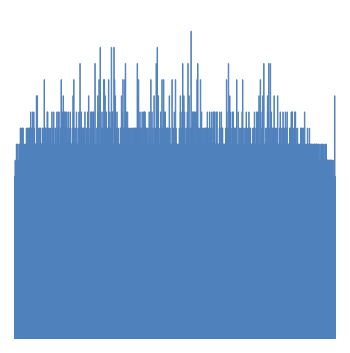
| Category | Series 1 |
|---|---|
| 0 | 0 |
| 1 | 0 |
| 2 | 0 |
| 3 | 0 |
| 4 | 0 |
| 5 | 0 |
| 6 | 0 |
| 7 | 0 |
| 8 | 0 |
| 9 | 0 |
| 10 | 0 |
| 11 | 0 |
| 12 | 0 |
| 13 | 0 |
| 14 | 0 |
| 15 | 0 |
| 16 | 0 |
| 17 | 0 |
| 18 | 0 |
| 19 | 0 |
| 20 | 0 |
| 21 | 0 |
| 22 | 0 |
| 23 | 0 |
| 24 | 0 |
| 25 | 0 |
| 26 | 0 |
| 27 | 0 |
| 28 | 0 |
| 29 | 0 |
| 30 | 0 |
| 31 | 0 |
| 32 | 0 |
| 33 | 0 |
| 34 | 0 |
| 35 | 0 |
| 36 | 0 |
| 37 | 0 |
| 38 | 0 |
| 39 | 0 |
| 40 | 0 |
| 41 | 0 |
| 42 | 0 |
| 43 | 0 |
| 44 | 0 |
| 45 | 0 |
| 46 | 0 |
| 47 | 0 |
| 48 | 0 |
| 49 | 0 |
| 50 | 0 |
| 51 | 0 |
| 52 | 0 |
| 53 | 0 |
| 54 | 0 |
| 55 | 0 |
| 56 | 0 |
| 57 | 0 |
| 58 | 0 |
| 59 | 0 |
| 60 | 0 |
| 61 | 0 |
| 62 | 0 |
| 63 | 0 |
| 64 | 0 |
| 65 | 0 |
| 66 | 0 |
| 67 | 0 |
| 68 | 0 |
| 69 | 0 |
| 70 | 0 |
| 71 | 0 |
| 72 | 0 |
| 73 | 0 |
| 74 | 0 |
| 75 | 0 |
| 76 | 0 |
| 77 | 0 |
| 78 | 0 |
| 79 | 0 |
| 80 | 0 |
| 81 | 0 |
| 82 | 0 |
| 83 | 0 |
| 84 | 0 |
| 85 | 0 |
| 86 | 0 |
| 87 | 0 |
| 88 | 0 |
| 89 | 0 |
| 90 | 0 |
| 91 | 0 |
| 92 | 0 |
| 93 | 0 |
| 94 | 0 |
| 95 | 0 |
| 96 | 0 |
| 97 | 0 |
| 98 | 0 |
| 99 | 0 |
| 100 | 0 |
| 101 | 0 |
| 102 | 0 |
| 103 | 0 |
| 104 | 0 |
| 105 | 0 |
| 106 | 0 |
| 107 | 0 |
| 108 | 0 |
| 109 | 0 |
| 110 | 0 |
| 111 | 0 |
| 112 | 0 |
| 113 | 0 |
| 114 | 0 |
| 115 | 0 |
| 116 | 0 |
| 117 | 0 |
| 118 | 0 |
| 119 | 0 |
| 120 | 0 |
| 121 | 0 |
| 122 | 0 |
| 123 | 0 |
| 124 | 0 |
| 125 | 0 |
| 126 | 0 |
| 127 | 0 |
| 128 | 0 |
| 129 | 0 |
| 130 | 0 |
| 131 | 0 |
| 132 | 0 |
| 133 | 0 |
| 134 | 0 |
| 135 | 0 |
| 136 | 0 |
| 137 | 0 |
| 138 | 0 |
| 139 | 0 |
| 140 | 0 |
| 141 | 0 |
| 142 | 0 |
| 143 | 0 |
| 144 | 0 |
| 145 | 0 |
| 146 | 0 |
| 147 | 0 |
| 148 | 0 |
| 149 | 0 |
| 150 | 0 |
| 151 | 0 |
| 152 | 0 |
| 153 | 0 |
| 154 | 0 |
| 155 | 0 |
| 156 | 0 |
| 157 | 0 |
| 158 | 0 |
| 159 | 0 |
| 160 | 0 |
| 161 | 0 |
| 162 | 0 |
| 163 | 0 |
| 164 | 0 |
| 165 | 0 |
| 166 | 0 |
| 167 | 0 |
| 168 | 0 |
| 169 | 0 |
| 170 | 0 |
| 171 | 0 |
| 172 | 0 |
| 173 | 0 |
| 174 | 0 |
| 175 | 0 |
| 176 | 0 |
| 177 | 0 |
| 178 | 0 |
| 179 | 0 |
| 180 | 0 |
| 181 | 0 |
| 182 | 0 |
| 183 | 0 |
| 184 | 0 |
| 185 | 0 |
| 186 | 0 |
| 187 | 0 |
| 188 | 0 |
| 189 | 0 |
| 190 | 0 |
| 191 | 0 |
| 192 | 0 |
| 193 | 0 |
| 194 | 0 |
| 195 | 0 |
| 196 | 0 |
| 197 | 0 |
| 198 | 0 |
| 199 | 0 |
| 200 | 0 |
| 201 | 0 |
| 202 | 0 |
| 203 | 0 |
| 204 | 0 |
| 205 | 0 |
| 206 | 0 |
| 207 | 0 |
| 208 | 0 |
| 209 | 0 |
| 210 | 0 |
| 211 | 0 |
| 212 | 0 |
| 213 | 0 |
| 214 | 0 |
| 215 | 0 |
| 216 | 0 |
| 217 | 0 |
| 218 | 0 |
| 219 | 0 |
| 220 | 0 |
| 221 | 0 |
| 222 | 0 |
| 223 | 0 |
| 224 | 0 |
| 225 | 0 |
| 226 | 0 |
| 227 | 0 |
| 228 | 0 |
| 229 | 0 |
| 230 | 0 |
| 231 | 0 |
| 232 | 0 |
| 233 | 0 |
| 234 | 0 |
| 235 | 0 |
| 236 | 0 |
| 237 | 0 |
| 238 | 0 |
| 239 | 0 |
| 240 | 0 |
| 241 | 0 |
| 242 | 0 |
| 243 | 0 |
| 244 | 0 |
| 245 | 0 |
| 246 | 0 |
| 247 | 0 |
| 248 | 0 |
| 249 | 0 |
| 250 | 0 |
| 251 | 0 |
| 252 | 0 |
| 253 | 0 |
| 254 | 0 |
| 255 | 0 |
| 256 | 0 |
| 257 | 0 |
| 258 | 0 |
| 259 | 0 |
| 260 | 0 |
| 261 | 0 |
| 262 | 0 |
| 263 | 0 |
| 264 | 0 |
| 265 | 0 |
| 266 | 0 |
| 267 | 0 |
| 268 | 0 |
| 269 | 0 |
| 270 | 0 |
| 271 | 0 |
| 272 | 0 |
| 273 | 0 |
| 274 | 0 |
| 275 | 0 |
| 276 | 0 |
| 277 | 0 |
| 278 | 0 |
| 279 | 0 |
| 280 | 0 |
| 281 | 0 |
| 282 | 0 |
| 283 | 0 |
| 284 | 0 |
| 285 | 0 |
| 286 | 0 |
| 287 | 0 |
| 288 | 0 |
| 289 | 0 |
| 290 | 0 |
| 291 | 0 |
| 292 | 0 |
| 293 | 0 |
| 294 | 0 |
| 295 | 0 |
| 296 | 0 |
| 297 | 0 |
| 298 | 0 |
| 299 | 0 |
| 300 | 0 |
| 301 | 0 |
| 302 | 0 |
| 303 | 0 |
| 304 | 0 |
| 305 | 0 |
| 306 | 0 |
| 307 | 0 |
| 308 | 0 |
| 309 | 0 |
| 310 | 0 |
| 311 | 0 |
| 312 | 0 |
| 313 | 0 |
| 314 | 0 |
| 315 | 0 |
| 316 | 0 |
| 317 | 0 |
| 318 | 0 |
| 319 | 0 |
| 320 | 0 |
| 321 | 0 |
| 322 | 0 |
| 323 | 0 |
| 324 | 0 |
| 325 | 0 |
| 326 | 0 |
| 327 | 0 |
| 328 | 0 |
| 329 | 0 |
| 330 | 0 |
| 331 | 0 |
| 332 | 0 |
| 333 | 0 |
| 334 | 0 |
| 335 | 0 |
| 336 | 0 |
| 337 | 0 |
| 338 | 0 |
| 339 | 0 |
| 340 | 0 |
| 341 | 0 |
| 342 | 0 |
| 343 | 0 |
| 344 | 0 |
| 345 | 0 |
| 346 | 0 |
| 347 | 0 |
| 348 | 0 |
| 349 | 0 |
| 350 | 0 |
| 351 | 0 |
| 352 | 0 |
| 353 | 0 |
| 354 | 0 |
| 355 | 0 |
| 356 | 0 |
| 357 | 0 |
| 358 | 0 |
| 359 | 0 |
| 360 | 0 |
| 361 | 0 |
| 362 | 0 |
| 363 | 0 |
| 364 | 0 |
| 365 | 0 |
| 366 | 0 |
| 367 | 0 |
| 368 | 0 |
| 369 | 0 |
| 370 | 0 |
| 371 | 0 |
| 372 | 0 |
| 373 | 0 |
| 374 | 0 |
| 375 | 0 |
| 376 | 0 |
| 377 | 0 |
| 378 | 0 |
| 379 | 0 |
| 380 | 0 |
| 381 | 0 |
| 382 | 0 |
| 383 | 0 |
| 384 | 0 |
| 385 | 0 |
| 386 | 0 |
| 387 | 0 |
| 388 | 0 |
| 389 | 0 |
| 390 | 0 |
| 391 | 0 |
| 392 | 0 |
| 393 | 0 |
| 394 | 0 |
| 395 | 0 |
| 396 | 0 |
| 397 | 0 |
| 398 | 0 |
| 399 | 0 |
| 400 | 0 |
| 401 | 0 |
| 402 | 0 |
| 403 | 0 |
| 404 | 0 |
| 405 | 0 |
| 406 | 0 |
| 407 | 0 |
| 408 | 0 |
| 409 | 0 |
| 410 | 0 |
| 411 | 0 |
| 412 | 0 |
| 413 | 0 |
| 414 | 0 |
| 415 | 0 |
| 416 | 0 |
| 417 | 0 |
| 418 | 0 |
| 419 | 0 |
| 420 | 0 |
| 421 | 0 |
| 422 | 0 |
| 423 | 0 |
| 424 | 0 |
| 425 | 0 |
| 426 | 0 |
| 427 | 0 |
| 428 | 0 |
| 429 | 0 |
| 430 | 0 |
| 431 | 0 |
| 432 | 0 |
| 433 | 0 |
| 434 | 0 |
| 435 | 0 |
| 436 | 0 |
| 437 | 0 |
| 438 | 0 |
| 439 | 0 |
| 440 | 0 |
| 441 | 0 |
| 442 | 0 |
| 443 | 0 |
| 444 | 0 |
| 445 | 0 |
| 446 | 0 |
| 447 | 0 |
| 448 | 0 |
| 449 | 0 |
| 450 | 0 |
| 451 | 0 |
| 452 | 0 |
| 453 | 0 |
| 454 | 0 |
| 455 | 0 |
| 456 | 0 |
| 457 | 0 |
| 458 | 0 |
| 459 | 0 |
| 460 | 0 |
| 461 | 0 |
| 462 | 0 |
| 463 | 0 |
| 464 | 0 |
| 465 | 0 |
| 466 | 0 |
| 467 | 0 |
| 468 | 0 |
| 469 | 0 |
| 470 | 0 |
| 471 | 0 |
| 472 | 0 |
| 473 | 0 |
| 474 | 0 |
| 475 | 0 |
| 476 | 0 |
| 477 | 0 |
| 478 | 0 |
| 479 | 0 |
| 480 | 0 |
| 481 | 0 |
| 482 | 0 |
| 483 | 0 |
| 484 | 0 |
| 485 | 0 |
| 486 | 0 |
| 487 | 0 |
| 488 | 0 |
| 489 | 0 |
| 490 | 0 |
| 491 | 0 |
| 492 | 0 |
| 493 | 0 |
| 494 | 0 |
| 495 | 0 |
| 496 | 0 |
| 497 | 0 |
| 498 | 0 |
| 499 | 0 |
| 500 | 0 |
| 501 | 0 |
| 502 | 0 |
| 503 | 0 |
| 504 | 0 |
| 505 | 0 |
| 506 | 0 |
| 507 | 0 |
| 508 | 0 |
| 509 | 0 |
| 510 | 0 |
| 511 | 0 |
| 512 | 0 |
| 513 | 0 |
| 514 | 0 |
| 515 | 0 |
| 516 | 0 |
| 517 | 0 |
| 518 | 0 |
| 519 | 0 |
| 520 | 0 |
| 521 | 0 |
| 522 | 0 |
| 523 | 0 |
| 524 | 0 |
| 525 | 0 |
| 526 | 0 |
| 527 | 0 |
| 528 | 0 |
| 529 | 0 |
| 530 | 0 |
| 531 | 0 |
| 532 | 0 |
| 533 | 0 |
| 534 | 0 |
| 535 | 0 |
| 536 | 0 |
| 537 | 0 |
| 538 | 0 |
| 539 | 0 |
| 540 | 0 |
| 541 | 0 |
| 542 | 0 |
| 543 | 0 |
| 544 | 0 |
| 545 | 0 |
| 546 | 0 |
| 547 | 0 |
| 548 | 0 |
| 549 | 0 |
| 550 | 0 |
| 551 | 0 |
| 552 | 0 |
| 553 | 0 |
| 554 | 0 |
| 555 | 0 |
| 556 | 0 |
| 557 | 0 |
| 558 | 0 |
| 559 | 0 |
| 560 | 0 |
| 561 | 0 |
| 562 | 0 |
| 563 | 0 |
| 564 | 0 |
| 565 | 0 |
| 566 | 0 |
| 567 | 0 |
| 568 | 0 |
| 569 | 0 |
| 570 | 0 |
| 571 | 0 |
| 572 | 0 |
| 573 | 0 |
| 574 | 0 |
| 575 | 0 |
| 576 | 0 |
| 577 | 0 |
| 578 | 0 |
| 579 | 0 |
| 580 | 0 |
| 581 | 0 |
| 582 | 0 |
| 583 | 0 |
| 584 | 0 |
| 585 | 0 |
| 586 | 0 |
| 587 | 0 |
| 588 | 0 |
| 589 | 0 |
| 590 | 0 |
| 591 | 0 |
| 592 | 0 |
| 593 | 0 |
| 594 | 0 |
| 595 | 0 |
| 596 | 0 |
| 597 | 0 |
| 598 | 0 |
| 599 | 0 |
| 600 | 0 |
| 601 | 0 |
| 602 | 0 |
| 603 | 0 |
| 604 | 0 |
| 605 | 0 |
| 606 | 0 |
| 607 | 0 |
| 608 | 0 |
| 609 | 0 |
| 610 | 0 |
| 611 | 0 |
| 612 | 0 |
| 613 | 0 |
| 614 | 0 |
| 615 | 0 |
| 616 | 0 |
| 617 | 0 |
| 618 | 0 |
| 619 | 0 |
| 620 | 0 |
| 621 | 0 |
| 622 | 0 |
| 623 | 0 |
| 624 | 0 |
| 625 | 0 |
| 626 | 0 |
| 627 | 0 |
| 628 | 0 |
| 629 | 0 |
| 630 | 0 |
| 631 | 0 |
| 632 | 0 |
| 633 | 0 |
| 634 | 0 |
| 635 | 0 |
| 636 | 0 |
| 637 | 0 |
| 638 | 0 |
| 639 | 0 |
| 640 | 0 |
| 641 | 0 |
| 642 | 0 |
| 643 | 0 |
| 644 | 0 |
| 645 | 0 |
| 646 | 0 |
| 647 | 0 |
| 648 | 0 |
| 649 | 0 |
| 650 | 0 |
| 651 | 0 |
| 652 | 0 |
| 653 | 0 |
| 654 | 0 |
| 655 | 0 |
| 656 | 0 |
| 657 | 0 |
| 658 | 0 |
| 659 | 0 |
| 660 | 0 |
| 661 | 0 |
| 662 | 0 |
| 663 | 0 |
| 664 | 0 |
| 665 | 0 |
| 666 | 0 |
| 667 | 0 |
| 668 | 0 |
| 669 | 0 |
| 670 | 0 |
| 671 | 0 |
| 672 | 0 |
| 673 | 0 |
| 674 | 0 |
| 675 | 0 |
| 676 | 0 |
| 677 | 0 |
| 678 | 0 |
| 679 | 0 |
| 680 | 0 |
| 681 | 0 |
| 682 | 0 |
| 683 | 0 |
| 684 | 0 |
| 685 | 0 |
| 686 | 0 |
| 687 | 0 |
| 688 | 0 |
| 689 | 0 |
| 690 | 0 |
| 691 | 0 |
| 692 | 0 |
| 693 | 0 |
| 694 | 0 |
| 695 | 0 |
| 696 | 0 |
| 697 | 0 |
| 698 | 0 |
| 699 | 0 |
| 700 | 0 |
| 701 | 0 |
| 702 | 0 |
| 703 | 0 |
| 704 | 0 |
| 705 | 0 |
| 706 | 0 |
| 707 | 0 |
| 708 | 0 |
| 709 | 0 |
| 710 | 0 |
| 711 | 0 |
| 712 | 0 |
| 713 | 0 |
| 714 | 0 |
| 715 | 0 |
| 716 | 0 |
| 717 | 0 |
| 718 | 0 |
| 719 | 0 |
| 720 | 0 |
| 721 | 0 |
| 722 | 0 |
| 723 | 0 |
| 724 | 0 |
| 725 | 0 |
| 726 | 0 |
| 727 | 0 |
| 728 | 0 |
| 729 | 0 |
| 730 | 0 |
| 731 | 0 |
| 732 | 0 |
| 733 | 0 |
| 734 | 0 |
| 735 | 0 |
| 736 | 0 |
| 737 | 0 |
| 738 | 0 |
| 739 | 0 |
| 740 | 0 |
| 741 | 0 |
| 742 | 0 |
| 743 | 0 |
| 744 | 0 |
| 745 | 0 |
| 746 | 0 |
| 747 | 0 |
| 748 | 0 |
| 749 | 0 |
| 750 | 0 |
| 751 | 0 |
| 752 | 0 |
| 753 | 0 |
| 754 | 0 |
| 755 | 0 |
| 756 | 0 |
| 757 | 0 |
| 758 | 0 |
| 759 | 0 |
| 760 | 0 |
| 761 | 0 |
| 762 | 0 |
| 763 | 0 |
| 764 | 0 |
| 765 | 0 |
| 766 | 0 |
| 767 | 0 |
| 768 | 0 |
| 769 | 0 |
| 770 | 0 |
| 771 | 0 |
| 772 | 0 |
| 773 | 0 |
| 774 | 0 |
| 775 | 0 |
| 776 | 0 |
| 777 | 0 |
| 778 | 0 |
| 779 | 0 |
| 780 | 0 |
| 781 | 0 |
| 782 | 0 |
| 783 | 0 |
| 784 | 0 |
| 785 | 0 |
| 786 | 0 |
| 787 | 0 |
| 788 | 0 |
| 789 | 0 |
| 790 | 0 |
| 791 | 0 |
| 792 | 0 |
| 793 | 0 |
| 794 | 0 |
| 795 | 0 |
| 796 | 0 |
| 797 | 0 |
| 798 | 0 |
| 799 | 0 |
| 800 | 0 |
| 801 | 0 |
| 802 | 0 |
| 803 | 0 |
| 804 | 0 |
| 805 | 0 |
| 806 | 0 |
| 807 | 0 |
| 808 | 0 |
| 809 | 0 |
| 810 | 0 |
| 811 | 0 |
| 812 | 0 |
| 813 | 0 |
| 814 | 0 |
| 815 | 0 |
| 816 | 0 |
| 817 | 0 |
| 818 | 0 |
| 819 | 0 |
| 820 | 0 |
| 821 | 0 |
| 822 | 0 |
| 823 | 0 |
| 824 | 0 |
| 825 | 0 |
| 826 | 0 |
| 827 | 0 |
| 828 | 0 |
| 829 | 0 |
| 830 | 0 |
| 831 | 0 |
| 832 | 0 |
| 833 | 0 |
| 834 | 0 |
| 835 | 0 |
| 836 | 0 |
| 837 | 0 |
| 838 | 0 |
| 839 | 0 |
| 840 | 0 |
| 841 | 0 |
| 842 | 0 |
| 843 | 0 |
| 844 | 0 |
| 845 | 0 |
| 846 | 0 |
| 847 | 0 |
| 848 | 0 |
| 849 | 0 |
| 850 | 0 |
| 851 | 0 |
| 852 | 0 |
| 853 | 0 |
| 854 | 0 |
| 855 | 0 |
| 856 | 0 |
| 857 | 0 |
| 858 | 0 |
| 859 | 0 |
| 860 | 0 |
| 861 | 0 |
| 862 | 0 |
| 863 | 0 |
| 864 | 0 |
| 865 | 0 |
| 866 | 0 |
| 867 | 0 |
| 868 | 0 |
| 869 | 0 |
| 870 | 0 |
| 871 | 0 |
| 872 | 0 |
| 873 | 0 |
| 874 | 0 |
| 875 | 0 |
| 876 | 0 |
| 877 | 0 |
| 878 | 0 |
| 879 | 0 |
| 880 | 0 |
| 881 | 0 |
| 882 | 0 |
| 883 | 0 |
| 884 | 0 |
| 885 | 0 |
| 886 | 0 |
| 887 | 0 |
| 888 | 0 |
| 889 | 0 |
| 890 | 0 |
| 891 | 0 |
| 892 | 0 |
| 893 | 0 |
| 894 | 0 |
| 895 | 0 |
| 896 | 0 |
| 897 | 0 |
| 898 | 0 |
| 899 | 0 |
| 900 | 0 |
| 901 | 0 |
| 902 | 0 |
| 903 | 0 |
| 904 | 0 |
| 905 | 0 |
| 906 | 0 |
| 907 | 0 |
| 908 | 0 |
| 909 | 0 |
| 910 | 0 |
| 911 | 0 |
| 912 | 0 |
| 913 | 0 |
| 914 | 0 |
| 915 | 0 |
| 916 | 0 |
| 917 | 0 |
| 918 | 0 |
| 919 | 0 |
| 920 | 0 |
| 921 | 0 |
| 922 | 0 |
| 923 | 0 |
| 924 | 0 |
| 925 | 0 |
| 926 | 0 |
| 927 | 0 |
| 928 | 0 |
| 929 | 0 |
| 930 | 0 |
| 931 | 0 |
| 932 | 0 |
| 933 | 0 |
| 934 | 0 |
| 935 | 0 |
| 936 | 0 |
| 937 | 0 |
| 938 | 0 |
| 939 | 0 |
| 940 | 0 |
| 941 | 0 |
| 942 | 0 |
| 943 | 0 |
| 944 | 0 |
| 945 | 0 |
| 946 | 0 |
| 947 | 0 |
| 948 | 0 |
| 949 | 0 |
| 950 | 0 |
| 951 | 0 |
| 952 | 0 |
| 953 | 0 |
| 954 | 0 |
| 955 | 0 |
| 956 | 0 |
| 957 | 0 |
| 958 | 0 |
| 959 | 0 |
| 960 | 0 |
| 961 | 0 |
| 962 | 0 |
| 963 | 0 |
| 964 | 0 |
| 965 | 0 |
| 966 | 0 |
| 967 | 0 |
| 968 | 0 |
| 969 | 0 |
| 970 | 0 |
| 971 | 0 |
| 972 | 0 |
| 973 | 0 |
| 974 | 0 |
| 975 | 0 |
| 976 | 0 |
| 977 | 0 |
| 978 | 0 |
| 979 | 0 |
| 980 | 0 |
| 981 | 0 |
| 982 | 0 |
| 983 | 0 |
| 984 | 0 |
| 985 | 0 |
| 986 | 0 |
| 987 | 0 |
| 988 | 0 |
| 989 | 0 |
| 990 | 0 |
| 991 | 0 |
| 992 | 0 |
| 993 | 0 |
| 994 | 0 |
| 995 | 0 |
| 996 | 0 |
| 997 | 0 |
| 998 | 0 |
| 999 | 0 |
| 1000 | 0 |
| 1001 | 0 |
| 1002 | 0 |
| 1003 | 0 |
| 1004 | 0 |
| 1005 | 0 |
| 1006 | 0 |
| 1007 | 0 |
| 1008 | 0 |
| 1009 | 0 |
| 1010 | 0 |
| 1011 | 0 |
| 1012 | 0 |
| 1013 | 0 |
| 1014 | 0 |
| 1015 | 0 |
| 1016 | 0 |
| 1017 | 0 |
| 1018 | 0 |
| 1019 | 0 |
| 1020 | 0 |
| 1021 | 0 |
| 1022 | 0 |
| 1023 | 0 |
| 1024 | 0 |
| 1025 | 0 |
| 1026 | 0 |
| 1027 | 0 |
| 1028 | 0 |
| 1029 | 0 |
| 1030 | 0 |
| 1031 | 0 |
| 1032 | 0 |
| 1033 | 0 |
| 1034 | 0 |
| 1035 | 0 |
| 1036 | 0 |
| 1037 | 0 |
| 1038 | 0 |
| 1039 | 0 |
| 1040 | 0 |
| 1041 | 0 |
| 1042 | 0 |
| 1043 | 0 |
| 1044 | 0 |
| 1045 | 0 |
| 1046 | 0 |
| 1047 | 0 |
| 1048 | 0 |
| 1049 | 0 |
| 1050 | 0 |
| 1051 | 0 |
| 1052 | 0 |
| 1053 | 0 |
| 1054 | 0 |
| 1055 | 0 |
| 1056 | 0 |
| 1057 | 0 |
| 1058 | 0 |
| 1059 | 0 |
| 1060 | 0 |
| 1061 | 0 |
| 1062 | 0 |
| 1063 | 0 |
| 1064 | 0 |
| 1065 | 0 |
| 1066 | 0 |
| 1067 | 0 |
| 1068 | 0 |
| 1069 | 0 |
| 1070 | 0 |
| 1071 | 0 |
| 1072 | 0 |
| 1073 | 0 |
| 1074 | 0 |
| 1075 | 0 |
| 1076 | 0 |
| 1077 | 0 |
| 1078 | 0 |
| 1079 | 0 |
| 1080 | 0 |
| 1081 | 0 |
| 1082 | 0 |
| 1083 | 0 |
| 1084 | 0 |
| 1085 | 0 |
| 1086 | 0 |
| 1087 | 0 |
| 1088 | 0 |
| 1089 | 0 |
| 1090 | 0 |
| 1091 | 0 |
| 1092 | 0 |
| 1093 | 0 |
| 1094 | 0 |
| 1095 | 0 |
| 1096 | 0 |
| 1097 | 0 |
| 1098 | 0 |
| 1099 | 0 |
| 1100 | 0 |
| 1101 | 0 |
| 1102 | 0 |
| 1103 | 0 |
| 1104 | 0 |
| 1105 | 0 |
| 1106 | 0 |
| 1107 | 0 |
| 1108 | 0 |
| 1109 | 0 |
| 1110 | 0 |
| 1111 | 0 |
| 1112 | 0 |
| 1113 | 0 |
| 1114 | 0 |
| 1115 | 0 |
| 1116 | 0 |
| 1117 | 0 |
| 1118 | 0 |
| 1119 | 0 |
| 1120 | 0 |
| 1121 | 0 |
| 1122 | 0 |
| 1123 | 0 |
| 1124 | 0 |
| 1125 | 0 |
| 1126 | 0 |
| 1127 | 0 |
| 1128 | 0 |
| 1129 | 0 |
| 1130 | 0 |
| 1131 | 0 |
| 1132 | 0 |
| 1133 | 0 |
| 1134 | 0 |
| 1135 | 0 |
| 1136 | 0 |
| 1137 | 0 |
| 1138 | 0 |
| 1139 | 0 |
| 1140 | 0 |
| 1141 | 0 |
| 1142 | 0 |
| 1143 | 0 |
| 1144 | 0 |
| 1145 | 0 |
| 1146 | 0 |
| 1147 | 0 |
| 1148 | 0 |
| 1149 | 0 |
| 1150 | 0 |
| 1151 | 0 |
| 1152 | 0 |
| 1153 | 0 |
| 1154 | 0 |
| 1155 | 0 |
| 1156 | 0 |
| 1157 | 0 |
| 1158 | 0 |
| 1159 | 0 |
| 1160 | 0 |
| 1161 | 0 |
| 1162 | 0 |
| 1163 | 0 |
| 1164 | 0 |
| 1165 | 0 |
| 1166 | 0 |
| 1167 | 0 |
| 1168 | 0 |
| 1169 | 0 |
| 1170 | 0 |
| 1171 | 0 |
| 1172 | 0 |
| 1173 | 0 |
| 1174 | 0 |
| 1175 | 0 |
| 1176 | 0 |
| 1177 | 0 |
| 1178 | 0 |
| 1179 | 0 |
| 1180 | 0 |
| 1181 | 0 |
| 1182 | 0 |
| 1183 | 0 |
| 1184 | 0 |
| 1185 | 0 |
| 1186 | 0 |
| 1187 | 0 |
| 1188 | 0 |
| 1189 | 0 |
| 1190 | 0 |
| 1191 | 0 |
| 1192 | 0 |
| 1193 | 0 |
| 1194 | 0 |
| 1195 | 0 |
| 1196 | 0 |
| 1197 | 0 |
| 1198 | 0 |
| 1199 | 0 |
| 1200 | 0 |
| 1201 | 0 |
| 1202 | 0 |
| 1203 | 0 |
| 1204 | 0 |
| 1205 | 0 |
| 1206 | 0 |
| 1207 | 0 |
| 1208 | 0 |
| 1209 | 0 |
| 1210 | 0 |
| 1211 | 0 |
| 1212 | 0 |
| 1213 | 0 |
| 1214 | 0 |
| 1215 | 0 |
| 1216 | 0 |
| 1217 | 0 |
| 1218 | 0 |
| 1219 | 0 |
| 1220 | 0 |
| 1221 | 0 |
| 1222 | 0 |
| 1223 | 0 |
| 1224 | 0 |
| 1225 | 0 |
| 1226 | 0 |
| 1227 | 0 |
| 1228 | 0 |
| 1229 | 0 |
| 1230 | 0 |
| 1231 | 0 |
| 1232 | 0 |
| 1233 | 0 |
| 1234 | 0 |
| 1235 | 0 |
| 1236 | 0 |
| 1237 | 0 |
| 1238 | 0 |
| 1239 | 0 |
| 1240 | 0 |
| 1241 | 0 |
| 1242 | 0 |
| 1243 | 0 |
| 1244 | 0 |
| 1245 | 0 |
| 1246 | 0 |
| 1247 | 0 |
| 1248 | 0 |
| 1249 | 0 |
| 1250 | 0 |
| 1251 | 0 |
| 1252 | 0 |
| 1253 | 0 |
| 1254 | 0 |
| 1255 | 0 |
| 1256 | 0 |
| 1257 | 0 |
| 1258 | 0 |
| 1259 | 0 |
| 1260 | 0 |
| 1261 | 0 |
| 1262 | 0 |
| 1263 | 0 |
| 1264 | 0 |
| 1265 | 0 |
| 1266 | 0 |
| 1267 | 0 |
| 1268 | 0 |
| 1269 | 0 |
| 1270 | 0 |
| 1271 | 0 |
| 1272 | 0 |
| 1273 | 0 |
| 1274 | 0 |
| 1275 | 0 |
| 1276 | 0 |
| 1277 | 0 |
| 1278 | 0 |
| 1279 | 0 |
| 1280 | 0 |
| 1281 | 0 |
| 1282 | 0 |
| 1283 | 0 |
| 1284 | 0 |
| 1285 | 0 |
| 1286 | 0 |
| 1287 | 0 |
| 1288 | 0 |
| 1289 | 0 |
| 1290 | 0 |
| 1291 | 0 |
| 1292 | 0 |
| 1293 | 0 |
| 1294 | 0 |
| 1295 | 0 |
| 1296 | 0 |
| 1297 | 0 |
| 1298 | 0 |
| 1299 | 0 |
| 1300 | 0 |
| 1301 | 0 |
| 1302 | 0 |
| 1303 | 0 |
| 1304 | 0 |
| 1305 | 0 |
| 1306 | 0 |
| 1307 | 0 |
| 1308 | 0 |
| 1309 | 0 |
| 1310 | 0 |
| 1311 | 0 |
| 1312 | 0 |
| 1313 | 0 |
| 1314 | 0 |
| 1315 | 0 |
| 1316 | 0 |
| 1317 | 0 |
| 1318 | 0 |
| 1319 | 0 |
| 1320 | 0 |
| 1321 | 0 |
| 1322 | 0 |
| 1323 | 0 |
| 1324 | 0 |
| 1325 | 0 |
| 1326 | 0 |
| 1327 | 0 |
| 1328 | 0 |
| 1329 | 0 |
| 1330 | 0 |
| 1331 | 0 |
| 1332 | 0 |
| 1333 | 0 |
| 1334 | 0 |
| 1335 | 0 |
| 1336 | 0 |
| 1337 | 0 |
| 1338 | 0 |
| 1339 | 0 |
| 1340 | 0 |
| 1341 | 0 |
| 1342 | 0 |
| 1343 | 0 |
| 1344 | 0 |
| 1345 | 0 |
| 1346 | 0 |
| 1347 | 0 |
| 1348 | 0 |
| 1349 | 0 |
| 1350 | 0 |
| 1351 | 0 |
| 1352 | 0 |
| 1353 | 0 |
| 1354 | 0 |
| 1355 | 0 |
| 1356 | 0 |
| 1357 | 0 |
| 1358 | 0 |
| 1359 | 0 |
| 1360 | 0 |
| 1361 | 0 |
| 1362 | 0 |
| 1363 | 0 |
| 1364 | 0 |
| 1365 | 0 |
| 1366 | 0 |
| 1367 | 0 |
| 1368 | 0 |
| 1369 | 0 |
| 1370 | 0 |
| 1371 | 0 |
| 1372 | 0 |
| 1373 | 0 |
| 1374 | 0 |
| 1375 | 0 |
| 1376 | 0 |
| 1377 | 0 |
| 1378 | 0 |
| 1379 | 0 |
| 1380 | 0 |
| 1381 | 0 |
| 1382 | 0 |
| 1383 | 0 |
| 1384 | 0 |
| 1385 | 0 |
| 1386 | 0 |
| 1387 | 0 |
| 1388 | 0 |
| 1389 | 0 |
| 1390 | 0 |
| 1391 | 0 |
| 1392 | 0 |
| 1393 | 0 |
| 1394 | 0 |
| 1395 | 0 |
| 1396 | 0 |
| 1397 | 0 |
| 1398 | 0 |
| 1399 | 0 |
| 1400 | 0 |
| 1401 | 0 |
| 1402 | 0 |
| 1403 | 0 |
| 1404 | 0 |
| 1405 | 0 |
| 1406 | 0 |
| 1407 | 0 |
| 1408 | 0 |
| 1409 | 0 |
| 1410 | 0 |
| 1411 | 0 |
| 1412 | 0 |
| 1413 | 0 |
| 1414 | 0 |
| 1415 | 0 |
| 1416 | 0 |
| 1417 | 0 |
| 1418 | 0 |
| 1419 | 0 |
| 1420 | 0 |
| 1421 | 0 |
| 1422 | 0 |
| 1423 | 0 |
| 1424 | 0 |
| 1425 | 0 |
| 1426 | 0 |
| 1427 | 0 |
| 1428 | 0 |
| 1429 | 0 |
| 1430 | 0 |
| 1431 | 0 |
| 1432 | 0 |
| 1433 | 0 |
| 1434 | 0 |
| 1435 | 0 |
| 1436 | 0 |
| 1437 | 0 |
| 1438 | 0 |
| 1439 | 0 |
| 1440 | 0 |
| 1441 | 0 |
| 1442 | 0 |
| 1443 | 0 |
| 1444 | 0 |
| 1445 | 0 |
| 1446 | 0 |
| 1447 | 0 |
| 1448 | 0 |
| 1449 | 0 |
| 1450 | 0 |
| 1451 | 0 |
| 1452 | 0 |
| 1453 | 0 |
| 1454 | 0 |
| 1455 | 0 |
| 1456 | 0 |
| 1457 | 0 |
| 1458 | 0 |
| 1459 | 0 |
| 1460 | 0 |
| 1461 | 0 |
| 1462 | 0 |
| 1463 | 0 |
| 1464 | 0 |
| 1465 | 0 |
| 1466 | 0 |
| 1467 | 0 |
| 1468 | 0 |
| 1469 | 0 |
| 1470 | 0 |
| 1471 | 0 |
| 1472 | 0 |
| 1473 | 0 |
| 1474 | 0 |
| 1475 | 0 |
| 1476 | 0 |
| 1477 | 0 |
| 1478 | 0 |
| 1479 | 0 |
| 1480 | 0 |
| 1481 | 0 |
| 1482 | 0 |
| 1483 | 0 |
| 1484 | 0 |
| 1485 | 0 |
| 1486 | 0 |
| 1487 | 0 |
| 1488 | 0 |
| 1489 | 0 |
| 1490 | 0 |
| 1491 | 0 |
| 1492 | 0 |
| 1493 | 0 |
| 1494 | 0 |
| 1495 | 0 |
| 1496 | 0 |
| 1497 | 0 |
| 1498 | 0 |
| 1499 | 0 |
| 1500 | 0 |
| 1501 | 0 |
| 1502 | 0 |
| 1503 | 0 |
| 1504 | 0 |
| 1505 | 0 |
| 1506 | 0 |
| 1507 | 0 |
| 1508 | 0 |
| 1509 | 0 |
| 1510 | 0 |
| 1511 | 0 |
| 1512 | 0 |
| 1513 | 0 |
| 1514 | 0 |
| 1515 | 0 |
| 1516 | 0 |
| 1517 | 0 |
| 1518 | 0 |
| 1519 | 0 |
| 1520 | 0 |
| 1521 | 0 |
| 1522 | 0 |
| 1523 | 0 |
| 1524 | 0 |
| 1525 | 0 |
| 1526 | 0 |
| 1527 | 0 |
| 1528 | 0 |
| 1529 | 0 |
| 1530 | 0 |
| 1531 | 0 |
| 1532 | 0 |
| 1533 | 0 |
| 1534 | 0 |
| 1535 | 0 |
| 1536 | 0 |
| 1537 | 0 |
| 1538 | 0 |
| 1539 | 0 |
| 1540 | 0 |
| 1541 | 0 |
| 1542 | 0 |
| 1543 | 0 |
| 1544 | 0 |
| 1545 | 0 |
| 1546 | 0 |
| 1547 | 0 |
| 1548 | 0 |
| 1549 | 0 |
| 1550 | 0 |
| 1551 | 0 |
| 1552 | 0 |
| 1553 | 0 |
| 1554 | 0 |
| 1555 | 0 |
| 1556 | 0 |
| 1557 | 0 |
| 1558 | 0 |
| 1559 | 0 |
| 1560 | 0 |
| 1561 | 0 |
| 1562 | 0 |
| 1563 | 0 |
| 1564 | 0 |
| 1565 | 0 |
| 1566 | 0 |
| 1567 | 0 |
| 1568 | 0 |
| 1569 | 0 |
| 1570 | 0 |
| 1571 | 0 |
| 1572 | 0 |
| 1573 | 0 |
| 1574 | 0 |
| 1575 | 0 |
| 1576 | 0 |
| 1577 | 0 |
| 1578 | 0 |
| 1579 | 0 |
| 1580 | 0 |
| 1581 | 0 |
| 1582 | 0 |
| 1583 | 0 |
| 1584 | 0 |
| 1585 | 0 |
| 1586 | 0 |
| 1587 | 0 |
| 1588 | 0 |
| 1589 | 0 |
| 1590 | 0 |
| 1591 | 0 |
| 1592 | 0 |
| 1593 | 0 |
| 1594 | 0 |
| 1595 | 0 |
| 1596 | 0 |
| 1597 | 0 |
| 1598 | 0 |
| 1599 | 0 |
| 1600 | 0 |
| 1601 | 0 |
| 1602 | 0 |
| 1603 | 0 |
| 1604 | 0 |
| 1605 | 0 |
| 1606 | 0 |
| 1607 | 0 |
| 1608 | 0 |
| 1609 | 0 |
| 1610 | 0 |
| 1611 | 0 |
| 1612 | 0 |
| 1613 | 0 |
| 1614 | 0 |
| 1615 | 0 |
| 1616 | 0 |
| 1617 | 0 |
| 1618 | 0 |
| 1619 | 0 |
| 1620 | 0 |
| 1621 | 0 |
| 1622 | 0 |
| 1623 | 0 |
| 1624 | 0 |
| 1625 | 0 |
| 1626 | 0 |
| 1627 | 0 |
| 1628 | 0 |
| 1629 | 0 |
| 1630 | 0 |
| 1631 | 0 |
| 1632 | 0 |
| 1633 | 0 |
| 1634 | 0 |
| 1635 | 0 |
| 1636 | 0 |
| 1637 | 0 |
| 1638 | 0 |
| 1639 | 0 |
| 1640 | 0 |
| 1641 | 0 |
| 1642 | 0 |
| 1643 | 0 |
| 1644 | 0 |
| 1645 | 0 |
| 1646 | 0 |
| 1647 | 0 |
| 1648 | 0 |
| 1649 | 0 |
| 1650 | 0 |
| 1651 | 0 |
| 1652 | 0 |
| 1653 | 0 |
| 1654 | 0 |
| 1655 | 0 |
| 1656 | 0 |
| 1657 | 0 |
| 1658 | 0 |
| 1659 | 0 |
| 1660 | 0 |
| 1661 | 0 |
| 1662 | 0 |
| 1663 | 0 |
| 1664 | 0 |
| 1665 | 0 |
| 1666 | 0 |
| 1667 | 0 |
| 1668 | 0 |
| 1669 | 0 |
| 1670 | 0 |
| 1671 | 0 |
| 1672 | 0 |
| 1673 | 0 |
| 1674 | 0 |
| 1675 | 0 |
| 1676 | 0 |
| 1677 | 0 |
| 1678 | 0 |
| 1679 | 0 |
| 1680 | 0 |
| 1681 | 0 |
| 1682 | 0 |
| 1683 | 0 |
| 1684 | 0 |
| 1685 | 0 |
| 1686 | 0 |
| 1687 | 0 |
| 1688 | 0 |
| 1689 | 0 |
| 1690 | 0 |
| 1691 | 0 |
| 1692 | 0 |
| 1693 | 0 |
| 1694 | 0 |
| 1695 | 0 |
| 1696 | 0 |
| 1697 | 0 |
| 1698 | 0 |
| 1699 | 0 |
| 1700 | 0 |
| 1701 | 0 |
| 1702 | 0 |
| 1703 | 0 |
| 1704 | 0 |
| 1705 | 0 |
| 1706 | 0 |
| 1707 | 0 |
| 1708 | 0 |
| 1709 | 0 |
| 1710 | 0 |
| 1711 | 0 |
| 1712 | 0 |
| 1713 | 0 |
| 1714 | 0 |
| 1715 | 0 |
| 1716 | 0 |
| 1717 | 0 |
| 1718 | 0 |
| 1719 | 0 |
| 1720 | 0 |
| 1721 | 0 |
| 1722 | 0 |
| 1723 | 0 |
| 1724 | 0 |
| 1725 | 0 |
| 1726 | 0 |
| 1727 | 0 |
| 1728 | 0 |
| 1729 | 0 |
| 1730 | 0 |
| 1731 | 0 |
| 1732 | 0 |
| 1733 | 0 |
| 1734 | 0 |
| 1735 | 0 |
| 1736 | 0 |
| 1737 | 0 |
| 1738 | 0 |
| 1739 | 0 |
| 1740 | 0 |
| 1741 | 0 |
| 1742 | 0 |
| 1743 | 0 |
| 1744 | 0 |
| 1745 | 0 |
| 1746 | 0 |
| 1747 | 0 |
| 1748 | 0 |
| 1749 | 0 |
| 1750 | 0 |
| 1751 | 0 |
| 1752 | 0 |
| 1753 | 0 |
| 1754 | 0 |
| 1755 | 0 |
| 1756 | 0 |
| 1757 | 0 |
| 1758 | 0 |
| 1759 | 0 |
| 1760 | 0 |
| 1761 | 0 |
| 1762 | 0 |
| 1763 | 0 |
| 1764 | 0 |
| 1765 | 0 |
| 1766 | 0 |
| 1767 | 0 |
| 1768 | 0 |
| 1769 | 0 |
| 1770 | 0 |
| 1771 | 0 |
| 1772 | 0 |
| 1773 | 0 |
| 1774 | 0 |
| 1775 | 0 |
| 1776 | 0 |
| 1777 | 0 |
| 1778 | 0 |
| 1779 | 0 |
| 1780 | 0 |
| 1781 | 0 |
| 1782 | 0 |
| 1783 | 0 |
| 1784 | 0 |
| 1785 | 0 |
| 1786 | 0 |
| 1787 | 0 |
| 1788 | 0 |
| 1789 | 0 |
| 1790 | 0 |
| 1791 | 0 |
| 1792 | 0 |
| 1793 | 0 |
| 1794 | 0 |
| 1795 | 0 |
| 1796 | 0 |
| 1797 | 0 |
| 1798 | 0 |
| 1799 | 0 |
| 1800 | 0 |
| 1801 | 0 |
| 1802 | 0 |
| 1803 | 0 |
| 1804 | 0 |
| 1805 | 0 |
| 1806 | 0 |
| 1807 | 0 |
| 1808 | 0 |
| 1809 | 0 |
| 1810 | 0 |
| 1811 | 0 |
| 1812 | 0 |
| 1813 | 0 |
| 1814 | 0 |
| 1815 | 0 |
| 1816 | 0 |
| 1817 | 0 |
| 1818 | 0 |
| 1819 | 0 |
| 1820 | 0 |
| 1821 | 0 |
| 1822 | 0 |
| 1823 | 0 |
| 1824 | 0 |
| 1825 | 0 |
| 1826 | 0 |
| 1827 | 0 |
| 1828 | 0 |
| 1829 | 0 |
| 1830 | 0 |
| 1831 | 0 |
| 1832 | 0 |
| 1833 | 0 |
| 1834 | 0 |
| 1835 | 0 |
| 1836 | 0 |
| 1837 | 0 |
| 1838 | 0 |
| 1839 | 0 |
| 1840 | 0 |
| 1841 | 0 |
| 1842 | 0 |
| 1843 | 0 |
| 1844 | 0 |
| 1845 | 0 |
| 1846 | 0 |
| 1847 | 0 |
| 1848 | 0 |
| 1849 | 0 |
| 1850 | 0 |
| 1851 | 0 |
| 1852 | 0 |
| 1853 | 0 |
| 1854 | 0 |
| 1855 | 0 |
| 1856 | 0 |
| 1857 | 0 |
| 1858 | 0 |
| 1859 | 0 |
| 1860 | 0 |
| 1861 | 0 |
| 1862 | 0 |
| 1863 | 0 |
| 1864 | 0 |
| 1865 | 0 |
| 1866 | 0 |
| 1867 | 0 |
| 1868 | 0 |
| 1869 | 0 |
| 1870 | 0 |
| 1871 | 0 |
| 1872 | 0 |
| 1873 | 0 |
| 1874 | 0 |
| 1875 | 0 |
| 1876 | 0 |
| 1877 | 0 |
| 1878 | 0 |
| 1879 | 0 |
| 1880 | 0 |
| 1881 | 0 |
| 1882 | 0 |
| 1883 | 0 |
| 1884 | 0 |
| 1885 | 0 |
| 1886 | 0 |
| 1887 | 0 |
| 1888 | 0 |
| 1889 | 0 |
| 1890 | 0 |
| 1891 | 0 |
| 1892 | 0 |
| 1893 | 0 |
| 1894 | 0 |
| 1895 | 0 |
| 1896 | 0 |
| 1897 | 0 |
| 1898 | 0 |
| 1899 | 0 |
| 1900 | 0 |
| 1901 | 0 |
| 1902 | 0 |
| 1903 | 0 |
| 1904 | 0 |
| 1905 | 0 |
| 1906 | 0 |
| 1907 | 0 |
| 1908 | 0 |
| 1909 | 0 |
| 1910 | 0 |
| 1911 | 0 |
| 1912 | 0 |
| 1913 | 0 |
| 1914 | 0 |
| 1915 | 0 |
| 1916 | 0 |
| 1917 | 0 |
| 1918 | 0 |
| 1919 | 0 |
| 1920 | 0 |
| 1921 | 0 |
| 1922 | 0 |
| 1923 | 0 |
| 1924 | 0 |
| 1925 | 0 |
| 1926 | 0 |
| 1927 | 0 |
| 1928 | 0 |
| 1929 | 0 |
| 1930 | 0 |
| 1931 | 0 |
| 1932 | 0 |
| 1933 | 0 |
| 1934 | 0 |
| 1935 | 0 |
| 1936 | 0 |
| 1937 | 0 |
| 1938 | 0 |
| 1939 | 0 |
| 1940 | 0 |
| 1941 | 0 |
| 1942 | 0 |
| 1943 | 0 |
| 1944 | 0 |
| 1945 | 0 |
| 1946 | 0 |
| 1947 | 0 |
| 1948 | 0 |
| 1949 | 0 |
| 1950 | 0 |
| 1951 | 0 |
| 1952 | 0 |
| 1953 | 0 |
| 1954 | 0 |
| 1955 | 0 |
| 1956 | 0 |
| 1957 | 0 |
| 1958 | 0 |
| 1959 | 0 |
| 1960 | 0 |
| 1961 | 0 |
| 1962 | 0 |
| 1963 | 0 |
| 1964 | 0 |
| 1965 | 0 |
| 1966 | 0 |
| 1967 | 0 |
| 1968 | 0 |
| 1969 | 0 |
| 1970 | 0 |
| 1971 | 0 |
| 1972 | 0 |
| 1973 | 0 |
| 1974 | 0 |
| 1975 | 0 |
| 1976 | 0 |
| 1977 | 0 |
| 1978 | 0 |
| 1979 | 0 |
| 1980 | 0 |
| 1981 | 0 |
| 1982 | 0 |
| 1983 | 0 |
| 1984 | 0 |
| 1985 | 0 |
| 1986 | 0 |
| 1987 | 0 |
| 1988 | 0 |
| 1989 | 0 |
| 1990 | 0 |
| 1991 | 0 |
| 1992 | 0 |
| 1993 | 0 |
| 1994 | 0 |
| 1995 | 0 |
| 1996 | 0 |
| 1997 | 0 |
| 1998 | 0 |
| 1999 | 0 |
| 2000 | 0 |
| 2001 | 0 |
| 2002 | 0 |
| 2003 | 0 |
| 2004 | 0 |
| 2005 | 0 |
| 2006 | 0 |
| 2007 | 0 |
| 2008 | 0 |
| 2009 | 0 |
| 2010 | 0 |
| 2011 | 0 |
| 2012 | 0 |
| 2013 | 0 |
| 2014 | 0 |
| 2015 | 0 |
| 2016 | 0 |
| 2017 | 0 |
| 2018 | 0 |
| 2019 | 0 |
| 2020 | 0 |
| 2021 | 0 |
| 2022 | 0 |
| 2023 | 0 |
| 2024 | 0 |
| 2025 | 0 |
| 2026 | 0 |
| 2027 | 0 |
| 2028 | 0 |
| 2029 | 0 |
| 2030 | 0 |
| 2031 | 0 |
| 2032 | 0 |
| 2033 | 0 |
| 2034 | 0 |
| 2035 | 0 |
| 2036 | 0 |
| 2037 | 0 |
| 2038 | 0 |
| 2039 | 0 |
| 2040 | 0 |
| 2041 | 0 |
| 2042 | 0 |
| 2043 | 0 |
| 2044 | 0 |
| 2045 | 0 |
| 2046 | 0 |
| 2047 | 0 |
| 2048 | 0 |
| 2049 | 0 |
| 2050 | 0 |
| 2051 | 0 |
| 2052 | 0 |
| 2053 | 0 |
| 2054 | 0 |
| 2055 | 0 |
| 2056 | 0 |
| 2057 | 0 |
| 2058 | 0 |
| 2059 | 0 |
| 2060 | 0 |
| 2061 | 0 |
| 2062 | 0 |
| 2063 | 0 |
| 2064 | 0 |
| 2065 | 0 |
| 2066 | 0 |
| 2067 | 0 |
| 2068 | 0 |
| 2069 | 0 |
| 2070 | 0 |
| 2071 | 0 |
| 2072 | 0 |
| 2073 | 0 |
| 2074 | 0 |
| 2075 | 0 |
| 2076 | 0 |
| 2077 | 0 |
| 2078 | 0 |
| 2079 | 0 |
| 2080 | 0 |
| 2081 | 0 |
| 2082 | 0 |
| 2083 | 0 |
| 2084 | 0 |
| 2085 | 0 |
| 2086 | 0 |
| 2087 | 0 |
| 2088 | 0 |
| 2089 | 0 |
| 2090 | 0 |
| 2091 | 0 |
| 2092 | 0 |
| 2093 | 0 |
| 2094 | 0 |
| 2095 | 0 |
| 2096 | 0 |
| 2097 | 0 |
| 2098 | 0 |
| 2099 | 0 |
| 2100 | 0 |
| 2101 | 0 |
| 2102 | 0 |
| 2103 | 0 |
| 2104 | 0 |
| 2105 | 0 |
| 2106 | 0 |
| 2107 | 0 |
| 2108 | 0 |
| 2109 | 0 |
| 2110 | 0 |
| 2111 | 0 |
| 2112 | 0 |
| 2113 | 0 |
| 2114 | 0 |
| 2115 | 0 |
| 2116 | 0 |
| 2117 | 0 |
| 2118 | 0 |
| 2119 | 0 |
| 2120 | 0 |
| 2121 | 0 |
| 2122 | 0 |
| 2123 | 0 |
| 2124 | 0 |
| 2125 | 0 |
| 2126 | 0 |
| 2127 | 0 |
| 2128 | 0 |
| 2129 | 0 |
| 2130 | 0 |
| 2131 | 0 |
| 2132 | 0 |
| 2133 | 0 |
| 2134 | 0 |
| 2135 | 0 |
| 2136 | 0 |
| 2137 | 0 |
| 2138 | 0 |
| 2139 | 0 |
| 2140 | 0 |
| 2141 | 0 |
| 2142 | 0 |
| 2143 | 0 |
| 2144 | 0 |
| 2145 | 0 |
| 2146 | 0 |
| 2147 | 0 |
| 2148 | 0 |
| 2149 | 0 |
| 2150 | 0 |
| 2151 | 0 |
| 2152 | 0 |
| 2153 | 0 |
| 2154 | 0 |
| 2155 | 0 |
| 2156 | 0 |
| 2157 | 0 |
| 2158 | 0 |
| 2159 | 0 |
| 2160 | 0 |
| 2161 | 0 |
| 2162 | 0 |
| 2163 | 0 |
| 2164 | 0 |
| 2165 | 0 |
| 2166 | 0 |
| 2167 | 0 |
| 2168 | 0 |
| 2169 | 0 |
| 2170 | 0 |
| 2171 | 0 |
| 2172 | 0 |
| 2173 | 0 |
| 2174 | 0 |
| 2175 | 0 |
| 2176 | 0 |
| 2177 | 0 |
| 2178 | 0 |
| 2179 | 0 |
| 2180 | 0 |
| 2181 | 0 |
| 2182 | 0 |
| 2183 | 0 |
| 2184 | 0 |
| 2185 | 0 |
| 2186 | 0 |
| 2187 | 0 |
| 2188 | 0 |
| 2189 | 0 |
| 2190 | 0 |
| 2191 | 0 |
| 2192 | 0 |
| 2193 | 0 |
| 2194 | 0 |
| 2195 | 0 |
| 2196 | 0 |
| 2197 | 0 |
| 2198 | 0 |
| 2199 | 0 |
| 2200 | 0 |
| 2201 | 0 |
| 2202 | 0 |
| 2203 | 0 |
| 2204 | 0 |
| 2205 | 0 |
| 2206 | 0 |
| 2207 | 0 |
| 2208 | 0 |
| 2209 | 0 |
| 2210 | 0 |
| 2211 | 0 |
| 2212 | 0 |
| 2213 | 0 |
| 2214 | 0 |
| 2215 | 0 |
| 2216 | 0 |
| 2217 | 0 |
| 2218 | 0 |
| 2219 | 0 |
| 2220 | 0 |
| 2221 | 0 |
| 2222 | 0 |
| 2223 | 0 |
| 2224 | 0 |
| 2225 | 0 |
| 2226 | 0 |
| 2227 | 0 |
| 2228 | 0 |
| 2229 | 0 |
| 2230 | 0 |
| 2231 | 0 |
| 2232 | 0 |
| 2233 | 0 |
| 2234 | 0 |
| 2235 | 0 |
| 2236 | 0 |
| 2237 | 0 |
| 2238 | 0 |
| 2239 | 0 |
| 2240 | 0 |
| 2241 | 0 |
| 2242 | 0 |
| 2243 | 0 |
| 2244 | 0 |
| 2245 | 0 |
| 2246 | 0 |
| 2247 | 0 |
| 2248 | 0 |
| 2249 | 0 |
| 2250 | 0 |
| 2251 | 0 |
| 2252 | 0 |
| 2253 | 0 |
| 2254 | 0 |
| 2255 | 0 |
| 2256 | 0 |
| 2257 | 0 |
| 2258 | 0 |
| 2259 | 0 |
| 2260 | 0 |
| 2261 | 0 |
| 2262 | 0 |
| 2263 | 0 |
| 2264 | 0 |
| 2265 | 0 |
| 2266 | 0 |
| 2267 | 0 |
| 2268 | 0 |
| 2269 | 0 |
| 2270 | 0 |
| 2271 | 0 |
| 2272 | 0 |
| 2273 | 0 |
| 2274 | 0 |
| 2275 | 0 |
| 2276 | 0 |
| 2277 | 0 |
| 2278 | 0 |
| 2279 | 0 |
| 2280 | 0 |
| 2281 | 0 |
| 2282 | 0 |
| 2283 | 0 |
| 2284 | 0 |
| 2285 | 0 |
| 2286 | 0 |
| 2287 | 0 |
| 2288 | 0 |
| 2289 | 0 |
| 2290 | 0 |
| 2291 | 0 |
| 2292 | 0 |
| 2293 | 0 |
| 2294 | 0 |
| 2295 | 0 |
| 2296 | 0 |
| 2297 | 0 |
| 2298 | 0 |
| 2299 | 0 |
| 2300 | 0 |
| 2301 | 0 |
| 2302 | 0 |
| 2303 | 0 |
| 2304 | 0 |
| 2305 | 0 |
| 2306 | 0 |
| 2307 | 0 |
| 2308 | 0 |
| 2309 | 0 |
| 2310 | 0 |
| 2311 | 0 |
| 2312 | 0 |
| 2313 | 0 |
| 2314 | 0 |
| 2315 | 0 |
| 2316 | 0 |
| 2317 | 0 |
| 2318 | 0 |
| 2319 | 0 |
| 2320 | 0 |
| 2321 | 0 |
| 2322 | 0 |
| 2323 | 0 |
| 2324 | 0 |
| 2325 | 0 |
| 2326 | 0 |
| 2327 | 0 |
| 2328 | 0 |
| 2329 | 0 |
| 2330 | 0 |
| 2331 | 0 |
| 2332 | 0 |
| 2333 | 0 |
| 2334 | 0 |
| 2335 | 0 |
| 2336 | 0 |
| 2337 | 0 |
| 2338 | 0 |
| 2339 | 0 |
| 2340 | 0 |
| 2341 | 0 |
| 2342 | 0 |
| 2343 | 0 |
| 2344 | 0 |
| 2345 | 0 |
| 2346 | 0 |
| 2347 | 0 |
| 2348 | 0 |
| 2349 | 0 |
| 2350 | 0 |
| 2351 | 0 |
| 2352 | 0 |
| 2353 | 0 |
| 2354 | 0 |
| 2355 | 0 |
| 2356 | 0 |
| 2357 | 0 |
| 2358 | 0 |
| 2359 | 0 |
| 2360 | 0 |
| 2361 | 0 |
| 2362 | 0 |
| 2363 | 0 |
| 2364 | 0 |
| 2365 | 0 |
| 2366 | 0 |
| 2367 | 0 |
| 2368 | 0 |
| 2369 | 0 |
| 2370 | 0 |
| 2371 | 0 |
| 2372 | 0 |
| 2373 | 0 |
| 2374 | 0 |
| 2375 | 0 |
| 2376 | 0 |
| 2377 | 0 |
| 2378 | 0 |
| 2379 | 0 |
| 2380 | 0 |
| 2381 | 0 |
| 2382 | 0 |
| 2383 | 0 |
| 2384 | 0 |
| 2385 | 0 |
| 2386 | 0 |
| 2387 | 0 |
| 2388 | 0 |
| 2389 | 0 |
| 2390 | 0 |
| 2391 | 0 |
| 2392 | 0 |
| 2393 | 0 |
| 2394 | 0 |
| 2395 | 0 |
| 2396 | 0 |
| 2397 | 0 |
| 2398 | 0 |
| 2399 | 0 |
| 2400 | 0 |
| 2401 | 0 |
| 2402 | 0 |
| 2403 | 0 |
| 2404 | 0 |
| 2405 | 0 |
| 2406 | 0 |
| 2407 | 0 |
| 2408 | 0 |
| 2409 | 0 |
| 2410 | 0 |
| 2411 | 0 |
| 2412 | 0 |
| 2413 | 0 |
| 2414 | 0 |
| 2415 | 0 |
| 2416 | 0 |
| 2417 | 0 |
| 2418 | 0 |
| 2419 | 0 |
| 2420 | 0 |
| 2421 | 0 |
| 2422 | 0 |
| 2423 | 0 |
| 2424 | 0 |
| 2425 | 0 |
| 2426 | 0 |
| 2427 | 0 |
| 2428 | 0 |
| 2429 | 0 |
| 2430 | 0 |
| 2431 | 0 |
| 2432 | 0 |
| 2433 | 0 |
| 2434 | 0 |
| 2435 | 0 |
| 2436 | 0 |
| 2437 | 0 |
| 2438 | 0 |
| 2439 | 0 |
| 2440 | 0 |
| 2441 | 0 |
| 2442 | 0 |
| 2443 | 0 |
| 2444 | 0 |
| 2445 | 0 |
| 2446 | 0 |
| 2447 | 0 |
| 2448 | 0 |
| 2449 | 0 |
| 2450 | 0 |
| 2451 | 0 |
| 2452 | 0 |
| 2453 | 0 |
| 2454 | 0 |
| 2455 | 0 |
| 2456 | 0 |
| 2457 | 0 |
| 2458 | 0 |
| 2459 | 0 |
| 2460 | 0 |
| 2461 | 0 |
| 2462 | 0 |
| 2463 | 0 |
| 2464 | 0 |
| 2465 | 0 |
| 2466 | 0 |
| 2467 | 0 |
| 2468 | 0 |
| 2469 | 0 |
| 2470 | 0 |
| 2471 | 0 |
| 2472 | 0 |
| 2473 | 0 |
| 2474 | 0 |
| 2475 | 0 |
| 2476 | 0 |
| 2477 | 0 |
| 2478 | 0 |
| 2479 | 0 |
| 2480 | 0 |
| 2481 | 0 |
| 2482 | 0 |
| 2483 | 0 |
| 2484 | 0 |
| 2485 | 0 |
| 2486 | 0 |
| 2487 | 0 |
| 2488 | 0 |
| 2489 | 0 |
| 2490 | 0 |
| 2491 | 0 |
| 2492 | 0 |
| 2493 | 0 |
| 2494 | 0 |
| 2495 | 0 |
| 2496 | 0 |
| 2497 | 0 |
| 2498 | 0 |
| 2499 | 0 |
| 2500 | 0 |
| 2501 | 0 |
| 2502 | 0 |
| 2503 | 0 |
| 2504 | 0 |
| 2505 | 0 |
| 2506 | 0 |
| 2507 | 0 |
| 2508 | 0 |
| 2509 | 0 |
| 2510 | 0 |
| 2511 | 0 |
| 2512 | 0 |
| 2513 | 0 |
| 2514 | 0 |
| 2515 | 0 |
| 2516 | 0 |
| 2517 | 0 |
| 2518 | 0 |
| 2519 | 0 |
| 2520 | 0 |
| 2521 | 0 |
| 2522 | 0 |
| 2523 | 0 |
| 2524 | 0 |
| 2525 | 0 |
| 2526 | 0 |
| 2527 | 0 |
| 2528 | 0 |
| 2529 | 0 |
| 2530 | 0 |
| 2531 | 0 |
| 2532 | 0 |
| 2533 | 0 |
| 2534 | 0 |
| 2535 | 0 |
| 2536 | 0 |
| 2537 | 0 |
| 2538 | 0 |
| 2539 | 0 |
| 2540 | 0 |
| 2541 | 0 |
| 2542 | 0 |
| 2543 | 0 |
| 2544 | 0 |
| 2545 | 0 |
| 2546 | 0 |
| 2547 | 0 |
| 2548 | 0 |
| 2549 | 0 |
| 2550 | 0 |
| 2551 | 0 |
| 2552 | 0 |
| 2553 | 0 |
| 2554 | 0 |
| 2555 | 0 |
| 2556 | 0 |
| 2557 | 0 |
| 2558 | 0 |
| 2559 | 0 |
| 2560 | 0 |
| 2561 | 0 |
| 2562 | 0 |
| 2563 | 0 |
| 2564 | 0 |
| 2565 | 0 |
| 2566 | 0 |
| 2567 | 0 |
| 2568 | 0 |
| 2569 | 0 |
| 2570 | 0 |
| 2571 | 0 |
| 2572 | 0 |
| 2573 | 0 |
| 2574 | 0 |
| 2575 | 0 |
| 2576 | 0 |
| 2577 | 0 |
| 2578 | 0 |
| 2579 | 0 |
| 2580 | 0 |
| 2581 | 0 |
| 2582 | 0 |
| 2583 | 0 |
| 2584 | 0 |
| 2585 | 0 |
| 2586 | 0 |
| 2587 | 0 |
| 2588 | 0 |
| 2589 | 0 |
| 2590 | 0 |
| 2591 | 0 |
| 2592 | 0 |
| 2593 | 0 |
| 2594 | 0 |
| 2595 | 0 |
| 2596 | 0 |
| 2597 | 0 |
| 2598 | 0 |
| 2599 | 0 |
| 2600 | 0 |
| 2601 | 0 |
| 2602 | 0 |
| 2603 | 0 |
| 2604 | 0 |
| 2605 | 0 |
| 2606 | 0 |
| 2607 | 0 |
| 2608 | 0 |
| 2609 | 0 |
| 2610 | 0 |
| 2611 | 0 |
| 2612 | 0 |
| 2613 | 0 |
| 2614 | 0 |
| 2615 | 0 |
| 2616 | 0 |
| 2617 | 0 |
| 2618 | 0 |
| 2619 | 0 |
| 2620 | 0 |
| 2621 | 0 |
| 2622 | 0 |
| 2623 | 0 |
| 2624 | 0 |
| 2625 | 0 |
| 2626 | 0 |
| 2627 | 0 |
| 2628 | 0 |
| 2629 | 0 |
| 2630 | 0 |
| 2631 | 0 |
| 2632 | 0 |
| 2633 | 0 |
| 2634 | 0 |
| 2635 | 0 |
| 2636 | 0 |
| 2637 | 0 |
| 2638 | 0 |
| 2639 | 0 |
| 2640 | 0 |
| 2641 | 0 |
| 2642 | 0 |
| 2643 | 0 |
| 2644 | 0 |
| 2645 | 0 |
| 2646 | 0 |
| 2647 | 0 |
| 2648 | 0 |
| 2649 | 0 |
| 2650 | 0 |
| 2651 | 0 |
| 2652 | 0 |
| 2653 | 0 |
| 2654 | 0 |
| 2655 | 0 |
| 2656 | 0 |
| 2657 | 0 |
| 2658 | 0 |
| 2659 | 0 |
| 2660 | 0 |
| 2661 | 0 |
| 2662 | 0 |
| 2663 | 0 |
| 2664 | 0 |
| 2665 | 0 |
| 2666 | 0 |
| 2667 | 0 |
| 2668 | 0 |
| 2669 | 0 |
| 2670 | 0 |
| 2671 | 0 |
| 2672 | 0 |
| 2673 | 0 |
| 2674 | 0 |
| 2675 | 0 |
| 2676 | 0 |
| 2677 | 0 |
| 2678 | 0 |
| 2679 | 0 |
| 2680 | 0 |
| 2681 | 0 |
| 2682 | 0 |
| 2683 | 0 |
| 2684 | 0 |
| 2685 | 0 |
| 2686 | 0 |
| 2687 | 0 |
| 2688 | 0 |
| 2689 | 0 |
| 2690 | 0 |
| 2691 | 0 |
| 2692 | 0 |
| 2693 | 0 |
| 2694 | 0 |
| 2695 | 0 |
| 2696 | 0 |
| 2697 | 0 |
| 2698 | 0 |
| 2699 | 0 |
| 2700 | 0 |
| 2701 | 0 |
| 2702 | 0 |
| 2703 | 0 |
| 2704 | 0 |
| 2705 | 0 |
| 2706 | 0 |
| 2707 | 0 |
| 2708 | 0 |
| 2709 | 0 |
| 2710 | 0 |
| 2711 | 0 |
| 2712 | 0 |
| 2713 | 0 |
| 2714 | 0 |
| 2715 | 0 |
| 2716 | 0 |
| 2717 | 0 |
| 2718 | 0 |
| 2719 | 0 |
| 2720 | 0 |
| 2721 | 0 |
| 2722 | 0 |
| 2723 | 0 |
| 2724 | 0 |
| 2725 | 0 |
| 2726 | 0 |
| 2727 | 0 |
| 2728 | 0 |
| 2729 | 0 |
| 2730 | 0 |
| 2731 | 0 |
| 2732 | 0 |
| 2733 | 0 |
| 2734 | 0 |
| 2735 | 0 |
| 2736 | 0 |
| 2737 | 0 |
| 2738 | 0 |
| 2739 | 0 |
| 2740 | 0 |
| 2741 | 0 |
| 2742 | 0 |
| 2743 | 0 |
| 2744 | 0 |
| 2745 | 0 |
| 2746 | 0 |
| 2747 | 0 |
| 2748 | 0 |
| 2749 | 0 |
| 2750 | 0 |
| 2751 | 0 |
| 2752 | 0 |
| 2753 | 0 |
| 2754 | 0 |
| 2755 | 0 |
| 2756 | 0 |
| 2757 | 0 |
| 2758 | 0 |
| 2759 | 0 |
| 2760 | 0 |
| 2761 | 0 |
| 2762 | 0 |
| 2763 | 0 |
| 2764 | 0 |
| 2765 | 0 |
| 2766 | 0 |
| 2767 | 0 |
| 2768 | 0 |
| 2769 | 0 |
| 2770 | 0 |
| 2771 | 0 |
| 2772 | 0 |
| 2773 | 0 |
| 2774 | 0 |
| 2775 | 0 |
| 2776 | 0 |
| 2777 | 0 |
| 2778 | 0 |
| 2779 | 0 |
| 2780 | 0 |
| 2781 | 0 |
| 2782 | 0 |
| 2783 | 0 |
| 2784 | 0 |
| 2785 | 0 |
| 2786 | 0 |
| 2787 | 0 |
| 2788 | 0 |
| 2789 | 0 |
| 2790 | 0 |
| 2791 | 0 |
| 2792 | 0 |
| 2793 | 0 |
| 2794 | 0 |
| 2795 | 0 |
| 2796 | 0 |
| 2797 | 0 |
| 2798 | 0 |
| 2799 | 0 |
| 2800 | 0 |
| 2801 | 0 |
| 2802 | 0 |
| 2803 | 0 |
| 2804 | 0 |
| 2805 | 0 |
| 2806 | 0 |
| 2807 | 0 |
| 2808 | 0 |
| 2809 | 0 |
| 2810 | 0 |
| 2811 | 0 |
| 2812 | 0 |
| 2813 | 0 |
| 2814 | 0 |
| 2815 | 0 |
| 2816 | 0 |
| 2817 | 0 |
| 2818 | 0 |
| 2819 | 0 |
| 2820 | 0 |
| 2821 | 0 |
| 2822 | 0 |
| 2823 | 0 |
| 2824 | 0 |
| 2825 | 0 |
| 2826 | 0 |
| 2827 | 0 |
| 2828 | 0 |
| 2829 | 0 |
| 2830 | 0 |
| 2831 | 0 |
| 2832 | 0 |
| 2833 | 0 |
| 2834 | 0 |
| 2835 | 0 |
| 2836 | 0 |
| 2837 | 0 |
| 2838 | 0 |
| 2839 | 0 |
| 2840 | 0 |
| 2841 | 0 |
| 2842 | 0 |
| 2843 | 0 |
| 2844 | 0 |
| 2845 | 0 |
| 2846 | 0 |
| 2847 | 0 |
| 2848 | 0 |
| 2849 | 0 |
| 2850 | 0 |
| 2851 | 0 |
| 2852 | 0 |
| 2853 | 0 |
| 2854 | 0 |
| 2855 | 0 |
| 2856 | 0 |
| 2857 | 0 |
| 2858 | 0 |
| 2859 | 0 |
| 2860 | 0 |
| 2861 | 0 |
| 2862 | 0 |
| 2863 | 0 |
| 2864 | 0 |
| 2865 | 0 |
| 2866 | 0 |
| 2867 | 0 |
| 2868 | 0 |
| 2869 | 0 |
| 2870 | 0 |
| 2871 | 0 |
| 2872 | 0 |
| 2873 | 0 |
| 2874 | 0 |
| 2875 | 0 |
| 2876 | 0 |
| 2877 | 0 |
| 2878 | 0 |
| 2879 | 0 |
| 2880 | 0 |
| 2881 | 0 |
| 2882 | 0 |
| 2883 | 0 |
| 2884 | 0 |
| 2885 | 0 |
| 2886 | 0 |
| 2887 | 0 |
| 2888 | 0 |
| 2889 | 0 |
| 2890 | 0 |
| 2891 | 0 |
| 2892 | 0 |
| 2893 | 0 |
| 2894 | 0 |
| 2895 | 0 |
| 2896 | 0 |
| 2897 | 0 |
| 2898 | 0 |
| 2899 | 0 |
| 2900 | 0 |
| 2901 | 0 |
| 2902 | 0 |
| 2903 | 0 |
| 2904 | 0 |
| 2905 | 0 |
| 2906 | 0 |
| 2907 | 0 |
| 2908 | 0 |
| 2909 | 0 |
| 2910 | 0 |
| 2911 | 0 |
| 2912 | 0 |
| 2913 | 0 |
| 2914 | 0 |
| 2915 | 0 |
| 2916 | 0 |
| 2917 | 0 |
| 2918 | 0 |
| 2919 | 0 |
| 2920 | 0 |
| 2921 | 0 |
| 2922 | 0 |
| 2923 | 0 |
| 2924 | 0 |
| 2925 | 0 |
| 2926 | 0 |
| 2927 | 0 |
| 2928 | 0 |
| 2929 | 0 |
| 2930 | 0 |
| 2931 | 0 |
| 2932 | 0 |
| 2933 | 0 |
| 2934 | 0 |
| 2935 | 0 |
| 2936 | 0 |
| 2937 | 0 |
| 2938 | 0 |
| 2939 | 0 |
| 2940 | 0 |
| 2941 | 0 |
| 2942 | 0 |
| 2943 | 0 |
| 2944 | 0 |
| 2945 | 0 |
| 2946 | 0 |
| 2947 | 0 |
| 2948 | 0 |
| 2949 | 0 |
| 2950 | 0 |
| 2951 | 0 |
| 2952 | 0 |
| 2953 | 0 |
| 2954 | 0 |
| 2955 | 0 |
| 2956 | 0 |
| 2957 | 0 |
| 2958 | 0 |
| 2959 | 0 |
| 2960 | 0 |
| 2961 | 0 |
| 2962 | 0 |
| 2963 | 0 |
| 2964 | 0 |
| 2965 | 0 |
| 2966 | 0 |
| 2967 | 0 |
| 2968 | 0 |
| 2969 | 0 |
| 2970 | 0 |
| 2971 | 0 |
| 2972 | 0 |
| 2973 | 0 |
| 2974 | 0 |
| 2975 | 0 |
| 2976 | 0 |
| 2977 | 0 |
| 2978 | 0 |
| 2979 | 0 |
| 2980 | 0 |
| 2981 | 0 |
| 2982 | 0 |
| 2983 | 0 |
| 2984 | 0 |
| 2985 | 0 |
| 2986 | 0 |
| 2987 | 0 |
| 2988 | 0 |
| 2989 | 0 |
| 2990 | 0 |
| 2991 | 0 |
| 2992 | 0 |
| 2993 | 0 |
| 2994 | 0 |
| 2995 | 0 |
| 2996 | 0 |
| 2997 | 0 |
| 2998 | 0 |
| 2999 | 0 |
| 3000 | 0 |
| 3001 | 0 |
| 3002 | 0 |
| 3003 | 0 |
| 3004 | 0 |
| 3005 | 0 |
| 3006 | 0 |
| 3007 | 0 |
| 3008 | 0 |
| 3009 | 0 |
| 3010 | 0 |
| 3011 | 0 |
| 3012 | 0 |
| 3013 | 0 |
| 3014 | 0 |
| 3015 | 0 |
| 3016 | 0 |
| 3017 | 0 |
| 3018 | 0 |
| 3019 | 0 |
| 3020 | 0 |
| 3021 | 0 |
| 3022 | 0 |
| 3023 | 0 |
| 3024 | 0 |
| 3025 | 0 |
| 3026 | 0 |
| 3027 | 0 |
| 3028 | 0 |
| 3029 | 0 |
| 3030 | 0 |
| 3031 | 0 |
| 3032 | 0 |
| 3033 | 0 |
| 3034 | 0 |
| 3035 | 0 |
| 3036 | 0 |
| 3037 | 0 |
| 3038 | 0 |
| 3039 | 0 |
| 3040 | 0 |
| 3041 | 0 |
| 3042 | 0 |
| 3043 | 0 |
| 3044 | 0 |
| 3045 | 0 |
| 3046 | 0 |
| 3047 | 0 |
| 3048 | 0 |
| 3049 | 0 |
| 3050 | 0 |
| 3051 | 0 |
| 3052 | 0 |
| 3053 | 0 |
| 3054 | 0 |
| 3055 | 0 |
| 3056 | 0 |
| 3057 | 0 |
| 3058 | 0 |
| 3059 | 0 |
| 3060 | 0 |
| 3061 | 0 |
| 3062 | 0 |
| 3063 | 0 |
| 3064 | 0 |
| 3065 | 0 |
| 3066 | 0 |
| 3067 | 0 |
| 3068 | 0 |
| 3069 | 0 |
| 3070 | 0 |
| 3071 | 0 |
| 3072 | 0 |
| 3073 | 0 |
| 3074 | 0 |
| 3075 | 0 |
| 3076 | 0 |
| 3077 | 0 |
| 3078 | 0 |
| 3079 | 0 |
| 3080 | 0 |
| 3081 | 0 |
| 3082 | 0 |
| 3083 | 0 |
| 3084 | 0 |
| 3085 | 0 |
| 3086 | 0 |
| 3087 | 0 |
| 3088 | 0 |
| 3089 | 0 |
| 3090 | 0 |
| 3091 | 0 |
| 3092 | 0 |
| 3093 | 0 |
| 3094 | 0 |
| 3095 | 0 |
| 3096 | 0 |
| 3097 | 0 |
| 3098 | 0 |
| 3099 | 0 |
| 3100 | 0 |
| 3101 | 0 |
| 3102 | 0 |
| 3103 | 0 |
| 3104 | 0 |
| 3105 | 0 |
| 3106 | 0 |
| 3107 | 0 |
| 3108 | 0 |
| 3109 | 0 |
| 3110 | 0 |
| 3111 | 0 |
| 3112 | 0 |
| 3113 | 0 |
| 3114 | 0 |
| 3115 | 0 |
| 3116 | 0 |
| 3117 | 0 |
| 3118 | 0 |
| 3119 | 0 |
| 3120 | 0 |
| 3121 | 0 |
| 3122 | 0 |
| 3123 | 0 |
| 3124 | 0 |
| 3125 | 0 |
| 3126 | 0 |
| 3127 | 0 |
| 3128 | 0 |
| 3129 | 0 |
| 3130 | 0 |
| 3131 | 0 |
| 3132 | 0 |
| 3133 | 0 |
| 3134 | 0 |
| 3135 | 0 |
| 3136 | 0 |
| 3137 | 0 |
| 3138 | 0 |
| 3139 | 0 |
| 3140 | 0 |
| 3141 | 0 |
| 3142 | 0 |
| 3143 | 0 |
| 3144 | 0 |
| 3145 | 0 |
| 3146 | 0 |
| 3147 | 0 |
| 3148 | 0 |
| 3149 | 0 |
| 3150 | 0 |
| 3151 | 0 |
| 3152 | 0 |
| 3153 | 0 |
| 3154 | 0 |
| 3155 | 0 |
| 3156 | 0 |
| 3157 | 0 |
| 3158 | 0 |
| 3159 | 0 |
| 3160 | 0 |
| 3161 | 0 |
| 3162 | 0 |
| 3163 | 0 |
| 3164 | 0 |
| 3165 | 0 |
| 3166 | 0 |
| 3167 | 0 |
| 3168 | 0 |
| 3169 | 0 |
| 3170 | 0 |
| 3171 | 0 |
| 3172 | 0 |
| 3173 | 0 |
| 3174 | 0 |
| 3175 | 0 |
| 3176 | 0 |
| 3177 | 0 |
| 3178 | 0 |
| 3179 | 0 |
| 3180 | 0 |
| 3181 | 0 |
| 3182 | 0 |
| 3183 | 0 |
| 3184 | 0 |
| 3185 | 0 |
| 3186 | 0 |
| 3187 | 0 |
| 3188 | 0 |
| 3189 | 0 |
| 3190 | 0 |
| 3191 | 0 |
| 3192 | 0 |
| 3193 | 0 |
| 3194 | 0 |
| 3195 | 0 |
| 3196 | 0 |
| 3197 | 0 |
| 3198 | 0 |
| 3199 | 0 |
| 3200 | 0 |
| 3201 | 0 |
| 3202 | 0 |
| 3203 | 0 |
| 3204 | 0 |
| 3205 | 0 |
| 3206 | 0 |
| 3207 | 0 |
| 3208 | 0 |
| 3209 | 0 |
| 3210 | 0 |
| 3211 | 0 |
| 3212 | 0 |
| 3213 | 0 |
| 3214 | 0 |
| 3215 | 0 |
| 3216 | 0 |
| 3217 | 0 |
| 3218 | 0 |
| 3219 | 0 |
| 3220 | 0 |
| 3221 | 0 |
| 3222 | 0 |
| 3223 | 0 |
| 3224 | 0 |
| 3225 | 0 |
| 3226 | 0 |
| 3227 | 0 |
| 3228 | 0 |
| 3229 | 0 |
| 3230 | 0 |
| 3231 | 0 |
| 3232 | 0 |
| 3233 | 0 |
| 3234 | 0 |
| 3235 | 0 |
| 3236 | 0 |
| 3237 | 0 |
| 3238 | 0 |
| 3239 | 0 |
| 3240 | 0 |
| 3241 | 0 |
| 3242 | 0 |
| 3243 | 0 |
| 3244 | 0 |
| 3245 | 0 |
| 3246 | 0 |
| 3247 | 0 |
| 3248 | 0 |
| 3249 | 0 |
| 3250 | 0 |
| 3251 | 0 |
| 3252 | 0 |
| 3253 | 0 |
| 3254 | 0 |
| 3255 | 0 |
| 3256 | 0 |
| 3257 | 0 |
| 3258 | 0 |
| 3259 | 0 |
| 3260 | 0 |
| 3261 | 0 |
| 3262 | 0 |
| 3263 | 0 |
| 3264 | 0 |
| 3265 | 0 |
| 3266 | 0 |
| 3267 | 0 |
| 3268 | 0 |
| 3269 | 0 |
| 3270 | 0 |
| 3271 | 0 |
| 3272 | 0 |
| 3273 | 0 |
| 3274 | 0 |
| 3275 | 0 |
| 3276 | 0 |
| 3277 | 0 |
| 3278 | 0 |
| 3279 | 0 |
| 3280 | 0 |
| 3281 | 0 |
| 3282 | 0 |
| 3283 | 0 |
| 3284 | 0 |
| 3285 | 0 |
| 3286 | 0 |
| 3287 | 0 |
| 3288 | 0 |
| 3289 | 0 |
| 3290 | 0 |
| 3291 | 0 |
| 3292 | 0 |
| 3293 | 0 |
| 3294 | 0 |
| 3295 | 0 |
| 3296 | 0 |
| 3297 | 0 |
| 3298 | 0 |
| 3299 | 0 |
| 3300 | 0 |
| 3301 | 0 |
| 3302 | 0 |
| 3303 | 0 |
| 3304 | 0 |
| 3305 | 0 |
| 3306 | 0 |
| 3307 | 0 |
| 3308 | 0 |
| 3309 | 0 |
| 3310 | 0 |
| 3311 | 0 |
| 3312 | 0 |
| 3313 | 0 |
| 3314 | 0 |
| 3315 | 0 |
| 3316 | 0 |
| 3317 | 0 |
| 3318 | 0 |
| 3319 | 0 |
| 3320 | 0 |
| 3321 | 0 |
| 3322 | 0 |
| 3323 | 0 |
| 3324 | 0 |
| 3325 | 0 |
| 3326 | 0 |
| 3327 | 0 |
| 3328 | 0 |
| 3329 | 0 |
| 3330 | 0 |
| 3331 | 0 |
| 3332 | 0 |
| 3333 | 0 |
| 3334 | 0 |
| 3335 | 0 |
| 3336 | 0 |
| 3337 | 0 |
| 3338 | 0 |
| 3339 | 0 |
| 3340 | 0 |
| 3341 | 0 |
| 3342 | 0 |
| 3343 | 0 |
| 3344 | 0 |
| 3345 | 0 |
| 3346 | 0 |
| 3347 | 0 |
| 3348 | 0 |
| 3349 | 0 |
| 3350 | 0 |
| 3351 | 0 |
| 3352 | 0 |
| 3353 | 0 |
| 3354 | 0 |
| 3355 | 0 |
| 3356 | 0 |
| 3357 | 0 |
| 3358 | 0 |
| 3359 | 0 |
| 3360 | 0 |
| 3361 | 0 |
| 3362 | 0 |
| 3363 | 0 |
| 3364 | 0 |
| 3365 | 0 |
| 3366 | 0 |
| 3367 | 0 |
| 3368 | 0 |
| 3369 | 0 |
| 3370 | 0 |
| 3371 | 0 |
| 3372 | 0 |
| 3373 | 0 |
| 3374 | 0 |
| 3375 | 0 |
| 3376 | 0 |
| 3377 | 0 |
| 3378 | 0 |
| 3379 | 0 |
| 3380 | 0 |
| 3381 | 0 |
| 3382 | 0 |
| 3383 | 0 |
| 3384 | 0 |
| 3385 | 0 |
| 3386 | 0 |
| 3387 | 0 |
| 3388 | 0 |
| 3389 | 0 |
| 3390 | 0 |
| 3391 | 0 |
| 3392 | 0 |
| 3393 | 0 |
| 3394 | 0 |
| 3395 | 0 |
| 3396 | 0 |
| 3397 | 0 |
| 3398 | 0 |
| 3399 | 0 |
| 3400 | 0 |
| 3401 | 0 |
| 3402 | 0 |
| 3403 | 0 |
| 3404 | 0 |
| 3405 | 0 |
| 3406 | 0 |
| 3407 | 0 |
| 3408 | 0 |
| 3409 | 0 |
| 3410 | 0 |
| 3411 | 0 |
| 3412 | 0 |
| 3413 | 0 |
| 3414 | 0 |
| 3415 | 0 |
| 3416 | 0 |
| 3417 | 0 |
| 3418 | 0 |
| 3419 | 0 |
| 3420 | 0 |
| 3421 | 0 |
| 3422 | 0 |
| 3423 | 0 |
| 3424 | 0 |
| 3425 | 0 |
| 3426 | 0 |
| 3427 | 0 |
| 3428 | 0 |
| 3429 | 0 |
| 3430 | 0 |
| 3431 | 0 |
| 3432 | 0 |
| 3433 | 0 |
| 3434 | 0 |
| 3435 | 0 |
| 3436 | 0 |
| 3437 | 0 |
| 3438 | 0 |
| 3439 | 0 |
| 3440 | 0 |
| 3441 | 0 |
| 3442 | 0 |
| 3443 | 0 |
| 3444 | 0 |
| 3445 | 0 |
| 3446 | 0 |
| 3447 | 0 |
| 3448 | 0 |
| 3449 | 0 |
| 3450 | 0 |
| 3451 | 0 |
| 3452 | 0 |
| 3453 | 0 |
| 3454 | 0 |
| 3455 | 0 |
| 3456 | 0 |
| 3457 | 0 |
| 3458 | 0 |
| 3459 | 0 |
| 3460 | 0 |
| 3461 | 0 |
| 3462 | 0 |
| 3463 | 0 |
| 3464 | 0 |
| 3465 | 0 |
| 3466 | 0 |
| 3467 | 0 |
| 3468 | 0 |
| 3469 | 0 |
| 3470 | 0 |
| 3471 | 0 |
| 3472 | 0 |
| 3473 | 0 |
| 3474 | 0 |
| 3475 | 0 |
| 3476 | 0 |
| 3477 | 0 |
| 3478 | 0 |
| 3479 | 0 |
| 3480 | 0 |
| 3481 | 0 |
| 3482 | 0 |
| 3483 | 0 |
| 3484 | 0 |
| 3485 | 0 |
| 3486 | 0 |
| 3487 | 0 |
| 3488 | 0 |
| 3489 | 0 |
| 3490 | 0 |
| 3491 | 0 |
| 3492 | 0 |
| 3493 | 0 |
| 3494 | 0 |
| 3495 | 0 |
| 3496 | 0 |
| 3497 | 0 |
| 3498 | 0 |
| 3499 | 0 |
| 3500 | 0 |
| 3501 | 0 |
| 3502 | 0 |
| 3503 | 0 |
| 3504 | 0 |
| 3505 | 0 |
| 3506 | 0 |
| 3507 | 0 |
| 3508 | 0 |
| 3509 | 0 |
| 3510 | 0 |
| 3511 | 0 |
| 3512 | 0 |
| 3513 | 0 |
| 3514 | 0 |
| 3515 | 0 |
| 3516 | 0 |
| 3517 | 0 |
| 3518 | 0 |
| 3519 | 0 |
| 3520 | 0 |
| 3521 | 0 |
| 3522 | 0 |
| 3523 | 0 |
| 3524 | 0 |
| 3525 | 0 |
| 3526 | 0 |
| 3527 | 0 |
| 3528 | 0 |
| 3529 | 0 |
| 3530 | 0 |
| 3531 | 0 |
| 3532 | 0 |
| 3533 | 0 |
| 3534 | 0 |
| 3535 | 0 |
| 3536 | 0 |
| 3537 | 0 |
| 3538 | 0 |
| 3539 | 0 |
| 3540 | 0 |
| 3541 | 0 |
| 3542 | 0 |
| 3543 | 0 |
| 3544 | 0 |
| 3545 | 0 |
| 3546 | 0 |
| 3547 | 0 |
| 3548 | 0 |
| 3549 | 0 |
| 3550 | 0 |
| 3551 | 0 |
| 3552 | 0 |
| 3553 | 0 |
| 3554 | 0 |
| 3555 | 0 |
| 3556 | 0 |
| 3557 | 0 |
| 3558 | 0 |
| 3559 | 0 |
| 3560 | 0 |
| 3561 | 0 |
| 3562 | 0 |
| 3563 | 0 |
| 3564 | 0 |
| 3565 | 0 |
| 3566 | 0 |
| 3567 | 0 |
| 3568 | 0 |
| 3569 | 0 |
| 3570 | 0 |
| 3571 | 0 |
| 3572 | 0 |
| 3573 | 0 |
| 3574 | 0 |
| 3575 | 0 |
| 3576 | 0 |
| 3577 | 0 |
| 3578 | 0 |
| 3579 | 0 |
| 3580 | 0 |
| 3581 | 0 |
| 3582 | 0 |
| 3583 | 0 |
| 3584 | 0 |
| 3585 | 0 |
| 3586 | 0 |
| 3587 | 0 |
| 3588 | 0 |
| 3589 | 0 |
| 3590 | 0 |
| 3591 | 0 |
| 3592 | 0 |
| 3593 | 0 |
| 3594 | 0 |
| 3595 | 0 |
| 3596 | 0 |
| 3597 | 0 |
| 3598 | 0 |
| 3599 | 0 |
| 3600 | 0 |
| 3601 | 0 |
| 3602 | 0 |
| 3603 | 0 |
| 3604 | 0 |
| 3605 | 0 |
| 3606 | 0 |
| 3607 | 0 |
| 3608 | 0 |
| 3609 | 0 |
| 3610 | 0 |
| 3611 | 0 |
| 3612 | 0 |
| 3613 | 0 |
| 3614 | 0 |
| 3615 | 0 |
| 3616 | 0 |
| 3617 | 0 |
| 3618 | 0 |
| 3619 | 0 |
| 3620 | 0 |
| 3621 | 0 |
| 3622 | 0 |
| 3623 | 0 |
| 3624 | 0 |
| 3625 | 0 |
| 3626 | 0 |
| 3627 | 0 |
| 3628 | 0 |
| 3629 | 0 |
| 3630 | 0 |
| 3631 | 0 |
| 3632 | 0 |
| 3633 | 0 |
| 3634 | 0 |
| 3635 | 0 |
| 3636 | 0 |
| 3637 | 0 |
| 3638 | 0 |
| 3639 | 0 |
| 3640 | 0 |
| 3641 | 0 |
| 3642 | 0 |
| 3643 | 0 |
| 3644 | 0 |
| 3645 | 0 |
| 3646 | 0 |
| 3647 | 0 |
| 3648 | 0 |
| 3649 | 0 |
| 3650 | 0 |
| 3651 | 0 |
| 3652 | 0 |
| 3653 | 0 |
| 3654 | 0 |
| 3655 | 0 |
| 3656 | 0 |
| 3657 | 0 |
| 3658 | 0 |
| 3659 | 0 |
| 3660 | 0 |
| 3661 | 0 |
| 3662 | 0 |
| 3663 | 0 |
| 3664 | 0 |
| 3665 | 0 |
| 3666 | 0 |
| 3667 | 0 |
| 3668 | 0 |
| 3669 | 0 |
| 3670 | 0 |
| 3671 | 0 |
| 3672 | 0 |
| 3673 | 0 |
| 3674 | 0 |
| 3675 | 0 |
| 3676 | 0 |
| 3677 | 0 |
| 3678 | 0 |
| 3679 | 0 |
| 3680 | 0 |
| 3681 | 0 |
| 3682 | 0 |
| 3683 | 0 |
| 3684 | 0 |
| 3685 | 0 |
| 3686 | 0 |
| 3687 | 0 |
| 3688 | 0 |
| 3689 | 0 |
| 3690 | 0 |
| 3691 | 0 |
| 3692 | 0 |
| 3693 | 0 |
| 3694 | 0 |
| 3695 | 0 |
| 3696 | 0 |
| 3697 | 0 |
| 3698 | 0 |
| 3699 | 0 |
| 3700 | 0 |
| 3701 | 0 |
| 3702 | 0 |
| 3703 | 0 |
| 3704 | 0 |
| 3705 | 0 |
| 3706 | 0 |
| 3707 | 0 |
| 3708 | 0 |
| 3709 | 0 |
| 3710 | 0 |
| 3711 | 0 |
| 3712 | 0 |
| 3713 | 0 |
| 3714 | 0 |
| 3715 | 0 |
| 3716 | 0 |
| 3717 | 0 |
| 3718 | 0 |
| 3719 | 0 |
| 3720 | 0 |
| 3721 | 0 |
| 3722 | 0 |
| 3723 | 0 |
| 3724 | 0 |
| 3725 | 0 |
| 3726 | 0 |
| 3727 | 0 |
| 3728 | 0 |
| 3729 | 0 |
| 3730 | 0 |
| 3731 | 0 |
| 3732 | 0 |
| 3733 | 0 |
| 3734 | 0 |
| 3735 | 0 |
| 3736 | 0 |
| 3737 | 0 |
| 3738 | 0 |
| 3739 | 0 |
| 3740 | 0 |
| 3741 | 0 |
| 3742 | 0 |
| 3743 | 0 |
| 3744 | 0 |
| 3745 | 0 |
| 3746 | 0 |
| 3747 | 0 |
| 3748 | 0 |
| 3749 | 0 |
| 3750 | 0 |
| 3751 | 0 |
| 3752 | 0 |
| 3753 | 0 |
| 3754 | 0 |
| 3755 | 0 |
| 3756 | 0 |
| 3757 | 0 |
| 3758 | 0 |
| 3759 | 0 |
| 3760 | 0 |
| 3761 | 0 |
| 3762 | 0 |
| 3763 | 0 |
| 3764 | 0 |
| 3765 | 0 |
| 3766 | 0 |
| 3767 | 0 |
| 3768 | 0 |
| 3769 | 0 |
| 3770 | 0 |
| 3771 | 0 |
| 3772 | 0 |
| 3773 | 0 |
| 3774 | 0 |
| 3775 | 0 |
| 3776 | 0 |
| 3777 | 0 |
| 3778 | 0 |
| 3779 | 0 |
| 3780 | 0 |
| 3781 | 0 |
| 3782 | 0 |
| 3783 | 0 |
| 3784 | 0 |
| 3785 | 0 |
| 3786 | 0 |
| 3787 | 0 |
| 3788 | 0 |
| 3789 | 0 |
| 3790 | 0 |
| 3791 | 0 |
| 3792 | 0 |
| 3793 | 0 |
| 3794 | 0 |
| 3795 | 0 |
| 3796 | 0 |
| 3797 | 0 |
| 3798 | 0 |
| 3799 | 0 |
| 3800 | 0 |
| 3801 | 0 |
| 3802 | 0 |
| 3803 | 0 |
| 3804 | 0 |
| 3805 | 0 |
| 3806 | 0 |
| 3807 | 0 |
| 3808 | 0 |
| 3809 | 0 |
| 3810 | 0 |
| 3811 | 0 |
| 3812 | 0 |
| 3813 | 0 |
| 3814 | 0 |
| 3815 | 0 |
| 3816 | 0 |
| 3817 | 0 |
| 3818 | 0 |
| 3819 | 0 |
| 3820 | 0 |
| 3821 | 0 |
| 3822 | 0 |
| 3823 | 0 |
| 3824 | 0 |
| 3825 | 0 |
| 3826 | 0 |
| 3827 | 0 |
| 3828 | 0 |
| 3829 | 0 |
| 3830 | 0 |
| 3831 | 0 |
| 3832 | 0 |
| 3833 | 0 |
| 3834 | 0 |
| 3835 | 0 |
| 3836 | 0 |
| 3837 | 0 |
| 3838 | 0 |
| 3839 | 0 |
| 3840 | 0 |
| 3841 | 0 |
| 3842 | 0 |
| 3843 | 0 |
| 3844 | 0 |
| 3845 | 0 |
| 3846 | 0 |
| 3847 | 0 |
| 3848 | 0 |
| 3849 | 0 |
| 3850 | 0 |
| 3851 | 0 |
| 3852 | 0 |
| 3853 | 0 |
| 3854 | 0 |
| 3855 | 0 |
| 3856 | 0 |
| 3857 | 0 |
| 3858 | 0 |
| 3859 | 0 |
| 3860 | 0 |
| 3861 | 0 |
| 3862 | 0 |
| 3863 | 0 |
| 3864 | 0 |
| 3865 | 0 |
| 3866 | 0 |
| 3867 | 0 |
| 3868 | 0 |
| 3869 | 0 |
| 3870 | 0 |
| 3871 | 0 |
| 3872 | 0 |
| 3873 | 0 |
| 3874 | 0 |
| 3875 | 0 |
| 3876 | 0 |
| 3877 | 0 |
| 3878 | 0 |
| 3879 | 0 |
| 3880 | 0 |
| 3881 | 0 |
| 3882 | 0 |
| 3883 | 0 |
| 3884 | 0 |
| 3885 | 0 |
| 3886 | 0 |
| 3887 | 0 |
| 3888 | 0 |
| 3889 | 0 |
| 3890 | 0 |
| 3891 | 0 |
| 3892 | 0 |
| 3893 | 0 |
| 3894 | 0 |
| 3895 | 0 |
| 3896 | 0 |
| 3897 | 0 |
| 3898 | 0 |
| 3899 | 0 |
| 3900 | 0 |
| 3901 | 0 |
| 3902 | 0 |
| 3903 | 0 |
| 3904 | 0 |
| 3905 | 0 |
| 3906 | 0 |
| 3907 | 0 |
| 3908 | 0 |
| 3909 | 0 |
| 3910 | 0 |
| 3911 | 0 |
| 3912 | 0 |
| 3913 | 0 |
| 3914 | 0 |
| 3915 | 0 |
| 3916 | 0 |
| 3917 | 0 |
| 3918 | 0 |
| 3919 | 0 |
| 3920 | 0 |
| 3921 | 0 |
| 3922 | 0 |
| 3923 | 0 |
| 3924 | 0 |
| 3925 | 0 |
| 3926 | 0 |
| 3927 | 0 |
| 3928 | 0 |
| 3929 | 0 |
| 3930 | 0 |
| 3931 | 0 |
| 3932 | 0 |
| 3933 | 0 |
| 3934 | 0 |
| 3935 | 0 |
| 3936 | 0 |
| 3937 | 0 |
| 3938 | 0 |
| 3939 | 0 |
| 3940 | 0 |
| 3941 | 0 |
| 3942 | 0 |
| 3943 | 0 |
| 3944 | 0 |
| 3945 | 0 |
| 3946 | 0 |
| 3947 | 0 |
| 3948 | 0 |
| 3949 | 0 |
| 3950 | 0 |
| 3951 | 0 |
| 3952 | 0 |
| 3953 | 0 |
| 3954 | 0 |
| 3955 | 0 |
| 3956 | 0 |
| 3957 | 0 |
| 3958 | 0 |
| 3959 | 0 |
| 3960 | 0 |
| 3961 | 0 |
| 3962 | 0 |
| 3963 | 0 |
| 3964 | 0 |
| 3965 | 0 |
| 3966 | 0 |
| 3967 | 0 |
| 3968 | 0 |
| 3969 | 0 |
| 3970 | 0 |
| 3971 | 0 |
| 3972 | 0 |
| 3973 | 0 |
| 3974 | 0 |
| 3975 | 0 |
| 3976 | 0 |
| 3977 | 0 |
| 3978 | 0 |
| 3979 | 0 |
| 3980 | 0 |
| 3981 | 0 |
| 3982 | 0 |
| 3983 | 0 |
| 3984 | 0 |
| 3985 | 0 |
| 3986 | 0 |
| 3987 | 0 |
| 3988 | 0 |
| 3989 | 0 |
| 3990 | 0 |
| 3991 | 0 |
| 3992 | 0 |
| 3993 | 0 |
| 3994 | 0 |
| 3995 | 0 |
| 3996 | 0 |
| 3997 | 0 |
| 3998 | 0 |
| 3999 | 0 |
| 4000 | 0 |
| 4001 | 0 |
| 4002 | 0 |
| 4003 | 0 |
| 4004 | 0 |
| 4005 | 0 |
| 4006 | 0 |
| 4007 | 0 |
| 4008 | 0 |
| 4009 | 0 |
| 4010 | 0 |
| 4011 | 0 |
| 4012 | 0 |
| 4013 | 0 |
| 4014 | 0 |
| 4015 | 0 |
| 4016 | 0 |
| 4017 | 0 |
| 4018 | 0 |
| 4019 | 0 |
| 4020 | 0 |
| 4021 | 0 |
| 4022 | 0 |
| 4023 | 0 |
| 4024 | 0 |
| 4025 | 0 |
| 4026 | 0 |
| 4027 | 0 |
| 4028 | 0 |
| 4029 | 0 |
| 4030 | 0 |
| 4031 | 0 |
| 4032 | 0 |
| 4033 | 0 |
| 4034 | 0 |
| 4035 | 0 |
| 4036 | 0 |
| 4037 | 0 |
| 4038 | 0 |
| 4039 | 0 |
| 4040 | 0 |
| 4041 | 0 |
| 4042 | 0 |
| 4043 | 0 |
| 4044 | 0 |
| 4045 | 0 |
| 4046 | 0 |
| 4047 | 0 |
| 4048 | 0 |
| 4049 | 0 |
| 4050 | 0 |
| 4051 | 0 |
| 4052 | 0 |
| 4053 | 0 |
| 4054 | 0 |
| 4055 | 0 |
| 4056 | 0 |
| 4057 | 0 |
| 4058 | 0 |
| 4059 | 0 |
| 4060 | 0 |
| 4061 | 0 |
| 4062 | 0 |
| 4063 | 0 |
| 4064 | 0 |
| 4065 | 0 |
| 4066 | 0 |
| 4067 | 0 |
| 4068 | 0 |
| 4069 | 0 |
| 4070 | 0 |
| 4071 | 0 |
| 4072 | 0 |
| 4073 | 0 |
| 4074 | 0 |
| 4075 | 0 |
| 4076 | 0 |
| 4077 | 0 |
| 4078 | 0 |
| 4079 | 0 |
| 4080 | 0 |
| 4081 | 0 |
| 4082 | 0 |
| 4083 | 0 |
| 4084 | 0 |
| 4085 | 0 |
| 4086 | 0 |
| 4087 | 0 |
| 4088 | 0 |
| 4089 | 0 |
| 4090 | 0 |
| 4091 | 0 |
| 4092 | 0 |
| 4093 | 0 |
| 4094 | 0 |
| 4095 | 0 |
| 4096 | 0 |
| 4097 | 0 |
| 4098 | 0 |
| 4099 | 0 |
| 4100 | 0 |
| 4101 | 0 |
| 4102 | 0 |
| 4103 | 0 |
| 4104 | 0 |
| 4105 | 0 |
| 4106 | 0 |
| 4107 | 0 |
| 4108 | 0 |
| 4109 | 0 |
| 4110 | 0 |
| 4111 | 0 |
| 4112 | 0 |
| 4113 | 0 |
| 4114 | 0 |
| 4115 | 0 |
| 4116 | 0 |
| 4117 | 0 |
| 4118 | 0 |
| 4119 | 0 |
| 4120 | 0 |
| 4121 | 0 |
| 4122 | 0 |
| 4123 | 0 |
| 4124 | 0 |
| 4125 | 0 |
| 4126 | 0 |
| 4127 | 0 |
| 4128 | 0 |
| 4129 | 0 |
| 4130 | 0 |
| 4131 | 0 |
| 4132 | 0 |
| 4133 | 0 |
| 4134 | 0 |
| 4135 | 0 |
| 4136 | 0 |
| 4137 | 0 |
| 4138 | 0 |
| 4139 | 0 |
| 4140 | 0 |
| 4141 | 0 |
| 4142 | 0 |
| 4143 | 0 |
| 4144 | 0 |
| 4145 | 0 |
| 4146 | 0 |
| 4147 | 0 |
| 4148 | 0 |
| 4149 | 0 |
| 4150 | 0 |
| 4151 | 0 |
| 4152 | 0 |
| 4153 | 0 |
| 4154 | 0 |
| 4155 | 0 |
| 4156 | 0 |
| 4157 | 0 |
| 4158 | 0 |
| 4159 | 0 |
| 4160 | 0 |
| 4161 | 0 |
| 4162 | 0 |
| 4163 | 0 |
| 4164 | 0 |
| 4165 | 0 |
| 4166 | 0 |
| 4167 | 0 |
| 4168 | 0 |
| 4169 | 0 |
| 4170 | 0 |
| 4171 | 0 |
| 4172 | 0 |
| 4173 | 0 |
| 4174 | 0 |
| 4175 | 0 |
| 4176 | 0 |
| 4177 | 0 |
| 4178 | 0 |
| 4179 | 0 |
| 4180 | 0 |
| 4181 | 0 |
| 4182 | 0 |
| 4183 | 0 |
| 4184 | 0 |
| 4185 | 0 |
| 4186 | 0 |
| 4187 | 0 |
| 4188 | 0 |
| 4189 | 0 |
| 4190 | 0 |
| 4191 | 0 |
| 4192 | 0 |
| 4193 | 0 |
| 4194 | 0 |
| 4195 | 0 |
| 4196 | 0 |
| 4197 | 0 |
| 4198 | 0 |
| 4199 | 0 |
| 4200 | 0 |
| 4201 | 0 |
| 4202 | 0 |
| 4203 | 0 |
| 4204 | 0 |
| 4205 | 0 |
| 4206 | 0 |
| 4207 | 0 |
| 4208 | 0 |
| 4209 | 0 |
| 4210 | 0 |
| 4211 | 0 |
| 4212 | 0 |
| 4213 | 0 |
| 4214 | 0 |
| 4215 | 0 |
| 4216 | 0 |
| 4217 | 0 |
| 4218 | 0 |
| 4219 | 0 |
| 4220 | 0 |
| 4221 | 0 |
| 4222 | 0 |
| 4223 | 0 |
| 4224 | 0 |
| 4225 | 0 |
| 4226 | 0 |
| 4227 | 0 |
| 4228 | 0 |
| 4229 | 0 |
| 4230 | 0 |
| 4231 | 0 |
| 4232 | 0 |
| 4233 | 0 |
| 4234 | 0 |
| 4235 | 0 |
| 4236 | 0 |
| 4237 | 0 |
| 4238 | 0 |
| 4239 | 0 |
| 4240 | 0 |
| 4241 | 0 |
| 4242 | 0 |
| 4243 | 0 |
| 4244 | 0 |
| 4245 | 0 |
| 4246 | 0 |
| 4247 | 0 |
| 4248 | 0 |
| 4249 | 0 |
| 4250 | 0 |
| 4251 | 0 |
| 4252 | 0 |
| 4253 | 0 |
| 4254 | 0 |
| 4255 | 0 |
| 4256 | 0 |
| 4257 | 0 |
| 4258 | 0 |
| 4259 | 0 |
| 4260 | 0 |
| 4261 | 0 |
| 4262 | 0 |
| 4263 | 0 |
| 4264 | 0 |
| 4265 | 0 |
| 4266 | 0 |
| 4267 | 0 |
| 4268 | 0 |
| 4269 | 0 |
| 4270 | 0 |
| 4271 | 0 |
| 4272 | 0 |
| 4273 | 0 |
| 4274 | 0 |
| 4275 | 0 |
| 4276 | 0 |
| 4277 | 0 |
| 4278 | 0 |
| 4279 | 0 |
| 4280 | 0 |
| 4281 | 0 |
| 4282 | 0 |
| 4283 | 0 |
| 4284 | 0 |
| 4285 | 0 |
| 4286 | 0 |
| 4287 | 0 |
| 4288 | 0 |
| 4289 | 0 |
| 4290 | 0 |
| 4291 | 0 |
| 4292 | 0 |
| 4293 | 0 |
| 4294 | 0 |
| 4295 | 0 |
| 4296 | 0 |
| 4297 | 0 |
| 4298 | 0 |
| 4299 | 0 |
| 4300 | 0 |
| 4301 | 0 |
| 4302 | 0 |
| 4303 | 0 |
| 4304 | 0 |
| 4305 | 0 |
| 4306 | 0 |
| 4307 | 0 |
| 4308 | 0 |
| 4309 | 0 |
| 4310 | 0 |
| 4311 | 0 |
| 4312 | 0 |
| 4313 | 0 |
| 4314 | 0 |
| 4315 | 0 |
| 4316 | 0 |
| 4317 | 0 |
| 4318 | 0 |
| 4319 | 0 |
| 4320 | 0 |
| 4321 | 0 |
| 4322 | 0 |
| 4323 | 0 |
| 4324 | 0 |
| 4325 | 0 |
| 4326 | 0 |
| 4327 | 0 |
| 4328 | 0 |
| 4329 | 0 |
| 4330 | 0 |
| 4331 | 0 |
| 4332 | 0 |
| 4333 | 0 |
| 4334 | 0 |
| 4335 | 0 |
| 4336 | 0 |
| 4337 | 0 |
| 4338 | 0 |
| 4339 | 0 |
| 4340 | 0 |
| 4341 | 0 |
| 4342 | 0 |
| 4343 | 0 |
| 4344 | 0 |
| 4345 | 0 |
| 4346 | 0 |
| 4347 | 0 |
| 4348 | 0 |
| 4349 | 0 |
| 4350 | 0 |
| 4351 | 0 |
| 4352 | 0 |
| 4353 | 0 |
| 4354 | 0 |
| 4355 | 0 |
| 4356 | 0 |
| 4357 | 0 |
| 4358 | 0 |
| 4359 | 0 |
| 4360 | 0 |
| 4361 | 0 |
| 4362 | 0 |
| 4363 | 0 |
| 4364 | 0 |
| 4365 | 0 |
| 4366 | 0 |
| 4367 | 0 |
| 4368 | 0 |
| 4369 | 0 |
| 4370 | 0 |
| 4371 | 0 |
| 4372 | 0 |
| 4373 | 0 |
| 4374 | 0 |
| 4375 | 0 |
| 4376 | 0 |
| 4377 | 0 |
| 4378 | 0 |
| 4379 | 0 |
| 4380 | 0 |
| 4381 | 0 |
| 4382 | 0 |
| 4383 | 0 |
| 4384 | 0 |
| 4385 | 0 |
| 4386 | 0 |
| 4387 | 0 |
| 4388 | 0 |
| 4389 | 0 |
| 4390 | 0 |
| 4391 | 0 |
| 4392 | 0 |
| 4393 | 0 |
| 4394 | 0 |
| 4395 | 0 |
| 4396 | 0 |
| 4397 | 0 |
| 4398 | 0 |
| 4399 | 0 |
| 4400 | 0 |
| 4401 | 0 |
| 4402 | 0 |
| 4403 | 0 |
| 4404 | 0 |
| 4405 | 0 |
| 4406 | 0 |
| 4407 | 0 |
| 4408 | 0 |
| 4409 | 0 |
| 4410 | 0 |
| 4411 | 0 |
| 4412 | 0 |
| 4413 | 0 |
| 4414 | 0 |
| 4415 | 0 |
| 4416 | 0 |
| 4417 | 0 |
| 4418 | 0 |
| 4419 | 0 |
| 4420 | 0 |
| 4421 | 0 |
| 4422 | 0 |
| 4423 | 0 |
| 4424 | 0 |
| 4425 | 0 |
| 4426 | 0 |
| 4427 | 0 |
| 4428 | 0 |
| 4429 | 0 |
| 4430 | 0 |
| 4431 | 0 |
| 4432 | 0 |
| 4433 | 0 |
| 4434 | 0 |
| 4435 | 0 |
| 4436 | 0 |
| 4437 | 0 |
| 4438 | 0 |
| 4439 | 0 |
| 4440 | 0 |
| 4441 | 0 |
| 4442 | 0 |
| 4443 | 0 |
| 4444 | 0 |
| 4445 | 0 |
| 4446 | 0 |
| 4447 | 0 |
| 4448 | 0 |
| 4449 | 0 |
| 4450 | 0 |
| 4451 | 0 |
| 4452 | 0 |
| 4453 | 0 |
| 4454 | 0 |
| 4455 | 0 |
| 4456 | 0 |
| 4457 | 0 |
| 4458 | 0 |
| 4459 | 0 |
| 4460 | 0 |
| 4461 | 0 |
| 4462 | 0 |
| 4463 | 0 |
| 4464 | 0 |
| 4465 | 0 |
| 4466 | 0 |
| 4467 | 0 |
| 4468 | 0 |
| 4469 | 0 |
| 4470 | 0 |
| 4471 | 0 |
| 4472 | 0 |
| 4473 | 0 |
| 4474 | 0 |
| 4475 | 0 |
| 4476 | 0 |
| 4477 | 0 |
| 4478 | 0 |
| 4479 | 0 |
| 4480 | 0 |
| 4481 | 0 |
| 4482 | 0 |
| 4483 | 0 |
| 4484 | 0 |
| 4485 | 0 |
| 4486 | 0 |
| 4487 | 0 |
| 4488 | 0 |
| 4489 | 0 |
| 4490 | 0 |
| 4491 | 0 |
| 4492 | 0 |
| 4493 | 0 |
| 4494 | 0 |
| 4495 | 0 |
| 4496 | 0 |
| 4497 | 0 |
| 4498 | 0 |
| 4499 | 0 |
| 4500 | 0 |
| 4501 | 0 |
| 4502 | 0 |
| 4503 | 0 |
| 4504 | 0 |
| 4505 | 0 |
| 4506 | 0 |
| 4507 | 0 |
| 4508 | 0 |
| 4509 | 0 |
| 4510 | 0 |
| 4511 | 0 |
| 4512 | 0 |
| 4513 | 0 |
| 4514 | 0 |
| 4515 | 0 |
| 4516 | 0 |
| 4517 | 0 |
| 4518 | 0 |
| 4519 | 0 |
| 4520 | 0 |
| 4521 | 0 |
| 4522 | 0 |
| 4523 | 0 |
| 4524 | 0 |
| 4525 | 0 |
| 4526 | 0 |
| 4527 | 0 |
| 4528 | 0 |
| 4529 | 0 |
| 4530 | 0 |
| 4531 | 0 |
| 4532 | 0 |
| 4533 | 0 |
| 4534 | 0 |
| 4535 | 0 |
| 4536 | 0 |
| 4537 | 0 |
| 4538 | 0 |
| 4539 | 0 |
| 4540 | 0 |
| 4541 | 0 |
| 4542 | 0 |
| 4543 | 0 |
| 4544 | 0 |
| 4545 | 0 |
| 4546 | 0 |
| 4547 | 0 |
| 4548 | 0 |
| 4549 | 0 |
| 4550 | 0 |
| 4551 | 0 |
| 4552 | 0 |
| 4553 | 0 |
| 4554 | 0 |
| 4555 | 0 |
| 4556 | 0 |
| 4557 | 0 |
| 4558 | 0 |
| 4559 | 0 |
| 4560 | 0 |
| 4561 | 0 |
| 4562 | 0 |
| 4563 | 0 |
| 4564 | 0 |
| 4565 | 0 |
| 4566 | 0 |
| 4567 | 0 |
| 4568 | 0 |
| 4569 | 0 |
| 4570 | 0 |
| 4571 | 0 |
| 4572 | 0 |
| 4573 | 0 |
| 4574 | 0 |
| 4575 | 0 |
| 4576 | 0 |
| 4577 | 0 |
| 4578 | 0 |
| 4579 | 0 |
| 4580 | 0 |
| 4581 | 0 |
| 4582 | 0 |
| 4583 | 0 |
| 4584 | 0 |
| 4585 | 0 |
| 4586 | 0 |
| 4587 | 0 |
| 4588 | 0 |
| 4589 | 0 |
| 4590 | 0 |
| 4591 | 0 |
| 4592 | 0 |
| 4593 | 0 |
| 4594 | 0 |
| 4595 | 0 |
| 4596 | 0 |
| 4597 | 0 |
| 4598 | 0 |
| 4599 | 0 |
| 4600 | 0 |
| 4601 | 0 |
| 4602 | 0 |
| 4603 | 0 |
| 4604 | 0 |
| 4605 | 0 |
| 4606 | 0 |
| 4607 | 0 |
| 4608 | 0 |
| 4609 | 0 |
| 4610 | 0 |
| 4611 | 0 |
| 4612 | 0 |
| 4613 | 0 |
| 4614 | 0 |
| 4615 | 0 |
| 4616 | 0 |
| 4617 | 0 |
| 4618 | 0 |
| 4619 | 0 |
| 4620 | 0 |
| 4621 | 0 |
| 4622 | 0 |
| 4623 | 0 |
| 4624 | 0 |
| 4625 | 0 |
| 4626 | 0 |
| 4627 | 0 |
| 4628 | 0 |
| 4629 | 0 |
| 4630 | 0 |
| 4631 | 0 |
| 4632 | 0 |
| 4633 | 0 |
| 4634 | 0 |
| 4635 | 0 |
| 4636 | 0 |
| 4637 | 0 |
| 4638 | 0 |
| 4639 | 0 |
| 4640 | 0 |
| 4641 | 0 |
| 4642 | 0 |
| 4643 | 0 |
| 4644 | 0 |
| 4645 | 0 |
| 4646 | 0 |
| 4647 | 0 |
| 4648 | 0 |
| 4649 | 0 |
| 4650 | 0 |
| 4651 | 0 |
| 4652 | 0 |
| 4653 | 0 |
| 4654 | 0 |
| 4655 | 0 |
| 4656 | 0 |
| 4657 | 0 |
| 4658 | 0 |
| 4659 | 0 |
| 4660 | 0 |
| 4661 | 0 |
| 4662 | 0 |
| 4663 | 0 |
| 4664 | 0 |
| 4665 | 0 |
| 4666 | 0 |
| 4667 | 0 |
| 4668 | 0 |
| 4669 | 0 |
| 4670 | 0 |
| 4671 | 0 |
| 4672 | 0 |
| 4673 | 0 |
| 4674 | 0 |
| 4675 | 0 |
| 4676 | 0 |
| 4677 | 0 |
| 4678 | 0 |
| 4679 | 0 |
| 4680 | 0 |
| 4681 | 0 |
| 4682 | 0 |
| 4683 | 0 |
| 4684 | 0 |
| 4685 | 0 |
| 4686 | 0 |
| 4687 | 0 |
| 4688 | 0 |
| 4689 | 0 |
| 4690 | 0 |
| 4691 | 0 |
| 4692 | 0 |
| 4693 | 0 |
| 4694 | 0 |
| 4695 | 0 |
| 4696 | 0 |
| 4697 | 0 |
| 4698 | 0 |
| 4699 | 0 |
| 4700 | 0 |
| 4701 | 0 |
| 4702 | 0 |
| 4703 | 0 |
| 4704 | 0 |
| 4705 | 0 |
| 4706 | 0 |
| 4707 | 0 |
| 4708 | 0 |
| 4709 | 0 |
| 4710 | 0 |
| 4711 | 0 |
| 4712 | 0 |
| 4713 | 0 |
| 4714 | 0 |
| 4715 | 0 |
| 4716 | 0 |
| 4717 | 0 |
| 4718 | 0 |
| 4719 | 0 |
| 4720 | 0 |
| 4721 | 0 |
| 4722 | 0 |
| 4723 | 0 |
| 4724 | 0 |
| 4725 | 0 |
| 4726 | 0 |
| 4727 | 0 |
| 4728 | 0 |
| 4729 | 0 |
| 4730 | 0 |
| 4731 | 0 |
| 4732 | 0 |
| 4733 | 0 |
| 4734 | 0 |
| 4735 | 0 |
| 4736 | 0 |
| 4737 | 0 |
| 4738 | 0 |
| 4739 | 0 |
| 4740 | 0 |
| 4741 | 0 |
| 4742 | 0 |
| 4743 | 0 |
| 4744 | 0 |
| 4745 | 0 |
| 4746 | 0 |
| 4747 | 0 |
| 4748 | 0 |
| 4749 | 0 |
| 4750 | 0 |
| 4751 | 0 |
| 4752 | 0 |
| 4753 | 0 |
| 4754 | 0 |
| 4755 | 0 |
| 4756 | 0 |
| 4757 | 0 |
| 4758 | 0 |
| 4759 | 0 |
| 4760 | 0 |
| 4761 | 0 |
| 4762 | 0 |
| 4763 | 0 |
| 4764 | 0 |
| 4765 | 0 |
| 4766 | 0 |
| 4767 | 0 |
| 4768 | 0 |
| 4769 | 0 |
| 4770 | 0 |
| 4771 | 0 |
| 4772 | 0 |
| 4773 | 0 |
| 4774 | 0 |
| 4775 | 0 |
| 4776 | 0 |
| 4777 | 0 |
| 4778 | 0 |
| 4779 | 0 |
| 4780 | 0 |
| 4781 | 0 |
| 4782 | 0 |
| 4783 | 0 |
| 4784 | 0 |
| 4785 | 0 |
| 4786 | 0 |
| 4787 | 0 |
| 4788 | 0 |
| 4789 | 0 |
| 4790 | 0 |
| 4791 | 0 |
| 4792 | 0 |
| 4793 | 0 |
| 4794 | 0 |
| 4795 | 0 |
| 4796 | 0 |
| 4797 | 0 |
| 4798 | 0 |
| 4799 | 0 |
| 4800 | 0 |
| 4801 | 0 |
| 4802 | 0 |
| 4803 | 0 |
| 4804 | 0 |
| 4805 | 0 |
| 4806 | 0 |
| 4807 | 0 |
| 4808 | 0 |
| 4809 | 0 |
| 4810 | 0 |
| 4811 | 0 |
| 4812 | 0 |
| 4813 | 0 |
| 4814 | 0 |
| 4815 | 0 |
| 4816 | 0 |
| 4817 | 0 |
| 4818 | 0 |
| 4819 | 0 |
| 4820 | 0 |
| 4821 | 0 |
| 4822 | 0 |
| 4823 | 0 |
| 4824 | 0 |
| 4825 | 0 |
| 4826 | 0 |
| 4827 | 0 |
| 4828 | 0 |
| 4829 | 0 |
| 4830 | 0 |
| 4831 | 0 |
| 4832 | 0 |
| 4833 | 0 |
| 4834 | 0 |
| 4835 | 0 |
| 4836 | 0 |
| 4837 | 0 |
| 4838 | 0 |
| 4839 | 0 |
| 4840 | 0 |
| 4841 | 0 |
| 4842 | 0 |
| 4843 | 0 |
| 4844 | 0 |
| 4845 | 0 |
| 4846 | 0 |
| 4847 | 0 |
| 4848 | 0 |
| 4849 | 0 |
| 4850 | 0 |
| 4851 | 0 |
| 4852 | 0 |
| 4853 | 0 |
| 4854 | 0 |
| 4855 | 0 |
| 4856 | 0 |
| 4857 | 0 |
| 4858 | 0 |
| 4859 | 0 |
| 4860 | 0 |
| 4861 | 0 |
| 4862 | 0 |
| 4863 | 0 |
| 4864 | 0 |
| 4865 | 0 |
| 4866 | 0 |
| 4867 | 0 |
| 4868 | 0 |
| 4869 | 0 |
| 4870 | 0 |
| 4871 | 0 |
| 4872 | 0 |
| 4873 | 0 |
| 4874 | 0 |
| 4875 | 0 |
| 4876 | 0 |
| 4877 | 0 |
| 4878 | 0 |
| 4879 | 0 |
| 4880 | 0 |
| 4881 | 0 |
| 4882 | 0 |
| 4883 | 0 |
| 4884 | 0 |
| 4885 | 0 |
| 4886 | 0 |
| 4887 | 0 |
| 4888 | 0 |
| 4889 | 0 |
| 4890 | 0 |
| 4891 | 0 |
| 4892 | 0 |
| 4893 | 0 |
| 4894 | 0 |
| 4895 | 0 |
| 4896 | 0 |
| 4897 | 0 |
| 4898 | 0 |
| 4899 | 0 |
| 4900 | 0 |
| 4901 | 0 |
| 4902 | 0 |
| 4903 | 0 |
| 4904 | 0 |
| 4905 | 0 |
| 4906 | 0 |
| 4907 | 0 |
| 4908 | 0 |
| 4909 | 0 |
| 4910 | 0 |
| 4911 | 0 |
| 4912 | 0 |
| 4913 | 0 |
| 4914 | 0 |
| 4915 | 0 |
| 4916 | 0 |
| 4917 | 0 |
| 4918 | 0 |
| 4919 | 0 |
| 4920 | 0 |
| 4921 | 0 |
| 4922 | 0 |
| 4923 | 0 |
| 4924 | 0 |
| 4925 | 0 |
| 4926 | 0 |
| 4927 | 0 |
| 4928 | 0 |
| 4929 | 0 |
| 4930 | 0 |
| 4931 | 0 |
| 4932 | 0 |
| 4933 | 0 |
| 4934 | 0 |
| 4935 | 0 |
| 4936 | 0 |
| 4937 | 0 |
| 4938 | 0 |
| 4939 | 0 |
| 4940 | 0 |
| 4941 | 0 |
| 4942 | 0 |
| 4943 | 0 |
| 4944 | 0 |
| 4945 | 0 |
| 4946 | 0 |
| 4947 | 0 |
| 4948 | 0 |
| 4949 | 0 |
| 4950 | 0 |
| 4951 | 0 |
| 4952 | 0 |
| 4953 | 0 |
| 4954 | 0 |
| 4955 | 0 |
| 4956 | 0 |
| 4957 | 0 |
| 4958 | 0 |
| 4959 | 0 |
| 4960 | 0 |
| 4961 | 0 |
| 4962 | 0 |
| 4963 | 0 |
| 4964 | 0 |
| 4965 | 0 |
| 4966 | 0 |
| 4967 | 0 |
| 4968 | 0 |
| 4969 | 0 |
| 4970 | 0 |
| 4971 | 0 |
| 4972 | 0 |
| 4973 | 0 |
| 4974 | 0 |
| 4975 | 0 |
| 4976 | 0 |
| 4977 | 0 |
| 4978 | 0 |
| 4979 | 0 |
| 4980 | 0 |
| 4981 | 0 |
| 4982 | 0 |
| 4983 | 0 |
| 4984 | 0 |
| 4985 | 0 |
| 4986 | 0 |
| 4987 | 0 |
| 4988 | 0 |
| 4989 | 0 |
| 4990 | 0 |
| 4991 | 0 |
| 4992 | 0 |
| 4993 | 0 |
| 4994 | 0 |
| 4995 | 0 |
| 4996 | 0 |
| 4997 | 0 |
| 4998 | 0 |
| 4999 | 0 |
| 5000 | 0 |
| 5001 | 0 |
| 5002 | 0 |
| 5003 | 0 |
| 5004 | 0 |
| 5005 | 0 |
| 5006 | 0 |
| 5007 | 0 |
| 5008 | 0 |
| 5009 | 0 |
| 5010 | 0 |
| 5011 | 0 |
| 5012 | 0 |
| 5013 | 0 |
| 5014 | 0 |
| 5015 | 0 |
| 5016 | 0 |
| 5017 | 0 |
| 5018 | 0 |
| 5019 | 0 |
| 5020 | 0 |
| 5021 | 0 |
| 5022 | 0 |
| 5023 | 0 |
| 5024 | 0 |
| 5025 | 0 |
| 5026 | 0 |
| 5027 | 0 |
| 5028 | 0 |
| 5029 | 0 |
| 5030 | 0 |
| 5031 | 0 |
| 5032 | 0 |
| 5033 | 0 |
| 5034 | 0 |
| 5035 | 0 |
| 5036 | 0 |
| 5037 | 0 |
| 5038 | 0 |
| 5039 | 0 |
| 5040 | 0 |
| 5041 | 0 |
| 5042 | 0 |
| 5043 | 0 |
| 5044 | 0 |
| 5045 | 0 |
| 5046 | 0 |
| 5047 | 0 |
| 5048 | 0 |
| 5049 | 0 |
| 5050 | 0 |
| 5051 | 0 |
| 5052 | 0 |
| 5053 | 0 |
| 5054 | 0 |
| 5055 | 0 |
| 5056 | 0 |
| 5057 | 0 |
| 5058 | 0 |
| 5059 | 0 |
| 5060 | 0 |
| 5061 | 0 |
| 5062 | 0 |
| 5063 | 0 |
| 5064 | 0 |
| 5065 | 0 |
| 5066 | 0 |
| 5067 | 0 |
| 5068 | 0 |
| 5069 | 0 |
| 5070 | 0 |
| 5071 | 0 |
| 5072 | 0 |
| 5073 | 0 |
| 5074 | 0 |
| 5075 | 0 |
| 5076 | 0 |
| 5077 | 0 |
| 5078 | 0 |
| 5079 | 0 |
| 5080 | 0 |
| 5081 | 0 |
| 5082 | 0 |
| 5083 | 0 |
| 5084 | 0 |
| 5085 | 0 |
| 5086 | 0 |
| 5087 | 0 |
| 5088 | 0 |
| 5089 | 0 |
| 5090 | 0 |
| 5091 | 0 |
| 5092 | 0 |
| 5093 | 0 |
| 5094 | 0 |
| 5095 | 0 |
| 5096 | 0 |
| 5097 | 0 |
| 5098 | 0 |
| 5099 | 0 |
| 5100 | 0 |
| 5101 | 0 |
| 5102 | 0 |
| 5103 | 0 |
| 5104 | 0 |
| 5105 | 0 |
| 5106 | 0 |
| 5107 | 0 |
| 5108 | 0 |
| 5109 | 0 |
| 5110 | 0 |
| 5111 | 0 |
| 5112 | 0 |
| 5113 | 0 |
| 5114 | 0 |
| 5115 | 0 |
| 5116 | 0 |
| 5117 | 0 |
| 5118 | 0 |
| 5119 | 0 |
| 5120 | 0 |
| 5121 | 0 |
| 5122 | 0 |
| 5123 | 0 |
| 5124 | 0 |
| 5125 | 0 |
| 5126 | 0 |
| 5127 | 0 |
| 5128 | 0 |
| 5129 | 0 |
| 5130 | 0 |
| 5131 | 0 |
| 5132 | 0 |
| 5133 | 0 |
| 5134 | 0 |
| 5135 | 0 |
| 5136 | 0 |
| 5137 | 0 |
| 5138 | 0 |
| 5139 | 0 |
| 5140 | 0 |
| 5141 | 0 |
| 5142 | 0 |
| 5143 | 0 |
| 5144 | 0 |
| 5145 | 0 |
| 5146 | 0 |
| 5147 | 0 |
| 5148 | 0 |
| 5149 | 0 |
| 5150 | 0 |
| 5151 | 0 |
| 5152 | 0 |
| 5153 | 0 |
| 5154 | 0 |
| 5155 | 0 |
| 5156 | 0 |
| 5157 | 0 |
| 5158 | 0 |
| 5159 | 0 |
| 5160 | 0 |
| 5161 | 0 |
| 5162 | 0 |
| 5163 | 0 |
| 5164 | 0 |
| 5165 | 0 |
| 5166 | 0 |
| 5167 | 0 |
| 5168 | 0 |
| 5169 | 0 |
| 5170 | 0 |
| 5171 | 0 |
| 5172 | 0 |
| 5173 | 0 |
| 5174 | 0 |
| 5175 | 0 |
| 5176 | 0 |
| 5177 | 0 |
| 5178 | 0 |
| 5179 | 0 |
| 5180 | 0 |
| 5181 | 0 |
| 5182 | 0 |
| 5183 | 0 |
| 5184 | 0 |
| 5185 | 0 |
| 5186 | 0 |
| 5187 | 0 |
| 5188 | 0 |
| 5189 | 0 |
| 5190 | 0 |
| 5191 | 0 |
| 5192 | 0 |
| 5193 | 0 |
| 5194 | 0 |
| 5195 | 0 |
| 5196 | 0 |
| 5197 | 0 |
| 5198 | 0 |
| 5199 | 0 |
| 5200 | 0 |
| 5201 | 0 |
| 5202 | 0 |
| 5203 | 0 |
| 5204 | 0 |
| 5205 | 0 |
| 5206 | 0 |
| 5207 | 0 |
| 5208 | 0 |
| 5209 | 0 |
| 5210 | 0 |
| 5211 | 0 |
| 5212 | 0 |
| 5213 | 0 |
| 5214 | 0 |
| 5215 | 0 |
| 5216 | 0 |
| 5217 | 0 |
| 5218 | 0 |
| 5219 | 0 |
| 5220 | 0 |
| 5221 | 0 |
| 5222 | 0 |
| 5223 | 0 |
| 5224 | 0 |
| 5225 | 0 |
| 5226 | 0 |
| 5227 | 0 |
| 5228 | 0 |
| 5229 | 0 |
| 5230 | 0 |
| 5231 | 0 |
| 5232 | 0 |
| 5233 | 0 |
| 5234 | 0 |
| 5235 | 0 |
| 5236 | 0 |
| 5237 | 0 |
| 5238 | 0 |
| 5239 | 0 |
| 5240 | 0 |
| 5241 | 0 |
| 5242 | 0 |
| 5243 | 0 |
| 5244 | 0 |
| 5245 | 0 |
| 5246 | 0 |
| 5247 | 0 |
| 5248 | 0 |
| 5249 | 0 |
| 5250 | 0 |
| 5251 | 0 |
| 5252 | 0 |
| 5253 | 0 |
| 5254 | 0 |
| 5255 | 0 |
| 5256 | 0 |
| 5257 | 0 |
| 5258 | 0 |
| 5259 | 0 |
| 5260 | 0 |
| 5261 | 0 |
| 5262 | 0 |
| 5263 | 0 |
| 5264 | 0 |
| 5265 | 0 |
| 5266 | 0 |
| 5267 | 0 |
| 5268 | 0 |
| 5269 | 0 |
| 5270 | 0 |
| 5271 | 0 |
| 5272 | 0 |
| 5273 | 0 |
| 5274 | 0 |
| 5275 | 0 |
| 5276 | 0 |
| 5277 | 0 |
| 5278 | 0 |
| 5279 | 0 |
| 5280 | 0 |
| 5281 | 0 |
| 5282 | 0 |
| 5283 | 0 |
| 5284 | 0 |
| 5285 | 0 |
| 5286 | 0 |
| 5287 | 0 |
| 5288 | 0 |
| 5289 | 0 |
| 5290 | 0 |
| 5291 | 0 |
| 5292 | 0 |
| 5293 | 0 |
| 5294 | 0 |
| 5295 | 0 |
| 5296 | 0 |
| 5297 | 0 |
| 5298 | 0 |
| 5299 | 0 |
| 5300 | 0 |
| 5301 | 0 |
| 5302 | 0 |
| 5303 | 0 |
| 5304 | 0 |
| 5305 | 0 |
| 5306 | 0 |
| 5307 | 0 |
| 5308 | 0 |
| 5309 | 0 |
| 5310 | 0 |
| 5311 | 0 |
| 5312 | 0 |
| 5313 | 0 |
| 5314 | 0 |
| 5315 | 0 |
| 5316 | 0 |
| 5317 | 0 |
| 5318 | 0 |
| 5319 | 0 |
| 5320 | 0 |
| 5321 | 0 |
| 5322 | 0 |
| 5323 | 0 |
| 5324 | 0 |
| 5325 | 0 |
| 5326 | 0 |
| 5327 | 0 |
| 5328 | 0 |
| 5329 | 0 |
| 5330 | 0 |
| 5331 | 0 |
| 5332 | 0 |
| 5333 | 0 |
| 5334 | 0 |
| 5335 | 0 |
| 5336 | 0 |
| 5337 | 0 |
| 5338 | 0 |
| 5339 | 0 |
| 5340 | 0 |
| 5341 | 0 |
| 5342 | 0 |
| 5343 | 0 |
| 5344 | 0 |
| 5345 | 0 |
| 5346 | 0 |
| 5347 | 0 |
| 5348 | 0 |
| 5349 | 0 |
| 5350 | 0 |
| 5351 | 0 |
| 5352 | 0 |
| 5353 | 0 |
| 5354 | 0 |
| 5355 | 0 |
| 5356 | 0 |
| 5357 | 0 |
| 5358 | 0 |
| 5359 | 0 |
| 5360 | 0 |
| 5361 | 0 |
| 5362 | 0 |
| 5363 | 0 |
| 5364 | 0 |
| 5365 | 0 |
| 5366 | 0 |
| 5367 | 0 |
| 5368 | 0 |
| 5369 | 0 |
| 5370 | 0 |
| 5371 | 0 |
| 5372 | 0 |
| 5373 | 0 |
| 5374 | 0 |
| 5375 | 0 |
| 5376 | 0 |
| 5377 | 0 |
| 5378 | 0 |
| 5379 | 0 |
| 5380 | 0 |
| 5381 | 0 |
| 5382 | 0 |
| 5383 | 0 |
| 5384 | 0 |
| 5385 | 0 |
| 5386 | 0 |
| 5387 | 0 |
| 5388 | 0 |
| 5389 | 0 |
| 5390 | 0 |
| 5391 | 0 |
| 5392 | 0 |
| 5393 | 0 |
| 5394 | 0 |
| 5395 | 0 |
| 5396 | 0 |
| 5397 | 0 |
| 5398 | 0 |
| 5399 | 0 |
| 5400 | 0 |
| 5401 | 0 |
| 5402 | 0 |
| 5403 | 0 |
| 5404 | 0 |
| 5405 | 0 |
| 5406 | 0 |
| 5407 | 0 |
| 5408 | 0 |
| 5409 | 0 |
| 5410 | 0 |
| 5411 | 0 |
| 5412 | 0 |
| 5413 | 0 |
| 5414 | 0 |
| 5415 | 0 |
| 5416 | 0 |
| 5417 | 0 |
| 5418 | 0 |
| 5419 | 0 |
| 5420 | 0 |
| 5421 | 0 |
| 5422 | 0 |
| 5423 | 0 |
| 5424 | 0 |
| 5425 | 0 |
| 5426 | 0 |
| 5427 | 0 |
| 5428 | 0 |
| 5429 | 0 |
| 5430 | 0 |
| 5431 | 0 |
| 5432 | 0 |
| 5433 | 0 |
| 5434 | 0 |
| 5435 | 0 |
| 5436 | 0 |
| 5437 | 0 |
| 5438 | 0 |
| 5439 | 0 |
| 5440 | 0 |
| 5441 | 0 |
| 5442 | 0 |
| 5443 | 0 |
| 5444 | 0 |
| 5445 | 0 |
| 5446 | 0 |
| 5447 | 0 |
| 5448 | 0 |
| 5449 | 0 |
| 5450 | 0 |
| 5451 | 0 |
| 5452 | 0 |
| 5453 | 0 |
| 5454 | 0 |
| 5455 | 0 |
| 5456 | 0 |
| 5457 | 0 |
| 5458 | 0 |
| 5459 | 0 |
| 5460 | 0 |
| 5461 | 0 |
| 5462 | 0 |
| 5463 | 0 |
| 5464 | 0 |
| 5465 | 0 |
| 5466 | 0 |
| 5467 | 0 |
| 5468 | 0 |
| 5469 | 0 |
| 5470 | 0 |
| 5471 | 0 |
| 5472 | 0 |
| 5473 | 0 |
| 5474 | 0 |
| 5475 | 0 |
| 5476 | 0 |
| 5477 | 0 |
| 5478 | 0 |
| 5479 | 0 |
| 5480 | 0 |
| 5481 | 0 |
| 5482 | 0 |
| 5483 | 0 |
| 5484 | 0 |
| 5485 | 0 |
| 5486 | 0 |
| 5487 | 0 |
| 5488 | 0 |
| 5489 | 0 |
| 5490 | 0 |
| 5491 | 0 |
| 5492 | 0 |
| 5493 | 0 |
| 5494 | 0 |
| 5495 | 0 |
| 5496 | 0 |
| 5497 | 0 |
| 5498 | 0 |
| 5499 | 0 |
| 5500 | 0 |
| 5501 | 0 |
| 5502 | 0 |
| 5503 | 0 |
| 5504 | 0 |
| 5505 | 0 |
| 5506 | 0 |
| 5507 | 0 |
| 5508 | 0 |
| 5509 | 0 |
| 5510 | 0 |
| 5511 | 0 |
| 5512 | 0 |
| 5513 | 0 |
| 5514 | 0 |
| 5515 | 0 |
| 5516 | 0 |
| 5517 | 0 |
| 5518 | 0 |
| 5519 | 0 |
| 5520 | 0 |
| 5521 | 0 |
| 5522 | 0 |
| 5523 | 0 |
| 5524 | 0 |
| 5525 | 0 |
| 5526 | 0 |
| 5527 | 0 |
| 5528 | 0 |
| 5529 | 0 |
| 5530 | 0 |
| 5531 | 0 |
| 5532 | 0 |
| 5533 | 0 |
| 5534 | 0 |
| 5535 | 0 |
| 5536 | 0 |
| 5537 | 0 |
| 5538 | 0 |
| 5539 | 0 |
| 5540 | 0 |
| 5541 | 0 |
| 5542 | 0 |
| 5543 | 0 |
| 5544 | 0 |
| 5545 | 0 |
| 5546 | 0 |
| 5547 | 0 |
| 5548 | 0 |
| 5549 | 0 |
| 5550 | 0 |
| 5551 | 0 |
| 5552 | 0 |
| 5553 | 0 |
| 5554 | 0 |
| 5555 | 0 |
| 5556 | 0 |
| 5557 | 0 |
| 5558 | 0 |
| 5559 | 0 |
| 5560 | 0 |
| 5561 | 0 |
| 5562 | 0 |
| 5563 | 0 |
| 5564 | 0 |
| 5565 | 0 |
| 5566 | 0 |
| 5567 | 0 |
| 5568 | 0 |
| 5569 | 0 |
| 5570 | 0 |
| 5571 | 0 |
| 5572 | 0 |
| 5573 | 0 |
| 5574 | 0 |
| 5575 | 0 |
| 5576 | 0 |
| 5577 | 0 |
| 5578 | 0 |
| 5579 | 0 |
| 5580 | 0 |
| 5581 | 0 |
| 5582 | 0 |
| 5583 | 0 |
| 5584 | 0 |
| 5585 | 0 |
| 5586 | 0 |
| 5587 | 0 |
| 5588 | 0 |
| 5589 | 0 |
| 5590 | 0 |
| 5591 | 0 |
| 5592 | 0 |
| 5593 | 0 |
| 5594 | 0 |
| 5595 | 0 |
| 5596 | 0 |
| 5597 | 0 |
| 5598 | 0 |
| 5599 | 0 |
| 5600 | 0 |
| 5601 | 0 |
| 5602 | 0 |
| 5603 | 0 |
| 5604 | 0 |
| 5605 | 0 |
| 5606 | 0 |
| 5607 | 0 |
| 5608 | 0 |
| 5609 | 0 |
| 5610 | 0 |
| 5611 | 0 |
| 5612 | 0 |
| 5613 | 0 |
| 5614 | 0 |
| 5615 | 0 |
| 5616 | 0 |
| 5617 | 0 |
| 5618 | 0 |
| 5619 | 0 |
| 5620 | 0 |
| 5621 | 0 |
| 5622 | 0 |
| 5623 | 0 |
| 5624 | 0 |
| 5625 | 0 |
| 5626 | 0 |
| 5627 | 0 |
| 5628 | 0 |
| 5629 | 0 |
| 5630 | 0 |
| 5631 | 0 |
| 5632 | 0 |
| 5633 | 0 |
| 5634 | 0 |
| 5635 | 0 |
| 5636 | 0 |
| 5637 | 0 |
| 5638 | 0 |
| 5639 | 0 |
| 5640 | 0 |
| 5641 | 0 |
| 5642 | 0 |
| 5643 | 0 |
| 5644 | 0 |
| 5645 | 0 |
| 5646 | 0 |
| 5647 | 0 |
| 5648 | 0 |
| 5649 | 0 |
| 5650 | 0 |
| 5651 | 0 |
| 5652 | 0 |
| 5653 | 0 |
| 5654 | 0 |
| 5655 | 0 |
| 5656 | 0 |
| 5657 | 0 |
| 5658 | 0 |
| 5659 | 0 |
| 5660 | 0 |
| 5661 | 0 |
| 5662 | 0 |
| 5663 | 0 |
| 5664 | 0 |
| 5665 | 0 |
| 5666 | 0 |
| 5667 | 0 |
| 5668 | 0 |
| 5669 | 0 |
| 5670 | 0 |
| 5671 | 0 |
| 5672 | 0 |
| 5673 | 0 |
| 5674 | 0 |
| 5675 | 0 |
| 5676 | 0 |
| 5677 | 0 |
| 5678 | 0 |
| 5679 | 0 |
| 5680 | 0 |
| 5681 | 0 |
| 5682 | 0 |
| 5683 | 0 |
| 5684 | 0 |
| 5685 | 0 |
| 5686 | 0 |
| 5687 | 0 |
| 5688 | 0 |
| 5689 | 0 |
| 5690 | 0 |
| 5691 | 0 |
| 5692 | 0 |
| 5693 | 0 |
| 5694 | 0 |
| 5695 | 0 |
| 5696 | 0 |
| 5697 | 0 |
| 5698 | 0 |
| 5699 | 0 |
| 5700 | 0 |
| 5701 | 0 |
| 5702 | 0 |
| 5703 | 0 |
| 5704 | 0 |
| 5705 | 0 |
| 5706 | 0 |
| 5707 | 0 |
| 5708 | 0 |
| 5709 | 0 |
| 5710 | 0 |
| 5711 | 0 |
| 5712 | 0 |
| 5713 | 0 |
| 5714 | 0 |
| 5715 | 0 |
| 5716 | 0 |
| 5717 | 0 |
| 5718 | 0 |
| 5719 | 0 |
| 5720 | 0 |
| 5721 | 0 |
| 5722 | 0 |
| 5723 | 0 |
| 5724 | 0 |
| 5725 | 0 |
| 5726 | 0 |
| 5727 | 0 |
| 5728 | 0 |
| 5729 | 0 |
| 5730 | 0 |
| 5731 | 0 |
| 5732 | 0 |
| 5733 | 0 |
| 5734 | 0 |
| 5735 | 0 |
| 5736 | 0 |
| 5737 | 0 |
| 5738 | 0 |
| 5739 | 0 |
| 5740 | 0 |
| 5741 | 0 |
| 5742 | 0 |
| 5743 | 0 |
| 5744 | 0 |
| 5745 | 0 |
| 5746 | 0 |
| 5747 | 0 |
| 5748 | 0 |
| 5749 | 0 |
| 5750 | 0 |
| 5751 | 0 |
| 5752 | 0 |
| 5753 | 0 |
| 5754 | 0 |
| 5755 | 0 |
| 5756 | 0 |
| 5757 | 0 |
| 5758 | 0 |
| 5759 | 0 |
| 5760 | 0 |
| 5761 | 0 |
| 5762 | 0 |
| 5763 | 0 |
| 5764 | 0 |
| 5765 | 0 |
| 5766 | 0 |
| 5767 | 0 |
| 5768 | 0 |
| 5769 | 0 |
| 5770 | 0 |
| 5771 | 0 |
| 5772 | 0 |
| 5773 | 0 |
| 5774 | 0 |
| 5775 | 0 |
| 5776 | 0 |
| 5777 | 0 |
| 5778 | 0 |
| 5779 | 0 |
| 5780 | 0 |
| 5781 | 0 |
| 5782 | 0 |
| 5783 | 0 |
| 5784 | 0 |
| 5785 | 0 |
| 5786 | 0 |
| 5787 | 0 |
| 5788 | 0 |
| 5789 | 0 |
| 5790 | 0 |
| 5791 | 0 |
| 5792 | 0 |
| 5793 | 0 |
| 5794 | 0 |
| 5795 | 0 |
| 5796 | 0 |
| 5797 | 0 |
| 5798 | 0 |
| 5799 | 0 |
| 5800 | 0 |
| 5801 | 0 |
| 5802 | 0 |
| 5803 | 0 |
| 5804 | 0 |
| 5805 | 0 |
| 5806 | 0 |
| 5807 | 0 |
| 5808 | 0 |
| 5809 | 0 |
| 5810 | 0 |
| 5811 | 0 |
| 5812 | 0 |
| 5813 | 0 |
| 5814 | 0 |
| 5815 | 0 |
| 5816 | 0 |
| 5817 | 0 |
| 5818 | 0 |
| 5819 | 0 |
| 5820 | 0 |
| 5821 | 0 |
| 5822 | 0 |
| 5823 | 0 |
| 5824 | 0 |
| 5825 | 0 |
| 5826 | 0 |
| 5827 | 0 |
| 5828 | 0 |
| 5829 | 0 |
| 5830 | 0 |
| 5831 | 0 |
| 5832 | 0 |
| 5833 | 0 |
| 5834 | 0 |
| 5835 | 0 |
| 5836 | 0 |
| 5837 | 0 |
| 5838 | 0 |
| 5839 | 0 |
| 5840 | 0 |
| 5841 | 0 |
| 5842 | 0 |
| 5843 | 0 |
| 5844 | 0 |
| 5845 | 0 |
| 5846 | 0 |
| 5847 | 0 |
| 5848 | 0 |
| 5849 | 0 |
| 5850 | 0 |
| 5851 | 0 |
| 5852 | 0 |
| 5853 | 0 |
| 5854 | 0 |
| 5855 | 0 |
| 5856 | 0 |
| 5857 | 0 |
| 5858 | 0 |
| 5859 | 0 |
| 5860 | 0 |
| 5861 | 0 |
| 5862 | 0 |
| 5863 | 0 |
| 5864 | 0 |
| 5865 | 0 |
| 5866 | 0 |
| 5867 | 0 |
| 5868 | 0 |
| 5869 | 0 |
| 5870 | 0 |
| 5871 | 0 |
| 5872 | 0 |
| 5873 | 0 |
| 5874 | 0 |
| 5875 | 0 |
| 5876 | 0 |
| 5877 | 0 |
| 5878 | 0 |
| 5879 | 0 |
| 5880 | 0 |
| 5881 | 0 |
| 5882 | 0 |
| 5883 | 0 |
| 5884 | 0 |
| 5885 | 0 |
| 5886 | 0 |
| 5887 | 0 |
| 5888 | 0 |
| 5889 | 0 |
| 5890 | 0 |
| 5891 | 0 |
| 5892 | 0 |
| 5893 | 0 |
| 5894 | 0 |
| 5895 | 0 |
| 5896 | 0 |
| 5897 | 0 |
| 5898 | 0 |
| 5899 | 0 |
| 5900 | 0 |
| 5901 | 0 |
| 5902 | 0 |
| 5903 | 0 |
| 5904 | 0 |
| 5905 | 0 |
| 5906 | 0 |
| 5907 | 0 |
| 5908 | 0 |
| 5909 | 0 |
| 5910 | 0 |
| 5911 | 0 |
| 5912 | 0 |
| 5913 | 0 |
| 5914 | 0 |
| 5915 | 0 |
| 5916 | 0 |
| 5917 | 0 |
| 5918 | 0 |
| 5919 | 0 |
| 5920 | 0 |
| 5921 | 0 |
| 5922 | 0 |
| 5923 | 0 |
| 5924 | 0 |
| 5925 | 0 |
| 5926 | 0 |
| 5927 | 0 |
| 5928 | 0 |
| 5929 | 0 |
| 5930 | 0 |
| 5931 | 0 |
| 5932 | 0 |
| 5933 | 0 |
| 5934 | 0 |
| 5935 | 0 |
| 5936 | 0 |
| 5937 | 0 |
| 5938 | 0 |
| 5939 | 0 |
| 5940 | 0 |
| 5941 | 0 |
| 5942 | 0 |
| 5943 | 0 |
| 5944 | 0 |
| 5945 | 0 |
| 5946 | 0 |
| 5947 | 0 |
| 5948 | 0 |
| 5949 | 0 |
| 5950 | 0 |
| 5951 | 0 |
| 5952 | 0 |
| 5953 | 0 |
| 5954 | 0 |
| 5955 | 0 |
| 5956 | 0 |
| 5957 | 0 |
| 5958 | 0 |
| 5959 | 0 |
| 5960 | 0 |
| 5961 | 0 |
| 5962 | 0 |
| 5963 | 0 |
| 5964 | 0 |
| 5965 | 0 |
| 5966 | 0 |
| 5967 | 0 |
| 5968 | 0 |
| 5969 | 0 |
| 5970 | 0 |
| 5971 | 0 |
| 5972 | 0 |
| 5973 | 0 |
| 5974 | 0 |
| 5975 | 0 |
| 5976 | 0 |
| 5977 | 0 |
| 5978 | 0 |
| 5979 | 0 |
| 5980 | 0 |
| 5981 | 0 |
| 5982 | 0 |
| 5983 | 0 |
| 5984 | 0 |
| 5985 | 0 |
| 5986 | 0 |
| 5987 | 0 |
| 5988 | 0 |
| 5989 | 0 |
| 5990 | 0 |
| 5991 | 0 |
| 5992 | 0 |
| 5993 | 0 |
| 5994 | 0 |
| 5995 | 0 |
| 5996 | 0 |
| 5997 | 0 |
| 5998 | 0 |
| 5999 | 0 |
| 6000 | 0 |
| 6001 | 0 |
| 6002 | 0 |
| 6003 | 0 |
| 6004 | 0 |
| 6005 | 0 |
| 6006 | 0 |
| 6007 | 0 |
| 6008 | 0 |
| 6009 | 0 |
| 6010 | 0 |
| 6011 | 0 |
| 6012 | 0 |
| 6013 | 0 |
| 6014 | 0 |
| 6015 | 0 |
| 6016 | 0 |
| 6017 | 0 |
| 6018 | 0 |
| 6019 | 0 |
| 6020 | 0 |
| 6021 | 0 |
| 6022 | 0 |
| 6023 | 0 |
| 6024 | 0 |
| 6025 | 0 |
| 6026 | 0 |
| 6027 | 0 |
| 6028 | 0 |
| 6029 | 0 |
| 6030 | 0 |
| 6031 | 0 |
| 6032 | 0 |
| 6033 | 0 |
| 6034 | 0 |
| 6035 | 0 |
| 6036 | 0 |
| 6037 | 0 |
| 6038 | 0 |
| 6039 | 0 |
| 6040 | 0 |
| 6041 | 0 |
| 6042 | 0 |
| 6043 | 0 |
| 6044 | 0 |
| 6045 | 0 |
| 6046 | 0 |
| 6047 | 0 |
| 6048 | 0 |
| 6049 | 0 |
| 6050 | 0 |
| 6051 | 0 |
| 6052 | 0 |
| 6053 | 0 |
| 6054 | 0 |
| 6055 | 0 |
| 6056 | 0 |
| 6057 | 0 |
| 6058 | 0 |
| 6059 | 0 |
| 6060 | 0 |
| 6061 | 0 |
| 6062 | 0 |
| 6063 | 0 |
| 6064 | 0 |
| 6065 | 0 |
| 6066 | 0 |
| 6067 | 0 |
| 6068 | 0 |
| 6069 | 0 |
| 6070 | 0 |
| 6071 | 0 |
| 6072 | 0 |
| 6073 | 0 |
| 6074 | 0 |
| 6075 | 0 |
| 6076 | 0 |
| 6077 | 0 |
| 6078 | 0 |
| 6079 | 0 |
| 6080 | 0 |
| 6081 | 0 |
| 6082 | 0 |
| 6083 | 0 |
| 6084 | 0 |
| 6085 | 0 |
| 6086 | 0 |
| 6087 | 0 |
| 6088 | 0 |
| 6089 | 0 |
| 6090 | 0 |
| 6091 | 0 |
| 6092 | 0 |
| 6093 | 0 |
| 6094 | 0 |
| 6095 | 0 |
| 6096 | 0 |
| 6097 | 0 |
| 6098 | 0 |
| 6099 | 0 |
| 6100 | 0 |
| 6101 | 0 |
| 6102 | 0 |
| 6103 | 0 |
| 6104 | 0 |
| 6105 | 0 |
| 6106 | 0 |
| 6107 | 0 |
| 6108 | 0 |
| 6109 | 0 |
| 6110 | 0 |
| 6111 | 0 |
| 6112 | 0 |
| 6113 | 0 |
| 6114 | 0 |
| 6115 | 0 |
| 6116 | 0 |
| 6117 | 0 |
| 6118 | 0 |
| 6119 | 0 |
| 6120 | 0 |
| 6121 | 0 |
| 6122 | 0 |
| 6123 | 0 |
| 6124 | 0 |
| 6125 | 0 |
| 6126 | 0 |
| 6127 | 0 |
| 6128 | 0 |
| 6129 | 0 |
| 6130 | 0 |
| 6131 | 0 |
| 6132 | 0 |
| 6133 | 0 |
| 6134 | 0 |
| 6135 | 0 |
| 6136 | 0 |
| 6137 | 0 |
| 6138 | 0 |
| 6139 | 0 |
| 6140 | 0 |
| 6141 | 0 |
| 6142 | 0 |
| 6143 | 0 |
| 6144 | 0 |
| 6145 | 0 |
| 6146 | 0 |
| 6147 | 0 |
| 6148 | 0 |
| 6149 | 0 |
| 6150 | 0 |
| 6151 | 0 |
| 6152 | 0 |
| 6153 | 0 |
| 6154 | 0 |
| 6155 | 0 |
| 6156 | 0 |
| 6157 | 0 |
| 6158 | 0 |
| 6159 | 0 |
| 6160 | 0 |
| 6161 | 0 |
| 6162 | 0 |
| 6163 | 0 |
| 6164 | 0 |
| 6165 | 0 |
| 6166 | 0 |
| 6167 | 0 |
| 6168 | 0 |
| 6169 | 0 |
| 6170 | 0 |
| 6171 | 0 |
| 6172 | 0 |
| 6173 | 0 |
| 6174 | 0 |
| 6175 | 0 |
| 6176 | 0 |
| 6177 | 0 |
| 6178 | 0 |
| 6179 | 0 |
| 6180 | 0 |
| 6181 | 0 |
| 6182 | 0 |
| 6183 | 0 |
| 6184 | 0 |
| 6185 | 0 |
| 6186 | 0 |
| 6187 | 0 |
| 6188 | 0 |
| 6189 | 0 |
| 6190 | 0 |
| 6191 | 0 |
| 6192 | 0 |
| 6193 | 0 |
| 6194 | 0 |
| 6195 | 0 |
| 6196 | 0 |
| 6197 | 0 |
| 6198 | 0 |
| 6199 | 0 |
| 6200 | 0 |
| 6201 | 0 |
| 6202 | 0 |
| 6203 | 0 |
| 6204 | 0 |
| 6205 | 0 |
| 6206 | 0 |
| 6207 | 0 |
| 6208 | 0 |
| 6209 | 0 |
| 6210 | 0 |
| 6211 | 0 |
| 6212 | 0 |
| 6213 | 0 |
| 6214 | 0 |
| 6215 | 0 |
| 6216 | 0 |
| 6217 | 0 |
| 6218 | 0 |
| 6219 | 0 |
| 6220 | 0 |
| 6221 | 0 |
| 6222 | 0 |
| 6223 | 0 |
| 6224 | 0 |
| 6225 | 0 |
| 6226 | 0 |
| 6227 | 0 |
| 6228 | 0 |
| 6229 | 0 |
| 6230 | 0 |
| 6231 | 0 |
| 6232 | 0 |
| 6233 | 0 |
| 6234 | 0 |
| 6235 | 0 |
| 6236 | 0 |
| 6237 | 0 |
| 6238 | 0 |
| 6239 | 0 |
| 6240 | 0 |
| 6241 | 0 |
| 6242 | 0 |
| 6243 | 0 |
| 6244 | 0 |
| 6245 | 0 |
| 6246 | 0 |
| 6247 | 0 |
| 6248 | 0 |
| 6249 | 0 |
| 6250 | 0 |
| 6251 | 0 |
| 6252 | 0 |
| 6253 | 0 |
| 6254 | 0 |
| 6255 | 0 |
| 6256 | 0 |
| 6257 | 0 |
| 6258 | 0 |
| 6259 | 0 |
| 6260 | 0 |
| 6261 | 0 |
| 6262 | 0 |
| 6263 | 0 |
| 6264 | 0 |
| 6265 | 0 |
| 6266 | 0 |
| 6267 | 0 |
| 6268 | 0 |
| 6269 | 0 |
| 6270 | 0 |
| 6271 | 0 |
| 6272 | 0 |
| 6273 | 0 |
| 6274 | 0 |
| 6275 | 0 |
| 6276 | 0 |
| 6277 | 0 |
| 6278 | 0 |
| 6279 | 0 |
| 6280 | 0 |
| 6281 | 0 |
| 6282 | 0 |
| 6283 | 0 |
| 6284 | 0 |
| 6285 | 0 |
| 6286 | 0 |
| 6287 | 0 |
| 6288 | 0 |
| 6289 | 0 |
| 6290 | 0 |
| 6291 | 0 |
| 6292 | 0 |
| 6293 | 0 |
| 6294 | 0 |
| 6295 | 0 |
| 6296 | 0 |
| 6297 | 0 |
| 6298 | 0 |
| 6299 | 0 |
| 6300 | 0 |
| 6301 | 0 |
| 6302 | 0 |
| 6303 | 0 |
| 6304 | 0 |
| 6305 | 0 |
| 6306 | 0 |
| 6307 | 0 |
| 6308 | 0 |
| 6309 | 0 |
| 6310 | 0 |
| 6311 | 0 |
| 6312 | 0 |
| 6313 | 0 |
| 6314 | 0 |
| 6315 | 0 |
| 6316 | 0 |
| 6317 | 0 |
| 6318 | 0 |
| 6319 | 0 |
| 6320 | 0 |
| 6321 | 0 |
| 6322 | 0 |
| 6323 | 0 |
| 6324 | 0 |
| 6325 | 0 |
| 6326 | 0 |
| 6327 | 0 |
| 6328 | 0 |
| 6329 | 0 |
| 6330 | 0 |
| 6331 | 0 |
| 6332 | 0 |
| 6333 | 0 |
| 6334 | 0 |
| 6335 | 0 |
| 6336 | 0 |
| 6337 | 0 |
| 6338 | 0 |
| 6339 | 0 |
| 6340 | 0 |
| 6341 | 0 |
| 6342 | 0 |
| 6343 | 0 |
| 6344 | 0 |
| 6345 | 0 |
| 6346 | 0 |
| 6347 | 0 |
| 6348 | 0 |
| 6349 | 0 |
| 6350 | 0 |
| 6351 | 0 |
| 6352 | 0 |
| 6353 | 0 |
| 6354 | 0 |
| 6355 | 0 |
| 6356 | 0 |
| 6357 | 0 |
| 6358 | 0 |
| 6359 | 0 |
| 6360 | 0 |
| 6361 | 0 |
| 6362 | 0 |
| 6363 | 0 |
| 6364 | 0 |
| 6365 | 0 |
| 6366 | 0 |
| 6367 | 0 |
| 6368 | 0 |
| 6369 | 0 |
| 6370 | 0 |
| 6371 | 0 |
| 6372 | 0 |
| 6373 | 0 |
| 6374 | 0 |
| 6375 | 0 |
| 6376 | 0 |
| 6377 | 0 |
| 6378 | 0 |
| 6379 | 0 |
| 6380 | 0 |
| 6381 | 0 |
| 6382 | 0 |
| 6383 | 0 |
| 6384 | 0 |
| 6385 | 0 |
| 6386 | 0 |
| 6387 | 0 |
| 6388 | 0 |
| 6389 | 0 |
| 6390 | 0 |
| 6391 | 0 |
| 6392 | 0 |
| 6393 | 0 |
| 6394 | 0 |
| 6395 | 0 |
| 6396 | 0 |
| 6397 | 0 |
| 6398 | 0 |
| 6399 | 0 |
| 6400 | 0 |
| 6401 | 0 |
| 6402 | 0 |
| 6403 | 0 |
| 6404 | 0 |
| 6405 | 0 |
| 6406 | 0 |
| 6407 | 0 |
| 6408 | 0 |
| 6409 | 0 |
| 6410 | 0 |
| 6411 | 0 |
| 6412 | 0 |
| 6413 | 0 |
| 6414 | 0 |
| 6415 | 0 |
| 6416 | 0 |
| 6417 | 0 |
| 6418 | 0 |
| 6419 | 0 |
| 6420 | 0 |
| 6421 | 0 |
| 6422 | 0 |
| 6423 | 0 |
| 6424 | 0 |
| 6425 | 0 |
| 6426 | 0 |
| 6427 | 0 |
| 6428 | 0 |
| 6429 | 0 |
| 6430 | 0 |
| 6431 | 0 |
| 6432 | 0 |
| 6433 | 0 |
| 6434 | 0 |
| 6435 | 0 |
| 6436 | 0 |
| 6437 | 0 |
| 6438 | 0 |
| 6439 | 0 |
| 6440 | 0 |
| 6441 | 0 |
| 6442 | 0 |
| 6443 | 0 |
| 6444 | 0 |
| 6445 | 0 |
| 6446 | 0 |
| 6447 | 0 |
| 6448 | 0 |
| 6449 | 0 |
| 6450 | 0 |
| 6451 | 0 |
| 6452 | 0 |
| 6453 | 0 |
| 6454 | 0 |
| 6455 | 0 |
| 6456 | 0 |
| 6457 | 0 |
| 6458 | 0 |
| 6459 | 0 |
| 6460 | 0 |
| 6461 | 0 |
| 6462 | 0 |
| 6463 | 0 |
| 6464 | 0 |
| 6465 | 0 |
| 6466 | 0 |
| 6467 | 0 |
| 6468 | 0 |
| 6469 | 0 |
| 6470 | 0 |
| 6471 | 0 |
| 6472 | 0 |
| 6473 | 0 |
| 6474 | 0 |
| 6475 | 0 |
| 6476 | 0 |
| 6477 | 0 |
| 6478 | 0 |
| 6479 | 0 |
| 6480 | 0 |
| 6481 | 0 |
| 6482 | 0 |
| 6483 | 0 |
| 6484 | 0 |
| 6485 | 0 |
| 6486 | 0 |
| 6487 | 0 |
| 6488 | 0 |
| 6489 | 0 |
| 6490 | 0 |
| 6491 | 0 |
| 6492 | 0 |
| 6493 | 0 |
| 6494 | 0 |
| 6495 | 0 |
| 6496 | 0 |
| 6497 | 0 |
| 6498 | 0 |
| 6499 | 0 |
| 6500 | 0 |
| 6501 | 0 |
| 6502 | 0 |
| 6503 | 0 |
| 6504 | 0 |
| 6505 | 0 |
| 6506 | 0 |
| 6507 | 0 |
| 6508 | 0 |
| 6509 | 0 |
| 6510 | 0 |
| 6511 | 0 |
| 6512 | 0 |
| 6513 | 0 |
| 6514 | 0 |
| 6515 | 0 |
| 6516 | 0 |
| 6517 | 0 |
| 6518 | 0 |
| 6519 | 0 |
| 6520 | 0 |
| 6521 | 0 |
| 6522 | 0 |
| 6523 | 0 |
| 6524 | 0 |
| 6525 | 0 |
| 6526 | 0 |
| 6527 | 0 |
| 6528 | 0 |
| 6529 | 0 |
| 6530 | 0 |
| 6531 | 0 |
| 6532 | 0 |
| 6533 | 0 |
| 6534 | 0 |
| 6535 | 0 |
| 6536 | 0 |
| 6537 | 0 |
| 6538 | 0 |
| 6539 | 0 |
| 6540 | 0 |
| 6541 | 0 |
| 6542 | 0 |
| 6543 | 0 |
| 6544 | 0 |
| 6545 | 0 |
| 6546 | 0 |
| 6547 | 0 |
| 6548 | 0 |
| 6549 | 0 |
| 6550 | 0 |
| 6551 | 0 |
| 6552 | 0 |
| 6553 | 0 |
| 6554 | 0 |
| 6555 | 0 |
| 6556 | 0 |
| 6557 | 0 |
| 6558 | 0 |
| 6559 | 0 |
| 6560 | 0 |
| 6561 | 0 |
| 6562 | 0 |
| 6563 | 0 |
| 6564 | 0 |
| 6565 | 0 |
| 6566 | 0 |
| 6567 | 0 |
| 6568 | 0 |
| 6569 | 0 |
| 6570 | 0 |
| 6571 | 0 |
| 6572 | 0 |
| 6573 | 0 |
| 6574 | 0 |
| 6575 | 0 |
| 6576 | 0 |
| 6577 | 0 |
| 6578 | 0 |
| 6579 | 0 |
| 6580 | 0 |
| 6581 | 0 |
| 6582 | 0 |
| 6583 | 0 |
| 6584 | 0 |
| 6585 | 0 |
| 6586 | 0 |
| 6587 | 0 |
| 6588 | 0 |
| 6589 | 0 |
| 6590 | 0 |
| 6591 | 0 |
| 6592 | 0 |
| 6593 | 0 |
| 6594 | 0 |
| 6595 | 0 |
| 6596 | 0 |
| 6597 | 0 |
| 6598 | 0 |
| 6599 | 0 |
| 6600 | 0 |
| 6601 | 0 |
| 6602 | 0 |
| 6603 | 0 |
| 6604 | 0 |
| 6605 | 0 |
| 6606 | 0 |
| 6607 | 0 |
| 6608 | 0 |
| 6609 | 0 |
| 6610 | 0 |
| 6611 | 0 |
| 6612 | 0 |
| 6613 | 0 |
| 6614 | 0 |
| 6615 | 0 |
| 6616 | 0 |
| 6617 | 0 |
| 6618 | 0 |
| 6619 | 0 |
| 6620 | 0 |
| 6621 | 0 |
| 6622 | 0 |
| 6623 | 0 |
| 6624 | 0 |
| 6625 | 0 |
| 6626 | 0 |
| 6627 | 0 |
| 6628 | 0 |
| 6629 | 0 |
| 6630 | 0 |
| 6631 | 0 |
| 6632 | 0 |
| 6633 | 0 |
| 6634 | 0 |
| 6635 | 0 |
| 6636 | 0 |
| 6637 | 0 |
| 6638 | 0 |
| 6639 | 0 |
| 6640 | 0 |
| 6641 | 0 |
| 6642 | 0 |
| 6643 | 0 |
| 6644 | 0 |
| 6645 | 0 |
| 6646 | 0 |
| 6647 | 0 |
| 6648 | 0 |
| 6649 | 0 |
| 6650 | 0 |
| 6651 | 0 |
| 6652 | 0 |
| 6653 | 0 |
| 6654 | 0 |
| 6655 | 0 |
| 6656 | 0 |
| 6657 | 0 |
| 6658 | 0 |
| 6659 | 0 |
| 6660 | 0 |
| 6661 | 0 |
| 6662 | 0 |
| 6663 | 0 |
| 6664 | 0 |
| 6665 | 0 |
| 6666 | 0 |
| 6667 | 0 |
| 6668 | 0 |
| 6669 | 0 |
| 6670 | 0 |
| 6671 | 0 |
| 6672 | 0 |
| 6673 | 0 |
| 6674 | 0 |
| 6675 | 0 |
| 6676 | 0 |
| 6677 | 0 |
| 6678 | 0 |
| 6679 | 0 |
| 6680 | 0 |
| 6681 | 0 |
| 6682 | 0 |
| 6683 | 0 |
| 6684 | 0 |
| 6685 | 0 |
| 6686 | 0 |
| 6687 | 0 |
| 6688 | 0 |
| 6689 | 0 |
| 6690 | 0 |
| 6691 | 0 |
| 6692 | 0 |
| 6693 | 0 |
| 6694 | 0 |
| 6695 | 0 |
| 6696 | 0 |
| 6697 | 0 |
| 6698 | 0 |
| 6699 | 0 |
| 6700 | 0 |
| 6701 | 0 |
| 6702 | 0 |
| 6703 | 0 |
| 6704 | 0 |
| 6705 | 0 |
| 6706 | 0 |
| 6707 | 0 |
| 6708 | 0 |
| 6709 | 0 |
| 6710 | 0 |
| 6711 | 0 |
| 6712 | 0 |
| 6713 | 0 |
| 6714 | 0 |
| 6715 | 0 |
| 6716 | 0 |
| 6717 | 0 |
| 6718 | 0 |
| 6719 | 0 |
| 6720 | 0 |
| 6721 | 0 |
| 6722 | 0 |
| 6723 | 0 |
| 6724 | 0 |
| 6725 | 0 |
| 6726 | 0 |
| 6727 | 0 |
| 6728 | 0 |
| 6729 | 0 |
| 6730 | 0 |
| 6731 | 0 |
| 6732 | 0 |
| 6733 | 0 |
| 6734 | 0 |
| 6735 | 0 |
| 6736 | 0 |
| 6737 | 0 |
| 6738 | 0 |
| 6739 | 0 |
| 6740 | 0 |
| 6741 | 0 |
| 6742 | 0 |
| 6743 | 0 |
| 6744 | 0 |
| 6745 | 0 |
| 6746 | 0 |
| 6747 | 0 |
| 6748 | 0 |
| 6749 | 0 |
| 6750 | 0 |
| 6751 | 0 |
| 6752 | 0 |
| 6753 | 0 |
| 6754 | 0 |
| 6755 | 0 |
| 6756 | 0 |
| 6757 | 0 |
| 6758 | 0 |
| 6759 | 0 |
| 6760 | 0 |
| 6761 | 0 |
| 6762 | 0 |
| 6763 | 0 |
| 6764 | 0 |
| 6765 | 0 |
| 6766 | 0 |
| 6767 | 0 |
| 6768 | 0 |
| 6769 | 0 |
| 6770 | 0 |
| 6771 | 0 |
| 6772 | 0 |
| 6773 | 0 |
| 6774 | 0 |
| 6775 | 0 |
| 6776 | 0 |
| 6777 | 0 |
| 6778 | 0 |
| 6779 | 0 |
| 6780 | 0 |
| 6781 | 0 |
| 6782 | 0 |
| 6783 | 0 |
| 6784 | 0 |
| 6785 | 0 |
| 6786 | 0 |
| 6787 | 0 |
| 6788 | 0 |
| 6789 | 0 |
| 6790 | 0 |
| 6791 | 0 |
| 6792 | 0 |
| 6793 | 0 |
| 6794 | 0 |
| 6795 | 0 |
| 6796 | 0 |
| 6797 | 0 |
| 6798 | 0 |
| 6799 | 0 |
| 6800 | 0 |
| 6801 | 0 |
| 6802 | 0 |
| 6803 | 0 |
| 6804 | 0 |
| 6805 | 0 |
| 6806 | 0 |
| 6807 | 0 |
| 6808 | 0 |
| 6809 | 0 |
| 6810 | 0 |
| 6811 | 0 |
| 6812 | 0 |
| 6813 | 0 |
| 6814 | 0 |
| 6815 | 0 |
| 6816 | 0 |
| 6817 | 0 |
| 6818 | 0 |
| 6819 | 0 |
| 6820 | 0 |
| 6821 | 0 |
| 6822 | 0 |
| 6823 | 0 |
| 6824 | 0 |
| 6825 | 0 |
| 6826 | 0 |
| 6827 | 0 |
| 6828 | 0 |
| 6829 | 0 |
| 6830 | 0 |
| 6831 | 0 |
| 6832 | 0 |
| 6833 | 0 |
| 6834 | 0 |
| 6835 | 0 |
| 6836 | 0 |
| 6837 | 0 |
| 6838 | 0 |
| 6839 | 0 |
| 6840 | 0 |
| 6841 | 0 |
| 6842 | 0 |
| 6843 | 0 |
| 6844 | 0 |
| 6845 | 0 |
| 6846 | 0 |
| 6847 | 0 |
| 6848 | 0 |
| 6849 | 0 |
| 6850 | 0 |
| 6851 | 0 |
| 6852 | 0 |
| 6853 | 0 |
| 6854 | 0 |
| 6855 | 0 |
| 6856 | 0 |
| 6857 | 0 |
| 6858 | 0 |
| 6859 | 0 |
| 6860 | 0 |
| 6861 | 0 |
| 6862 | 0 |
| 6863 | 0 |
| 6864 | 0 |
| 6865 | 0 |
| 6866 | 0 |
| 6867 | 0 |
| 6868 | 0 |
| 6869 | 0 |
| 6870 | 0 |
| 6871 | 0 |
| 6872 | 0 |
| 6873 | 0 |
| 6874 | 0 |
| 6875 | 0 |
| 6876 | 0 |
| 6877 | 0 |
| 6878 | 0 |
| 6879 | 0 |
| 6880 | 0 |
| 6881 | 0 |
| 6882 | 0 |
| 6883 | 0 |
| 6884 | 0 |
| 6885 | 0 |
| 6886 | 0 |
| 6887 | 0 |
| 6888 | 0 |
| 6889 | 0 |
| 6890 | 0 |
| 6891 | 0 |
| 6892 | 0 |
| 6893 | 0 |
| 6894 | 0 |
| 6895 | 0 |
| 6896 | 0 |
| 6897 | 0 |
| 6898 | 0 |
| 6899 | 0 |
| 6900 | 0 |
| 6901 | 0 |
| 6902 | 0 |
| 6903 | 0 |
| 6904 | 0 |
| 6905 | 0 |
| 6906 | 0 |
| 6907 | 0 |
| 6908 | 0 |
| 6909 | 0 |
| 6910 | 0 |
| 6911 | 0 |
| 6912 | 0 |
| 6913 | 0 |
| 6914 | 0 |
| 6915 | 0 |
| 6916 | 0 |
| 6917 | 0 |
| 6918 | 0 |
| 6919 | 0 |
| 6920 | 0 |
| 6921 | 0 |
| 6922 | 0 |
| 6923 | 0 |
| 6924 | 0 |
| 6925 | 0 |
| 6926 | 0 |
| 6927 | 0 |
| 6928 | 0 |
| 6929 | 0 |
| 6930 | 0 |
| 6931 | 0 |
| 6932 | 0 |
| 6933 | 0 |
| 6934 | 0 |
| 6935 | 0 |
| 6936 | 0 |
| 6937 | 0 |
| 6938 | 0 |
| 6939 | 0 |
| 6940 | 0 |
| 6941 | 0 |
| 6942 | 0 |
| 6943 | 0 |
| 6944 | 0 |
| 6945 | 0 |
| 6946 | 0 |
| 6947 | 0 |
| 6948 | 0 |
| 6949 | 0 |
| 6950 | 0 |
| 6951 | 0 |
| 6952 | 0 |
| 6953 | 0 |
| 6954 | 0 |
| 6955 | 0 |
| 6956 | 0 |
| 6957 | 0 |
| 6958 | 0 |
| 6959 | 0 |
| 6960 | 0 |
| 6961 | 0 |
| 6962 | 0 |
| 6963 | 0 |
| 6964 | 0 |
| 6965 | 0 |
| 6966 | 0 |
| 6967 | 0 |
| 6968 | 0 |
| 6969 | 0 |
| 6970 | 0 |
| 6971 | 0 |
| 6972 | 0 |
| 6973 | 0 |
| 6974 | 0 |
| 6975 | 0 |
| 6976 | 0 |
| 6977 | 0 |
| 6978 | 0 |
| 6979 | 0 |
| 6980 | 0 |
| 6981 | 0 |
| 6982 | 0 |
| 6983 | 0 |
| 6984 | 0 |
| 6985 | 0 |
| 6986 | 0 |
| 6987 | 0 |
| 6988 | 0 |
| 6989 | 0 |
| 6990 | 0 |
| 6991 | 0 |
| 6992 | 0 |
| 6993 | 0 |
| 6994 | 0 |
| 6995 | 0 |
| 6996 | 0 |
| 6997 | 0 |
| 6998 | 0 |
| 6999 | 0 |
| 7000 | 0 |
| 7001 | 0 |
| 7002 | 0 |
| 7003 | 0 |
| 7004 | 0 |
| 7005 | 0 |
| 7006 | 0 |
| 7007 | 0 |
| 7008 | 0 |
| 7009 | 0 |
| 7010 | 0 |
| 7011 | 0 |
| 7012 | 0 |
| 7013 | 0 |
| 7014 | 0 |
| 7015 | 0 |
| 7016 | 0 |
| 7017 | 0 |
| 7018 | 0 |
| 7019 | 0 |
| 7020 | 0 |
| 7021 | 0 |
| 7022 | 0 |
| 7023 | 0 |
| 7024 | 0 |
| 7025 | 0 |
| 7026 | 0 |
| 7027 | 0 |
| 7028 | 0 |
| 7029 | 0 |
| 7030 | 0 |
| 7031 | 0 |
| 7032 | 0 |
| 7033 | 0 |
| 7034 | 0 |
| 7035 | 0 |
| 7036 | 0 |
| 7037 | 0 |
| 7038 | 0 |
| 7039 | 0 |
| 7040 | 0 |
| 7041 | 0 |
| 7042 | 0 |
| 7043 | 0 |
| 7044 | 0 |
| 7045 | 0 |
| 7046 | 0 |
| 7047 | 0 |
| 7048 | 0 |
| 7049 | 0 |
| 7050 | 0 |
| 7051 | 0 |
| 7052 | 0 |
| 7053 | 0 |
| 7054 | 0 |
| 7055 | 0 |
| 7056 | 0 |
| 7057 | 0 |
| 7058 | 0 |
| 7059 | 0 |
| 7060 | 0 |
| 7061 | 0 |
| 7062 | 0 |
| 7063 | 0 |
| 7064 | 0 |
| 7065 | 0 |
| 7066 | 0 |
| 7067 | 0 |
| 7068 | 0 |
| 7069 | 0 |
| 7070 | 0 |
| 7071 | 0 |
| 7072 | 0 |
| 7073 | 0 |
| 7074 | 0 |
| 7075 | 0 |
| 7076 | 0 |
| 7077 | 0 |
| 7078 | 0 |
| 7079 | 0 |
| 7080 | 0 |
| 7081 | 0 |
| 7082 | 0 |
| 7083 | 0 |
| 7084 | 0 |
| 7085 | 0 |
| 7086 | 0 |
| 7087 | 0 |
| 7088 | 0 |
| 7089 | 0 |
| 7090 | 0 |
| 7091 | 0 |
| 7092 | 0 |
| 7093 | 0 |
| 7094 | 0 |
| 7095 | 0 |
| 7096 | 0 |
| 7097 | 0 |
| 7098 | 0 |
| 7099 | 0 |
| 7100 | 0 |
| 7101 | 0 |
| 7102 | 0 |
| 7103 | 0 |
| 7104 | 0 |
| 7105 | 0 |
| 7106 | 0 |
| 7107 | 0 |
| 7108 | 0 |
| 7109 | 0 |
| 7110 | 0 |
| 7111 | 0 |
| 7112 | 0 |
| 7113 | 0 |
| 7114 | 0 |
| 7115 | 0 |
| 7116 | 0 |
| 7117 | 0 |
| 7118 | 0 |
| 7119 | 0 |
| 7120 | 0 |
| 7121 | 0 |
| 7122 | 0 |
| 7123 | 0 |
| 7124 | 0 |
| 7125 | 0 |
| 7126 | 0 |
| 7127 | 0 |
| 7128 | 0 |
| 7129 | 0 |
| 7130 | 0 |
| 7131 | 0 |
| 7132 | 0 |
| 7133 | 0 |
| 7134 | 0 |
| 7135 | 0 |
| 7136 | 0 |
| 7137 | 0 |
| 7138 | 0 |
| 7139 | 0 |
| 7140 | 0 |
| 7141 | 0 |
| 7142 | 0 |
| 7143 | 0 |
| 7144 | 0 |
| 7145 | 0 |
| 7146 | 0 |
| 7147 | 0 |
| 7148 | 0 |
| 7149 | 0 |
| 7150 | 0 |
| 7151 | 0 |
| 7152 | 0 |
| 7153 | 0 |
| 7154 | 0 |
| 7155 | 0 |
| 7156 | 0 |
| 7157 | 0 |
| 7158 | 0 |
| 7159 | 0 |
| 7160 | 0 |
| 7161 | 0 |
| 7162 | 0 |
| 7163 | 0 |
| 7164 | 0 |
| 7165 | 0 |
| 7166 | 0 |
| 7167 | 0 |
| 7168 | 0 |
| 7169 | 0 |
| 7170 | 0 |
| 7171 | 0 |
| 7172 | 0 |
| 7173 | 0 |
| 7174 | 0 |
| 7175 | 0 |
| 7176 | 0 |
| 7177 | 0 |
| 7178 | 0 |
| 7179 | 0 |
| 7180 | 0 |
| 7181 | 0 |
| 7182 | 0 |
| 7183 | 0 |
| 7184 | 0 |
| 7185 | 0 |
| 7186 | 0 |
| 7187 | 0 |
| 7188 | 0 |
| 7189 | 0 |
| 7190 | 0 |
| 7191 | 0 |
| 7192 | 0 |
| 7193 | 0 |
| 7194 | 0 |
| 7195 | 0 |
| 7196 | 0 |
| 7197 | 0 |
| 7198 | 0 |
| 7199 | 0 |
| 7200 | 0 |
| 7201 | 0 |
| 7202 | 0 |
| 7203 | 0 |
| 7204 | 0 |
| 7205 | 0 |
| 7206 | 0 |
| 7207 | 0 |
| 7208 | 0 |
| 7209 | 0 |
| 7210 | 0 |
| 7211 | 0 |
| 7212 | 0 |
| 7213 | 0 |
| 7214 | 0 |
| 7215 | 0 |
| 7216 | 0 |
| 7217 | 0 |
| 7218 | 0 |
| 7219 | 0 |
| 7220 | 0 |
| 7221 | 0 |
| 7222 | 0 |
| 7223 | 0 |
| 7224 | 0 |
| 7225 | 0 |
| 7226 | 0 |
| 7227 | 0 |
| 7228 | 0 |
| 7229 | 0 |
| 7230 | 0 |
| 7231 | 0 |
| 7232 | 0 |
| 7233 | 0 |
| 7234 | 0 |
| 7235 | 0 |
| 7236 | 0 |
| 7237 | 0 |
| 7238 | 0 |
| 7239 | 0 |
| 7240 | 0 |
| 7241 | 0 |
| 7242 | 0 |
| 7243 | 0 |
| 7244 | 0 |
| 7245 | 0 |
| 7246 | 0 |
| 7247 | 0 |
| 7248 | 0 |
| 7249 | 0 |
| 7250 | 0 |
| 7251 | 0 |
| 7252 | 0 |
| 7253 | 0 |
| 7254 | 0 |
| 7255 | 0 |
| 7256 | 0 |
| 7257 | 0 |
| 7258 | 0 |
| 7259 | 0 |
| 7260 | 0 |
| 7261 | 0 |
| 7262 | 0 |
| 7263 | 0 |
| 7264 | 0 |
| 7265 | 0 |
| 7266 | 0 |
| 7267 | 0 |
| 7268 | 0 |
| 7269 | 0 |
| 7270 | 0 |
| 7271 | 0 |
| 7272 | 0 |
| 7273 | 0 |
| 7274 | 0 |
| 7275 | 0 |
| 7276 | 0 |
| 7277 | 0 |
| 7278 | 0 |
| 7279 | 0 |
| 7280 | 0 |
| 7281 | 0 |
| 7282 | 0 |
| 7283 | 0 |
| 7284 | 0 |
| 7285 | 0 |
| 7286 | 0 |
| 7287 | 0 |
| 7288 | 0 |
| 7289 | 0 |
| 7290 | 0 |
| 7291 | 0 |
| 7292 | 0 |
| 7293 | 0 |
| 7294 | 0 |
| 7295 | 0 |
| 7296 | 0 |
| 7297 | 0 |
| 7298 | 0 |
| 7299 | 0 |
| 7300 | 0 |
| 7301 | 0 |
| 7302 | 0 |
| 7303 | 0 |
| 7304 | 0 |
| 7305 | 0 |
| 7306 | 0 |
| 7307 | 0 |
| 7308 | 0 |
| 7309 | 0 |
| 7310 | 0 |
| 7311 | 0 |
| 7312 | 0 |
| 7313 | 0 |
| 7314 | 0 |
| 7315 | 0 |
| 7316 | 0 |
| 7317 | 0 |
| 7318 | 0 |
| 7319 | 0 |
| 7320 | 0 |
| 7321 | 0 |
| 7322 | 0 |
| 7323 | 0 |
| 7324 | 0 |
| 7325 | 0 |
| 7326 | 0 |
| 7327 | 0 |
| 7328 | 0 |
| 7329 | 0 |
| 7330 | 0 |
| 7331 | 0 |
| 7332 | 0 |
| 7333 | 0 |
| 7334 | 0 |
| 7335 | 0 |
| 7336 | 0 |
| 7337 | 0 |
| 7338 | 0 |
| 7339 | 0 |
| 7340 | 0 |
| 7341 | 0 |
| 7342 | 0 |
| 7343 | 0 |
| 7344 | 0 |
| 7345 | 0 |
| 7346 | 0 |
| 7347 | 0 |
| 7348 | 0 |
| 7349 | 0 |
| 7350 | 0 |
| 7351 | 0 |
| 7352 | 0 |
| 7353 | 0 |
| 7354 | 0 |
| 7355 | 0 |
| 7356 | 0 |
| 7357 | 0 |
| 7358 | 0 |
| 7359 | 0 |
| 7360 | 0 |
| 7361 | 0 |
| 7362 | 0 |
| 7363 | 0 |
| 7364 | 0 |
| 7365 | 0 |
| 7366 | 0 |
| 7367 | 0 |
| 7368 | 0 |
| 7369 | 0 |
| 7370 | 0 |
| 7371 | 0 |
| 7372 | 0 |
| 7373 | 0 |
| 7374 | 0 |
| 7375 | 0 |
| 7376 | 0 |
| 7377 | 0 |
| 7378 | 0 |
| 7379 | 0 |
| 7380 | 0 |
| 7381 | 0 |
| 7382 | 0 |
| 7383 | 0 |
| 7384 | 0 |
| 7385 | 0 |
| 7386 | 0 |
| 7387 | 0 |
| 7388 | 0 |
| 7389 | 0 |
| 7390 | 0 |
| 7391 | 0 |
| 7392 | 0 |
| 7393 | 0 |
| 7394 | 0 |
| 7395 | 0 |
| 7396 | 0 |
| 7397 | 0 |
| 7398 | 0 |
| 7399 | 0 |
| 7400 | 0 |
| 7401 | 0 |
| 7402 | 0 |
| 7403 | 0 |
| 7404 | 0 |
| 7405 | 0 |
| 7406 | 0 |
| 7407 | 0 |
| 7408 | 0 |
| 7409 | 0 |
| 7410 | 0 |
| 7411 | 0 |
| 7412 | 0 |
| 7413 | 0 |
| 7414 | 0 |
| 7415 | 0 |
| 7416 | 0 |
| 7417 | 0 |
| 7418 | 0 |
| 7419 | 0 |
| 7420 | 0 |
| 7421 | 0 |
| 7422 | 0 |
| 7423 | 0 |
| 7424 | 0 |
| 7425 | 0 |
| 7426 | 0 |
| 7427 | 0 |
| 7428 | 0 |
| 7429 | 0 |
| 7430 | 0 |
| 7431 | 0 |
| 7432 | 0 |
| 7433 | 0 |
| 7434 | 0 |
| 7435 | 0 |
| 7436 | 0 |
| 7437 | 0 |
| 7438 | 0 |
| 7439 | 0 |
| 7440 | 0 |
| 7441 | 0 |
| 7442 | 0 |
| 7443 | 0 |
| 7444 | 0 |
| 7445 | 0 |
| 7446 | 0 |
| 7447 | 0 |
| 7448 | 0 |
| 7449 | 0 |
| 7450 | 0 |
| 7451 | 0 |
| 7452 | 0 |
| 7453 | 0 |
| 7454 | 0 |
| 7455 | 0 |
| 7456 | 0 |
| 7457 | 0 |
| 7458 | 0 |
| 7459 | 0 |
| 7460 | 0 |
| 7461 | 0 |
| 7462 | 0 |
| 7463 | 0 |
| 7464 | 0 |
| 7465 | 0 |
| 7466 | 0 |
| 7467 | 0 |
| 7468 | 0 |
| 7469 | 0 |
| 7470 | 0 |
| 7471 | 0 |
| 7472 | 0 |
| 7473 | 0 |
| 7474 | 0 |
| 7475 | 0 |
| 7476 | 0 |
| 7477 | 0 |
| 7478 | 0 |
| 7479 | 0 |
| 7480 | 0 |
| 7481 | 0 |
| 7482 | 0 |
| 7483 | 0 |
| 7484 | 0 |
| 7485 | 0 |
| 7486 | 0 |
| 7487 | 0 |
| 7488 | 0 |
| 7489 | 0 |
| 7490 | 0 |
| 7491 | 0 |
| 7492 | 0 |
| 7493 | 0 |
| 7494 | 0 |
| 7495 | 0 |
| 7496 | 0 |
| 7497 | 0 |
| 7498 | 0 |
| 7499 | 0 |
| 7500 | 0 |
| 7501 | 0 |
| 7502 | 0 |
| 7503 | 0 |
| 7504 | 0 |
| 7505 | 0 |
| 7506 | 0 |
| 7507 | 0 |
| 7508 | 0 |
| 7509 | 0 |
| 7510 | 0 |
| 7511 | 0 |
| 7512 | 0 |
| 7513 | 0 |
| 7514 | 0 |
| 7515 | 0 |
| 7516 | 0 |
| 7517 | 0 |
| 7518 | 0 |
| 7519 | 0 |
| 7520 | 0 |
| 7521 | 0 |
| 7522 | 0 |
| 7523 | 0 |
| 7524 | 0 |
| 7525 | 0 |
| 7526 | 0 |
| 7527 | 0 |
| 7528 | 0 |
| 7529 | 0 |
| 7530 | 0 |
| 7531 | 0 |
| 7532 | 0 |
| 7533 | 0 |
| 7534 | 0 |
| 7535 | 0 |
| 7536 | 0 |
| 7537 | 0 |
| 7538 | 0 |
| 7539 | 0 |
| 7540 | 0 |
| 7541 | 0 |
| 7542 | 0 |
| 7543 | 0 |
| 7544 | 0 |
| 7545 | 0 |
| 7546 | 0 |
| 7547 | 0 |
| 7548 | 0 |
| 7549 | 0 |
| 7550 | 0 |
| 7551 | 0 |
| 7552 | 0 |
| 7553 | 0 |
| 7554 | 0 |
| 7555 | 0 |
| 7556 | 0 |
| 7557 | 0 |
| 7558 | 0 |
| 7559 | 0 |
| 7560 | 0 |
| 7561 | 0 |
| 7562 | 0 |
| 7563 | 0 |
| 7564 | 0 |
| 7565 | 0 |
| 7566 | 0 |
| 7567 | 0 |
| 7568 | 0 |
| 7569 | 0 |
| 7570 | 0 |
| 7571 | 0 |
| 7572 | 0 |
| 7573 | 0 |
| 7574 | 0 |
| 7575 | 0 |
| 7576 | 0 |
| 7577 | 0 |
| 7578 | 0 |
| 7579 | 0 |
| 7580 | 0 |
| 7581 | 0 |
| 7582 | 0 |
| 7583 | 0 |
| 7584 | 0 |
| 7585 | 0 |
| 7586 | 0 |
| 7587 | 0 |
| 7588 | 0 |
| 7589 | 0 |
| 7590 | 0 |
| 7591 | 0 |
| 7592 | 0 |
| 7593 | 0 |
| 7594 | 0 |
| 7595 | 0 |
| 7596 | 0 |
| 7597 | 0 |
| 7598 | 0 |
| 7599 | 0 |
| 7600 | 0 |
| 7601 | 0 |
| 7602 | 0 |
| 7603 | 0 |
| 7604 | 0 |
| 7605 | 0 |
| 7606 | 0 |
| 7607 | 0 |
| 7608 | 0 |
| 7609 | 0 |
| 7610 | 0 |
| 7611 | 0 |
| 7612 | 0 |
| 7613 | 0 |
| 7614 | 0 |
| 7615 | 0 |
| 7616 | 0 |
| 7617 | 0 |
| 7618 | 0 |
| 7619 | 0 |
| 7620 | 0 |
| 7621 | 0 |
| 7622 | 0 |
| 7623 | 0 |
| 7624 | 0 |
| 7625 | 0 |
| 7626 | 0 |
| 7627 | 0 |
| 7628 | 0 |
| 7629 | 0 |
| 7630 | 0 |
| 7631 | 0 |
| 7632 | 0 |
| 7633 | 0 |
| 7634 | 0 |
| 7635 | 0 |
| 7636 | 0 |
| 7637 | 0 |
| 7638 | 0 |
| 7639 | 0 |
| 7640 | 0 |
| 7641 | 0 |
| 7642 | 0 |
| 7643 | 0 |
| 7644 | 0 |
| 7645 | 0 |
| 7646 | 0 |
| 7647 | 0 |
| 7648 | 0 |
| 7649 | 0 |
| 7650 | 0 |
| 7651 | 0 |
| 7652 | 0 |
| 7653 | 0 |
| 7654 | 0 |
| 7655 | 0 |
| 7656 | 0 |
| 7657 | 0 |
| 7658 | 0 |
| 7659 | 0 |
| 7660 | 0 |
| 7661 | 0 |
| 7662 | 0 |
| 7663 | 0 |
| 7664 | 0 |
| 7665 | 0 |
| 7666 | 0 |
| 7667 | 0 |
| 7668 | 0 |
| 7669 | 0 |
| 7670 | 0 |
| 7671 | 0 |
| 7672 | 0 |
| 7673 | 0 |
| 7674 | 0 |
| 7675 | 0 |
| 7676 | 0 |
| 7677 | 0 |
| 7678 | 0 |
| 7679 | 0 |
| 7680 | 0 |
| 7681 | 0 |
| 7682 | 0 |
| 7683 | 0 |
| 7684 | 0 |
| 7685 | 0 |
| 7686 | 0 |
| 7687 | 0 |
| 7688 | 0 |
| 7689 | 0 |
| 7690 | 0 |
| 7691 | 0 |
| 7692 | 0 |
| 7693 | 0 |
| 7694 | 0 |
| 7695 | 0 |
| 7696 | 0 |
| 7697 | 0 |
| 7698 | 0 |
| 7699 | 0 |
| 7700 | 0 |
| 7701 | 0 |
| 7702 | 0 |
| 7703 | 0 |
| 7704 | 0 |
| 7705 | 0 |
| 7706 | 0 |
| 7707 | 0 |
| 7708 | 0 |
| 7709 | 0 |
| 7710 | 0 |
| 7711 | 0 |
| 7712 | 0 |
| 7713 | 0 |
| 7714 | 0 |
| 7715 | 0 |
| 7716 | 0 |
| 7717 | 0 |
| 7718 | 0 |
| 7719 | 0 |
| 7720 | 0 |
| 7721 | 0 |
| 7722 | 0 |
| 7723 | 0 |
| 7724 | 0 |
| 7725 | 0 |
| 7726 | 0 |
| 7727 | 0 |
| 7728 | 0 |
| 7729 | 0 |
| 7730 | 0 |
| 7731 | 0 |
| 7732 | 0 |
| 7733 | 0 |
| 7734 | 0 |
| 7735 | 0 |
| 7736 | 0 |
| 7737 | 0 |
| 7738 | 0 |
| 7739 | 0 |
| 7740 | 0 |
| 7741 | 0 |
| 7742 | 0 |
| 7743 | 0 |
| 7744 | 0 |
| 7745 | 0 |
| 7746 | 0 |
| 7747 | 0 |
| 7748 | 0 |
| 7749 | 0 |
| 7750 | 0 |
| 7751 | 0 |
| 7752 | 0 |
| 7753 | 0 |
| 7754 | 0 |
| 7755 | 0 |
| 7756 | 0 |
| 7757 | 0 |
| 7758 | 0 |
| 7759 | 0 |
| 7760 | 0 |
| 7761 | 0 |
| 7762 | 0 |
| 7763 | 0 |
| 7764 | 0 |
| 7765 | 0 |
| 7766 | 0 |
| 7767 | 0 |
| 7768 | 0 |
| 7769 | 0 |
| 7770 | 0 |
| 7771 | 0 |
| 7772 | 0 |
| 7773 | 0 |
| 7774 | 0 |
| 7775 | 0 |
| 7776 | 0 |
| 7777 | 0 |
| 7778 | 0 |
| 7779 | 0 |
| 7780 | 0 |
| 7781 | 0 |
| 7782 | 0 |
| 7783 | 0 |
| 7784 | 0 |
| 7785 | 0 |
| 7786 | 0 |
| 7787 | 0 |
| 7788 | 0 |
| 7789 | 0 |
| 7790 | 0 |
| 7791 | 0 |
| 7792 | 0 |
| 7793 | 0 |
| 7794 | 0 |
| 7795 | 0 |
| 7796 | 0 |
| 7797 | 0 |
| 7798 | 0 |
| 7799 | 0 |
| 7800 | 0 |
| 7801 | 0 |
| 7802 | 0 |
| 7803 | 0 |
| 7804 | 0 |
| 7805 | 0 |
| 7806 | 0 |
| 7807 | 0 |
| 7808 | 0 |
| 7809 | 0 |
| 7810 | 0 |
| 7811 | 0 |
| 7812 | 0 |
| 7813 | 0 |
| 7814 | 0 |
| 7815 | 0 |
| 7816 | 0 |
| 7817 | 0 |
| 7818 | 0 |
| 7819 | 0 |
| 7820 | 0 |
| 7821 | 0 |
| 7822 | 0 |
| 7823 | 0 |
| 7824 | 0 |
| 7825 | 0 |
| 7826 | 0 |
| 7827 | 0 |
| 7828 | 0 |
| 7829 | 0 |
| 7830 | 0 |
| 7831 | 0 |
| 7832 | 0 |
| 7833 | 0 |
| 7834 | 0 |
| 7835 | 0 |
| 7836 | 0 |
| 7837 | 0 |
| 7838 | 0 |
| 7839 | 0 |
| 7840 | 0 |
| 7841 | 0 |
| 7842 | 0 |
| 7843 | 0 |
| 7844 | 0 |
| 7845 | 0 |
| 7846 | 0 |
| 7847 | 0 |
| 7848 | 0 |
| 7849 | 0 |
| 7850 | 0 |
| 7851 | 0 |
| 7852 | 0 |
| 7853 | 0 |
| 7854 | 0 |
| 7855 | 0 |
| 7856 | 0 |
| 7857 | 0 |
| 7858 | 0 |
| 7859 | 0 |
| 7860 | 0 |
| 7861 | 0 |
| 7862 | 0 |
| 7863 | 0 |
| 7864 | 0 |
| 7865 | 0 |
| 7866 | 0 |
| 7867 | 0 |
| 7868 | 0 |
| 7869 | 0 |
| 7870 | 0 |
| 7871 | 0 |
| 7872 | 0 |
| 7873 | 0 |
| 7874 | 0 |
| 7875 | 0 |
| 7876 | 0 |
| 7877 | 0 |
| 7878 | 0 |
| 7879 | 0 |
| 7880 | 0 |
| 7881 | 0 |
| 7882 | 0 |
| 7883 | 0 |
| 7884 | 0 |
| 7885 | 0 |
| 7886 | 0 |
| 7887 | 0 |
| 7888 | 0 |
| 7889 | 0 |
| 7890 | 0 |
| 7891 | 0 |
| 7892 | 0 |
| 7893 | 0 |
| 7894 | 0 |
| 7895 | 0 |
| 7896 | 0 |
| 7897 | 0 |
| 7898 | 0 |
| 7899 | 0 |
| 7900 | 0 |
| 7901 | 0 |
| 7902 | 0 |
| 7903 | 0 |
| 7904 | 0 |
| 7905 | 0 |
| 7906 | 0 |
| 7907 | 0 |
| 7908 | 0 |
| 7909 | 0 |
| 7910 | 0 |
| 7911 | 0 |
| 7912 | 0 |
| 7913 | 0 |
| 7914 | 0 |
| 7915 | 0 |
| 7916 | 0 |
| 7917 | 0 |
| 7918 | 0 |
| 7919 | 0 |
| 7920 | 0 |
| 7921 | 0 |
| 7922 | 0 |
| 7923 | 0 |
| 7924 | 0 |
| 7925 | 0 |
| 7926 | 0 |
| 7927 | 0 |
| 7928 | 0 |
| 7929 | 0 |
| 7930 | 0 |
| 7931 | 0 |
| 7932 | 0 |
| 7933 | 0 |
| 7934 | 0 |
| 7935 | 0 |
| 7936 | 0 |
| 7937 | 0 |
| 7938 | 0 |
| 7939 | 0 |
| 7940 | 0 |
| 7941 | 0 |
| 7942 | 0 |
| 7943 | 0 |
| 7944 | 0 |
| 7945 | 0 |
| 7946 | 0 |
| 7947 | 0 |
| 7948 | 0 |
| 7949 | 0 |
| 7950 | 0 |
| 7951 | 0 |
| 7952 | 0 |
| 7953 | 0 |
| 7954 | 0 |
| 7955 | 0 |
| 7956 | 0 |
| 7957 | 0 |
| 7958 | 0 |
| 7959 | 0 |
| 7960 | 0 |
| 7961 | 0 |
| 7962 | 0 |
| 7963 | 0 |
| 7964 | 0 |
| 7965 | 0 |
| 7966 | 0 |
| 7967 | 0 |
| 7968 | 0 |
| 7969 | 0 |
| 7970 | 0 |
| 7971 | 0 |
| 7972 | 0 |
| 7973 | 0 |
| 7974 | 0 |
| 7975 | 0 |
| 7976 | 0 |
| 7977 | 0 |
| 7978 | 0 |
| 7979 | 0 |
| 7980 | 0 |
| 7981 | 0 |
| 7982 | 0 |
| 7983 | 0 |
| 7984 | 0 |
| 7985 | 0 |
| 7986 | 0 |
| 7987 | 0 |
| 7988 | 0 |
| 7989 | 0 |
| 7990 | 0 |
| 7991 | 0 |
| 7992 | 0 |
| 7993 | 0 |
| 7994 | 0 |
| 7995 | 0 |
| 7996 | 0 |
| 7997 | 0 |
| 7998 | 0 |
| 7999 | 0 |
| 8000 | 0 |
| 8001 | 0 |
| 8002 | 0 |
| 8003 | 0 |
| 8004 | 0 |
| 8005 | 0 |
| 8006 | 0 |
| 8007 | 0 |
| 8008 | 0 |
| 8009 | 0 |
| 8010 | 0 |
| 8011 | 0 |
| 8012 | 0 |
| 8013 | 0 |
| 8014 | 0 |
| 8015 | 0 |
| 8016 | 0 |
| 8017 | 0 |
| 8018 | 0 |
| 8019 | 0 |
| 8020 | 0 |
| 8021 | 0 |
| 8022 | 0 |
| 8023 | 0 |
| 8024 | 0 |
| 8025 | 0 |
| 8026 | 0 |
| 8027 | 0 |
| 8028 | 0 |
| 8029 | 0 |
| 8030 | 0 |
| 8031 | 0 |
| 8032 | 0 |
| 8033 | 0 |
| 8034 | 0 |
| 8035 | 0 |
| 8036 | 0 |
| 8037 | 0 |
| 8038 | 0 |
| 8039 | 0 |
| 8040 | 0 |
| 8041 | 0 |
| 8042 | 0 |
| 8043 | 0 |
| 8044 | 0 |
| 8045 | 0 |
| 8046 | 0 |
| 8047 | 0 |
| 8048 | 0 |
| 8049 | 0 |
| 8050 | 0 |
| 8051 | 0 |
| 8052 | 0 |
| 8053 | 0 |
| 8054 | 0 |
| 8055 | 0 |
| 8056 | 0 |
| 8057 | 0 |
| 8058 | 0 |
| 8059 | 0 |
| 8060 | 0 |
| 8061 | 0 |
| 8062 | 0 |
| 8063 | 0 |
| 8064 | 0 |
| 8065 | 0 |
| 8066 | 0 |
| 8067 | 0 |
| 8068 | 0 |
| 8069 | 0 |
| 8070 | 0 |
| 8071 | 0 |
| 8072 | 0 |
| 8073 | 0 |
| 8074 | 0 |
| 8075 | 0 |
| 8076 | 0 |
| 8077 | 0 |
| 8078 | 0 |
| 8079 | 0 |
| 8080 | 0 |
| 8081 | 0 |
| 8082 | 0 |
| 8083 | 0 |
| 8084 | 0 |
| 8085 | 0 |
| 8086 | 0 |
| 8087 | 0 |
| 8088 | 0 |
| 8089 | 0 |
| 8090 | 0 |
| 8091 | 0 |
| 8092 | 0 |
| 8093 | 0 |
| 8094 | 0 |
| 8095 | 0 |
| 8096 | 0 |
| 8097 | 0 |
| 8098 | 0 |
| 8099 | 0 |
| 8100 | 0 |
| 8101 | 0 |
| 8102 | 0 |
| 8103 | 0 |
| 8104 | 0 |
| 8105 | 0 |
| 8106 | 0 |
| 8107 | 0 |
| 8108 | 0 |
| 8109 | 0 |
| 8110 | 0 |
| 8111 | 0 |
| 8112 | 0 |
| 8113 | 0 |
| 8114 | 0 |
| 8115 | 0 |
| 8116 | 0 |
| 8117 | 0 |
| 8118 | 0 |
| 8119 | 0 |
| 8120 | 0 |
| 8121 | 0 |
| 8122 | 0 |
| 8123 | 0 |
| 8124 | 0 |
| 8125 | 0 |
| 8126 | 0 |
| 8127 | 0 |
| 8128 | 0 |
| 8129 | 0 |
| 8130 | 0 |
| 8131 | 0 |
| 8132 | 0 |
| 8133 | 0 |
| 8134 | 0 |
| 8135 | 0 |
| 8136 | 0 |
| 8137 | 0 |
| 8138 | 0 |
| 8139 | 0 |
| 8140 | 0 |
| 8141 | 0 |
| 8142 | 0 |
| 8143 | 0 |
| 8144 | 0 |
| 8145 | 0 |
| 8146 | 0 |
| 8147 | 0 |
| 8148 | 0 |
| 8149 | 0 |
| 8150 | 0 |
| 8151 | 0 |
| 8152 | 0 |
| 8153 | 0 |
| 8154 | 0 |
| 8155 | 0 |
| 8156 | 0 |
| 8157 | 0 |
| 8158 | 0 |
| 8159 | 0 |
| 8160 | 0 |
| 8161 | 0 |
| 8162 | 0 |
| 8163 | 0 |
| 8164 | 0 |
| 8165 | 0 |
| 8166 | 0 |
| 8167 | 0 |
| 8168 | 0 |
| 8169 | 0 |
| 8170 | 0 |
| 8171 | 0 |
| 8172 | 0 |
| 8173 | 0 |
| 8174 | 0 |
| 8175 | 0 |
| 8176 | 0 |
| 8177 | 0 |
| 8178 | 0 |
| 8179 | 0 |
| 8180 | 0 |
| 8181 | 0 |
| 8182 | 0 |
| 8183 | 0 |
| 8184 | 0 |
| 8185 | 0 |
| 8186 | 0 |
| 8187 | 0 |
| 8188 | 0 |
| 8189 | 0 |
| 8190 | 0 |
| 8191 | 0 |
| 8192 | 0 |
| 8193 | 0 |
| 8194 | 0 |
| 8195 | 0 |
| 8196 | 0 |
| 8197 | 0 |
| 8198 | 0 |
| 8199 | 0 |
| 8200 | 0 |
| 8201 | 0 |
| 8202 | 0 |
| 8203 | 0 |
| 8204 | 0 |
| 8205 | 0 |
| 8206 | 0 |
| 8207 | 0 |
| 8208 | 0 |
| 8209 | 0 |
| 8210 | 0 |
| 8211 | 0 |
| 8212 | 0 |
| 8213 | 0 |
| 8214 | 0 |
| 8215 | 0 |
| 8216 | 0 |
| 8217 | 0 |
| 8218 | 0 |
| 8219 | 0 |
| 8220 | 0 |
| 8221 | 0 |
| 8222 | 0 |
| 8223 | 0 |
| 8224 | 0 |
| 8225 | 0 |
| 8226 | 0 |
| 8227 | 0 |
| 8228 | 0 |
| 8229 | 0 |
| 8230 | 0 |
| 8231 | 0 |
| 8232 | 0 |
| 8233 | 0 |
| 8234 | 0 |
| 8235 | 0 |
| 8236 | 0 |
| 8237 | 0 |
| 8238 | 0 |
| 8239 | 0 |
| 8240 | 0 |
| 8241 | 0 |
| 8242 | 0 |
| 8243 | 0 |
| 8244 | 0 |
| 8245 | 0 |
| 8246 | 0 |
| 8247 | 0 |
| 8248 | 0 |
| 8249 | 0 |
| 8250 | 0 |
| 8251 | 0 |
| 8252 | 0 |
| 8253 | 0 |
| 8254 | 0 |
| 8255 | 0 |
| 8256 | 0 |
| 8257 | 0 |
| 8258 | 0 |
| 8259 | 0 |
| 8260 | 0 |
| 8261 | 0 |
| 8262 | 0 |
| 8263 | 0 |
| 8264 | 0 |
| 8265 | 0 |
| 8266 | 0 |
| 8267 | 0 |
| 8268 | 0 |
| 8269 | 0 |
| 8270 | 0 |
| 8271 | 0 |
| 8272 | 0 |
| 8273 | 0 |
| 8274 | 0 |
| 8275 | 0 |
| 8276 | 0 |
| 8277 | 0 |
| 8278 | 0 |
| 8279 | 0 |
| 8280 | 0 |
| 8281 | 0 |
| 8282 | 0 |
| 8283 | 0 |
| 8284 | 0 |
| 8285 | 0 |
| 8286 | 0 |
| 8287 | 0 |
| 8288 | 0 |
| 8289 | 0 |
| 8290 | 0 |
| 8291 | 0 |
| 8292 | 0 |
| 8293 | 0 |
| 8294 | 0 |
| 8295 | 0 |
| 8296 | 0 |
| 8297 | 0 |
| 8298 | 0 |
| 8299 | 0 |
| 8300 | 0 |
| 8301 | 0 |
| 8302 | 0 |
| 8303 | 0 |
| 8304 | 0 |
| 8305 | 0 |
| 8306 | 0 |
| 8307 | 0 |
| 8308 | 0 |
| 8309 | 0 |
| 8310 | 0 |
| 8311 | 0 |
| 8312 | 0 |
| 8313 | 0 |
| 8314 | 0 |
| 8315 | 0 |
| 8316 | 0 |
| 8317 | 0 |
| 8318 | 0 |
| 8319 | 0 |
| 8320 | 0 |
| 8321 | 0 |
| 8322 | 0 |
| 8323 | 0 |
| 8324 | 0 |
| 8325 | 0 |
| 8326 | 0 |
| 8327 | 0 |
| 8328 | 0 |
| 8329 | 0 |
| 8330 | 0 |
| 8331 | 0 |
| 8332 | 0 |
| 8333 | 0 |
| 8334 | 0 |
| 8335 | 0 |
| 8336 | 0 |
| 8337 | 0 |
| 8338 | 0 |
| 8339 | 0 |
| 8340 | 0 |
| 8341 | 0 |
| 8342 | 0 |
| 8343 | 0 |
| 8344 | 0 |
| 8345 | 0 |
| 8346 | 0 |
| 8347 | 0 |
| 8348 | 0 |
| 8349 | 0 |
| 8350 | 0 |
| 8351 | 0 |
| 8352 | 0 |
| 8353 | 0 |
| 8354 | 0 |
| 8355 | 0 |
| 8356 | 0 |
| 8357 | 0 |
| 8358 | 0 |
| 8359 | 0 |
| 8360 | 0 |
| 8361 | 0 |
| 8362 | 0 |
| 8363 | 0 |
| 8364 | 0 |
| 8365 | 0 |
| 8366 | 0 |
| 8367 | 0 |
| 8368 | 0 |
| 8369 | 0 |
| 8370 | 0 |
| 8371 | 0 |
| 8372 | 0 |
| 8373 | 0 |
| 8374 | 0 |
| 8375 | 0 |
| 8376 | 0 |
| 8377 | 0 |
| 8378 | 0 |
| 8379 | 0 |
| 8380 | 0 |
| 8381 | 0 |
| 8382 | 0 |
| 8383 | 0 |
| 8384 | 0 |
| 8385 | 0 |
| 8386 | 0 |
| 8387 | 0 |
| 8388 | 0 |
| 8389 | 0 |
| 8390 | 0 |
| 8391 | 0 |
| 8392 | 0 |
| 8393 | 0 |
| 8394 | 0 |
| 8395 | 0 |
| 8396 | 0 |
| 8397 | 0 |
| 8398 | 0 |
| 8399 | 0 |
| 8400 | 0 |
| 8401 | 0 |
| 8402 | 0 |
| 8403 | 0 |
| 8404 | 0 |
| 8405 | 0 |
| 8406 | 0 |
| 8407 | 0 |
| 8408 | 0 |
| 8409 | 0 |
| 8410 | 0 |
| 8411 | 0 |
| 8412 | 0 |
| 8413 | 0 |
| 8414 | 0 |
| 8415 | 0 |
| 8416 | 0 |
| 8417 | 0 |
| 8418 | 0 |
| 8419 | 0 |
| 8420 | 0 |
| 8421 | 0 |
| 8422 | 0 |
| 8423 | 0 |
| 8424 | 0 |
| 8425 | 0 |
| 8426 | 0 |
| 8427 | 0 |
| 8428 | 0 |
| 8429 | 0 |
| 8430 | 0 |
| 8431 | 0 |
| 8432 | 0 |
| 8433 | 0 |
| 8434 | 0 |
| 8435 | 0 |
| 8436 | 0 |
| 8437 | 0 |
| 8438 | 0 |
| 8439 | 0 |
| 8440 | 0 |
| 8441 | 0 |
| 8442 | 0 |
| 8443 | 0 |
| 8444 | 0 |
| 8445 | 0 |
| 8446 | 0 |
| 8447 | 0 |
| 8448 | 0 |
| 8449 | 0 |
| 8450 | 0 |
| 8451 | 0 |
| 8452 | 0 |
| 8453 | 0 |
| 8454 | 0 |
| 8455 | 0 |
| 8456 | 0 |
| 8457 | 0 |
| 8458 | 0 |
| 8459 | 0 |
| 8460 | 0 |
| 8461 | 0 |
| 8462 | 0 |
| 8463 | 0 |
| 8464 | 0 |
| 8465 | 0 |
| 8466 | 0 |
| 8467 | 0 |
| 8468 | 0 |
| 8469 | 0 |
| 8470 | 0 |
| 8471 | 0 |
| 8472 | 0 |
| 8473 | 0 |
| 8474 | 0 |
| 8475 | 0 |
| 8476 | 0 |
| 8477 | 0 |
| 8478 | 0 |
| 8479 | 0 |
| 8480 | 0 |
| 8481 | 0 |
| 8482 | 0 |
| 8483 | 0 |
| 8484 | 0 |
| 8485 | 0 |
| 8486 | 0 |
| 8487 | 0 |
| 8488 | 0 |
| 8489 | 0 |
| 8490 | 0 |
| 8491 | 0 |
| 8492 | 0 |
| 8493 | 0 |
| 8494 | 0 |
| 8495 | 0 |
| 8496 | 0 |
| 8497 | 0 |
| 8498 | 0 |
| 8499 | 0 |
| 8500 | 0 |
| 8501 | 0 |
| 8502 | 0 |
| 8503 | 0 |
| 8504 | 0 |
| 8505 | 0 |
| 8506 | 0 |
| 8507 | 0 |
| 8508 | 0 |
| 8509 | 0 |
| 8510 | 0 |
| 8511 | 0 |
| 8512 | 0 |
| 8513 | 0 |
| 8514 | 0 |
| 8515 | 0 |
| 8516 | 0 |
| 8517 | 0 |
| 8518 | 0 |
| 8519 | 0 |
| 8520 | 0 |
| 8521 | 0 |
| 8522 | 0 |
| 8523 | 0 |
| 8524 | 0 |
| 8525 | 0 |
| 8526 | 0 |
| 8527 | 0 |
| 8528 | 0 |
| 8529 | 0 |
| 8530 | 0 |
| 8531 | 0 |
| 8532 | 0 |
| 8533 | 0 |
| 8534 | 0 |
| 8535 | 0 |
| 8536 | 0 |
| 8537 | 0 |
| 8538 | 0 |
| 8539 | 0 |
| 8540 | 0 |
| 8541 | 0 |
| 8542 | 0 |
| 8543 | 0 |
| 8544 | 0 |
| 8545 | 0 |
| 8546 | 0 |
| 8547 | 0 |
| 8548 | 0 |
| 8549 | 0 |
| 8550 | 0 |
| 8551 | 0 |
| 8552 | 0 |
| 8553 | 0 |
| 8554 | 0 |
| 8555 | 0 |
| 8556 | 0 |
| 8557 | 0 |
| 8558 | 0 |
| 8559 | 0 |
| 8560 | 0 |
| 8561 | 0 |
| 8562 | 0 |
| 8563 | 0 |
| 8564 | 0 |
| 8565 | 0 |
| 8566 | 0 |
| 8567 | 0 |
| 8568 | 0 |
| 8569 | 0 |
| 8570 | 0 |
| 8571 | 0 |
| 8572 | 0 |
| 8573 | 0 |
| 8574 | 0 |
| 8575 | 0 |
| 8576 | 0 |
| 8577 | 0 |
| 8578 | 0 |
| 8579 | 0 |
| 8580 | 0 |
| 8581 | 0 |
| 8582 | 0 |
| 8583 | 0 |
| 8584 | 0 |
| 8585 | 0 |
| 8586 | 0 |
| 8587 | 0 |
| 8588 | 0 |
| 8589 | 0 |
| 8590 | 0 |
| 8591 | 0 |
| 8592 | 0 |
| 8593 | 0 |
| 8594 | 0 |
| 8595 | 0 |
| 8596 | 0 |
| 8597 | 0 |
| 8598 | 0 |
| 8599 | 0 |
| 8600 | 0 |
| 8601 | 0 |
| 8602 | 0 |
| 8603 | 0 |
| 8604 | 0 |
| 8605 | 0 |
| 8606 | 0 |
| 8607 | 0 |
| 8608 | 0 |
| 8609 | 0 |
| 8610 | 0 |
| 8611 | 0 |
| 8612 | 0 |
| 8613 | 0 |
| 8614 | 0 |
| 8615 | 0 |
| 8616 | 0 |
| 8617 | 0 |
| 8618 | 0 |
| 8619 | 0 |
| 8620 | 0 |
| 8621 | 0 |
| 8622 | 0 |
| 8623 | 0 |
| 8624 | 0 |
| 8625 | 0 |
| 8626 | 0 |
| 8627 | 0 |
| 8628 | 0 |
| 8629 | 0 |
| 8630 | 0 |
| 8631 | 0 |
| 8632 | 0 |
| 8633 | 0 |
| 8634 | 0 |
| 8635 | 0 |
| 8636 | 0 |
| 8637 | 0 |
| 8638 | 0 |
| 8639 | 0 |
| 8640 | 0 |
| 8641 | 0 |
| 8642 | 0 |
| 8643 | 0 |
| 8644 | 0 |
| 8645 | 0 |
| 8646 | 0 |
| 8647 | 0 |
| 8648 | 0 |
| 8649 | 0 |
| 8650 | 0 |
| 8651 | 0 |
| 8652 | 0 |
| 8653 | 0 |
| 8654 | 0 |
| 8655 | 0 |
| 8656 | 0 |
| 8657 | 0 |
| 8658 | 0 |
| 8659 | 0 |
| 8660 | 0 |
| 8661 | 0 |
| 8662 | 0 |
| 8663 | 0 |
| 8664 | 0 |
| 8665 | 0 |
| 8666 | 0 |
| 8667 | 0 |
| 8668 | 0 |
| 8669 | 0 |
| 8670 | 0 |
| 8671 | 0 |
| 8672 | 0 |
| 8673 | 0 |
| 8674 | 0 |
| 8675 | 0 |
| 8676 | 0 |
| 8677 | 0 |
| 8678 | 0 |
| 8679 | 0 |
| 8680 | 0 |
| 8681 | 0 |
| 8682 | 0 |
| 8683 | 0 |
| 8684 | 0 |
| 8685 | 0 |
| 8686 | 0 |
| 8687 | 0 |
| 8688 | 0 |
| 8689 | 0 |
| 8690 | 0 |
| 8691 | 0 |
| 8692 | 0 |
| 8693 | 0 |
| 8694 | 0 |
| 8695 | 0 |
| 8696 | 0 |
| 8697 | 0 |
| 8698 | 0 |
| 8699 | 0 |
| 8700 | 0 |
| 8701 | 0 |
| 8702 | 0 |
| 8703 | 0 |
| 8704 | 0 |
| 8705 | 0 |
| 8706 | 0 |
| 8707 | 0 |
| 8708 | 0 |
| 8709 | 0 |
| 8710 | 0 |
| 8711 | 0 |
| 8712 | 0 |
| 8713 | 0 |
| 8714 | 0 |
| 8715 | 0 |
| 8716 | 0 |
| 8717 | 0 |
| 8718 | 0 |
| 8719 | 0 |
| 8720 | 0 |
| 8721 | 0 |
| 8722 | 0 |
| 8723 | 0 |
| 8724 | 0 |
| 8725 | 0 |
| 8726 | 0 |
| 8727 | 0 |
| 8728 | 0 |
| 8729 | 0 |
| 8730 | 0 |
| 8731 | 0 |
| 8732 | 0 |
| 8733 | 0 |
| 8734 | 0 |
| 8735 | 0 |
| 8736 | 0 |
| 8737 | 0 |
| 8738 | 0 |
| 8739 | 0 |
| 8740 | 0 |
| 8741 | 0 |
| 8742 | 0 |
| 8743 | 0 |
| 8744 | 0 |
| 8745 | 0 |
| 8746 | 0 |
| 8747 | 0 |
| 8748 | 0 |
| 8749 | 0 |
| 8750 | 0 |
| 8751 | 0 |
| 8752 | 0 |
| 8753 | 0 |
| 8754 | 0 |
| 8755 | 0 |
| 8756 | 0 |
| 8757 | 0 |
| 8758 | 0 |
| 8759 | 0 |
| 8760 | 0 |
| 8761 | 0 |
| 8762 | 0 |
| 8763 | 0 |
| 8764 | 0 |
| 8765 | 0 |
| 8766 | 0 |
| 8767 | 0 |
| 8768 | 0 |
| 8769 | 0 |
| 8770 | 0 |
| 8771 | 0 |
| 8772 | 0 |
| 8773 | 0 |
| 8774 | 0 |
| 8775 | 0 |
| 8776 | 0 |
| 8777 | 0 |
| 8778 | 0 |
| 8779 | 0 |
| 8780 | 0 |
| 8781 | 0 |
| 8782 | 0 |
| 8783 | 0 |
| 8784 | 0 |
| 8785 | 0 |
| 8786 | 0 |
| 8787 | 0 |
| 8788 | 0 |
| 8789 | 0 |
| 8790 | 0 |
| 8791 | 0 |
| 8792 | 0 |
| 8793 | 0 |
| 8794 | 0 |
| 8795 | 0 |
| 8796 | 0 |
| 8797 | 0 |
| 8798 | 0 |
| 8799 | 0 |
| 8800 | 0 |
| 8801 | 0 |
| 8802 | 0 |
| 8803 | 0 |
| 8804 | 0 |
| 8805 | 0 |
| 8806 | 0 |
| 8807 | 0 |
| 8808 | 0 |
| 8809 | 0 |
| 8810 | 0 |
| 8811 | 0 |
| 8812 | 0 |
| 8813 | 0 |
| 8814 | 0 |
| 8815 | 0 |
| 8816 | 0 |
| 8817 | 0 |
| 8818 | 0 |
| 8819 | 0 |
| 8820 | 0 |
| 8821 | 0 |
| 8822 | 0 |
| 8823 | 0 |
| 8824 | 0 |
| 8825 | 0 |
| 8826 | 0 |
| 8827 | 0 |
| 8828 | 0 |
| 8829 | 0 |
| 8830 | 0 |
| 8831 | 0 |
| 8832 | 0 |
| 8833 | 0 |
| 8834 | 0 |
| 8835 | 0 |
| 8836 | 0 |
| 8837 | 0 |
| 8838 | 0 |
| 8839 | 0 |
| 8840 | 0 |
| 8841 | 0 |
| 8842 | 0 |
| 8843 | 0 |
| 8844 | 0 |
| 8845 | 0 |
| 8846 | 0 |
| 8847 | 0 |
| 8848 | 0 |
| 8849 | 0 |
| 8850 | 0 |
| 8851 | 0 |
| 8852 | 0 |
| 8853 | 0 |
| 8854 | 0 |
| 8855 | 0 |
| 8856 | 0 |
| 8857 | 0 |
| 8858 | 0 |
| 8859 | 0 |
| 8860 | 0 |
| 8861 | 0 |
| 8862 | 0 |
| 8863 | 0 |
| 8864 | 0 |
| 8865 | 0 |
| 8866 | 0 |
| 8867 | 0 |
| 8868 | 0 |
| 8869 | 0 |
| 8870 | 0 |
| 8871 | 0 |
| 8872 | 0 |
| 8873 | 0 |
| 8874 | 0 |
| 8875 | 0 |
| 8876 | 0 |
| 8877 | 0 |
| 8878 | 0 |
| 8879 | 0 |
| 8880 | 0 |
| 8881 | 0 |
| 8882 | 0 |
| 8883 | 0 |
| 8884 | 0 |
| 8885 | 0 |
| 8886 | 0 |
| 8887 | 0 |
| 8888 | 0 |
| 8889 | 0 |
| 8890 | 0 |
| 8891 | 0 |
| 8892 | 0 |
| 8893 | 0 |
| 8894 | 0 |
| 8895 | 0 |
| 8896 | 0 |
| 8897 | 0 |
| 8898 | 0 |
| 8899 | 0 |
| 8900 | 0 |
| 8901 | 0 |
| 8902 | 0 |
| 8903 | 0 |
| 8904 | 0 |
| 8905 | 0 |
| 8906 | 0 |
| 8907 | 0 |
| 8908 | 0 |
| 8909 | 0 |
| 8910 | 0 |
| 8911 | 0 |
| 8912 | 0 |
| 8913 | 0 |
| 8914 | 0 |
| 8915 | 0 |
| 8916 | 0 |
| 8917 | 0 |
| 8918 | 0 |
| 8919 | 0 |
| 8920 | 0 |
| 8921 | 0 |
| 8922 | 0 |
| 8923 | 0 |
| 8924 | 0 |
| 8925 | 0 |
| 8926 | 0 |
| 8927 | 0 |
| 8928 | 0 |
| 8929 | 0 |
| 8930 | 0 |
| 8931 | 0 |
| 8932 | 0 |
| 8933 | 0 |
| 8934 | 0 |
| 8935 | 0 |
| 8936 | 0 |
| 8937 | 0 |
| 8938 | 0 |
| 8939 | 0 |
| 8940 | 0 |
| 8941 | 0 |
| 8942 | 0 |
| 8943 | 0 |
| 8944 | 0 |
| 8945 | 0 |
| 8946 | 0 |
| 8947 | 0 |
| 8948 | 0 |
| 8949 | 0 |
| 8950 | 0 |
| 8951 | 0 |
| 8952 | 0 |
| 8953 | 0 |
| 8954 | 0 |
| 8955 | 0 |
| 8956 | 0 |
| 8957 | 0 |
| 8958 | 0 |
| 8959 | 0 |
| 8960 | 0 |
| 8961 | 0 |
| 8962 | 0 |
| 8963 | 0 |
| 8964 | 0 |
| 8965 | 0 |
| 8966 | 0 |
| 8967 | 0 |
| 8968 | 0 |
| 8969 | 0 |
| 8970 | 0 |
| 8971 | 0 |
| 8972 | 0 |
| 8973 | 0 |
| 8974 | 0 |
| 8975 | 0 |
| 8976 | 0 |
| 8977 | 0 |
| 8978 | 0 |
| 8979 | 0 |
| 8980 | 0 |
| 8981 | 0 |
| 8982 | 0 |
| 8983 | 0 |
| 8984 | 0 |
| 8985 | 0 |
| 8986 | 0 |
| 8987 | 0 |
| 8988 | 0 |
| 8989 | 0 |
| 8990 | 0 |
| 8991 | 0 |
| 8992 | 0 |
| 8993 | 0 |
| 8994 | 0 |
| 8995 | 0 |
| 8996 | 0 |
| 8997 | 0 |
| 8998 | 0 |
| 8999 | 0 |
| 9000 | 0 |
| 9001 | 0 |
| 9002 | 0 |
| 9003 | 0 |
| 9004 | 0 |
| 9005 | 0 |
| 9006 | 0 |
| 9007 | 0 |
| 9008 | 0 |
| 9009 | 0 |
| 9010 | 0 |
| 9011 | 0 |
| 9012 | 0 |
| 9013 | 0 |
| 9014 | 0 |
| 9015 | 0 |
| 9016 | 0 |
| 9017 | 0 |
| 9018 | 0 |
| 9019 | 0 |
| 9020 | 0 |
| 9021 | 0 |
| 9022 | 0 |
| 9023 | 0 |
| 9024 | 0 |
| 9025 | 0 |
| 9026 | 0 |
| 9027 | 0 |
| 9028 | 0 |
| 9029 | 0 |
| 9030 | 0 |
| 9031 | 0 |
| 9032 | 0 |
| 9033 | 0 |
| 9034 | 0 |
| 9035 | 0 |
| 9036 | 0 |
| 9037 | 0 |
| 9038 | 0 |
| 9039 | 0 |
| 9040 | 0 |
| 9041 | 0 |
| 9042 | 0 |
| 9043 | 0 |
| 9044 | 0 |
| 9045 | 0 |
| 9046 | 0 |
| 9047 | 0 |
| 9048 | 0 |
| 9049 | 0 |
| 9050 | 0 |
| 9051 | 0 |
| 9052 | 0 |
| 9053 | 0 |
| 9054 | 0 |
| 9055 | 0 |
| 9056 | 0 |
| 9057 | 0 |
| 9058 | 0 |
| 9059 | 0 |
| 9060 | 0 |
| 9061 | 0 |
| 9062 | 0 |
| 9063 | 0 |
| 9064 | 0 |
| 9065 | 0 |
| 9066 | 0 |
| 9067 | 0 |
| 9068 | 0 |
| 9069 | 0 |
| 9070 | 0 |
| 9071 | 0 |
| 9072 | 0 |
| 9073 | 0 |
| 9074 | 0 |
| 9075 | 0 |
| 9076 | 0 |
| 9077 | 0 |
| 9078 | 0 |
| 9079 | 0 |
| 9080 | 0 |
| 9081 | 0 |
| 9082 | 0 |
| 9083 | 0 |
| 9084 | 0 |
| 9085 | 0 |
| 9086 | 0 |
| 9087 | 0 |
| 9088 | 0 |
| 9089 | 0 |
| 9090 | 0 |
| 9091 | 0 |
| 9092 | 0 |
| 9093 | 0 |
| 9094 | 0 |
| 9095 | 0 |
| 9096 | 0 |
| 9097 | 0 |
| 9098 | 0 |
| 9099 | 0 |
| 9100 | 0 |
| 9101 | 0 |
| 9102 | 0 |
| 9103 | 0 |
| 9104 | 0 |
| 9105 | 0 |
| 9106 | 0 |
| 9107 | 0 |
| 9108 | 0 |
| 9109 | 0 |
| 9110 | 0 |
| 9111 | 0 |
| 9112 | 0 |
| 9113 | 0 |
| 9114 | 0 |
| 9115 | 0 |
| 9116 | 0 |
| 9117 | 0 |
| 9118 | 0 |
| 9119 | 0 |
| 9120 | 0 |
| 9121 | 0 |
| 9122 | 0 |
| 9123 | 0 |
| 9124 | 0 |
| 9125 | 0 |
| 9126 | 0 |
| 9127 | 0 |
| 9128 | 0 |
| 9129 | 0 |
| 9130 | 0 |
| 9131 | 0 |
| 9132 | 0 |
| 9133 | 0 |
| 9134 | 0 |
| 9135 | 0 |
| 9136 | 0 |
| 9137 | 0 |
| 9138 | 0 |
| 9139 | 0 |
| 9140 | 0 |
| 9141 | 0 |
| 9142 | 0 |
| 9143 | 0 |
| 9144 | 0 |
| 9145 | 0 |
| 9146 | 0 |
| 9147 | 0 |
| 9148 | 0 |
| 9149 | 0 |
| 9150 | 0 |
| 9151 | 0 |
| 9152 | 0 |
| 9153 | 0 |
| 9154 | 0 |
| 9155 | 0 |
| 9156 | 0 |
| 9157 | 0 |
| 9158 | 0 |
| 9159 | 0 |
| 9160 | 0 |
| 9161 | 0 |
| 9162 | 0 |
| 9163 | 0 |
| 9164 | 0 |
| 9165 | 0 |
| 9166 | 0 |
| 9167 | 0 |
| 9168 | 0 |
| 9169 | 0 |
| 9170 | 0 |
| 9171 | 0 |
| 9172 | 0 |
| 9173 | 0 |
| 9174 | 0 |
| 9175 | 0 |
| 9176 | 0 |
| 9177 | 0 |
| 9178 | 0 |
| 9179 | 0 |
| 9180 | 0 |
| 9181 | 0 |
| 9182 | 0 |
| 9183 | 0 |
| 9184 | 0 |
| 9185 | 0 |
| 9186 | 0 |
| 9187 | 0 |
| 9188 | 0 |
| 9189 | 0 |
| 9190 | 0 |
| 9191 | 0 |
| 9192 | 0 |
| 9193 | 0 |
| 9194 | 0 |
| 9195 | 0 |
| 9196 | 0 |
| 9197 | 0 |
| 9198 | 0 |
| 9199 | 0 |
| 9200 | 0 |
| 9201 | 0 |
| 9202 | 0 |
| 9203 | 0 |
| 9204 | 0 |
| 9205 | 0 |
| 9206 | 0 |
| 9207 | 0 |
| 9208 | 0 |
| 9209 | 0 |
| 9210 | 0 |
| 9211 | 0 |
| 9212 | 0 |
| 9213 | 0 |
| 9214 | 0 |
| 9215 | 0 |
| 9216 | 0 |
| 9217 | 0 |
| 9218 | 0 |
| 9219 | 0 |
| 9220 | 0 |
| 9221 | 0 |
| 9222 | 0 |
| 9223 | 0 |
| 9224 | 0 |
| 9225 | 0 |
| 9226 | 0 |
| 9227 | 0 |
| 9228 | 0 |
| 9229 | 0 |
| 9230 | 0 |
| 9231 | 0 |
| 9232 | 0 |
| 9233 | 0 |
| 9234 | 0 |
| 9235 | 0 |
| 9236 | 0 |
| 9237 | 0 |
| 9238 | 0 |
| 9239 | 0 |
| 9240 | 0 |
| 9241 | 0 |
| 9242 | 0 |
| 9243 | 0 |
| 9244 | 0 |
| 9245 | 0 |
| 9246 | 0 |
| 9247 | 0 |
| 9248 | 0 |
| 9249 | 0 |
| 9250 | 0 |
| 9251 | 0 |
| 9252 | 0 |
| 9253 | 0 |
| 9254 | 0 |
| 9255 | 0 |
| 9256 | 0 |
| 9257 | 0 |
| 9258 | 0 |
| 9259 | 0 |
| 9260 | 0 |
| 9261 | 0 |
| 9262 | 0 |
| 9263 | 0 |
| 9264 | 0 |
| 9265 | 0 |
| 9266 | 0 |
| 9267 | 0 |
| 9268 | 0 |
| 9269 | 0 |
| 9270 | 0 |
| 9271 | 0 |
| 9272 | 0 |
| 9273 | 0 |
| 9274 | 0 |
| 9275 | 0 |
| 9276 | 0 |
| 9277 | 0 |
| 9278 | 0 |
| 9279 | 0 |
| 9280 | 0 |
| 9281 | 0 |
| 9282 | 0 |
| 9283 | 0 |
| 9284 | 0 |
| 9285 | 0 |
| 9286 | 0 |
| 9287 | 0 |
| 9288 | 0 |
| 9289 | 0 |
| 9290 | 0 |
| 9291 | 0 |
| 9292 | 0 |
| 9293 | 0 |
| 9294 | 0 |
| 9295 | 0 |
| 9296 | 0 |
| 9297 | 0 |
| 9298 | 0 |
| 9299 | 0 |
| 9300 | 0 |
| 9301 | 0 |
| 9302 | 0 |
| 9303 | 0 |
| 9304 | 0 |
| 9305 | 0 |
| 9306 | 0 |
| 9307 | 0 |
| 9308 | 0 |
| 9309 | 0 |
| 9310 | 0 |
| 9311 | 0 |
| 9312 | 0 |
| 9313 | 0 |
| 9314 | 0 |
| 9315 | 0 |
| 9316 | 0 |
| 9317 | 0 |
| 9318 | 0 |
| 9319 | 0 |
| 9320 | 0 |
| 9321 | 0 |
| 9322 | 0 |
| 9323 | 0 |
| 9324 | 0 |
| 9325 | 0 |
| 9326 | 0 |
| 9327 | 0 |
| 9328 | 0 |
| 9329 | 0 |
| 9330 | 0 |
| 9331 | 0 |
| 9332 | 0 |
| 9333 | 0 |
| 9334 | 0 |
| 9335 | 0 |
| 9336 | 0 |
| 9337 | 0 |
| 9338 | 0 |
| 9339 | 0 |
| 9340 | 0 |
| 9341 | 0 |
| 9342 | 0 |
| 9343 | 0 |
| 9344 | 0 |
| 9345 | 0 |
| 9346 | 0 |
| 9347 | 0 |
| 9348 | 0 |
| 9349 | 0 |
| 9350 | 0 |
| 9351 | 0 |
| 9352 | 0 |
| 9353 | 0 |
| 9354 | 0 |
| 9355 | 0 |
| 9356 | 0 |
| 9357 | 0 |
| 9358 | 0 |
| 9359 | 0 |
| 9360 | 0 |
| 9361 | 0 |
| 9362 | 0 |
| 9363 | 0 |
| 9364 | 0 |
| 9365 | 0 |
| 9366 | 0 |
| 9367 | 0 |
| 9368 | 0 |
| 9369 | 0 |
| 9370 | 0 |
| 9371 | 0 |
| 9372 | 0 |
| 9373 | 0 |
| 9374 | 0 |
| 9375 | 0 |
| 9376 | 0 |
| 9377 | 0 |
| 9378 | 0 |
| 9379 | 0 |
| 9380 | 0 |
| 9381 | 0 |
| 9382 | 0 |
| 9383 | 0 |
| 9384 | 0 |
| 9385 | 0 |
| 9386 | 0 |
| 9387 | 0 |
| 9388 | 0 |
| 9389 | 0 |
| 9390 | 0 |
| 9391 | 0 |
| 9392 | 0 |
| 9393 | 0 |
| 9394 | 0 |
| 9395 | 0 |
| 9396 | 0 |
| 9397 | 0 |
| 9398 | 0 |
| 9399 | 0 |
| 9400 | 0 |
| 9401 | 0 |
| 9402 | 0 |
| 9403 | 0 |
| 9404 | 0 |
| 9405 | 0 |
| 9406 | 0 |
| 9407 | 0 |
| 9408 | 0 |
| 9409 | 0 |
| 9410 | 0 |
| 9411 | 0 |
| 9412 | 0 |
| 9413 | 0 |
| 9414 | 0 |
| 9415 | 0 |
| 9416 | 0 |
| 9417 | 0 |
| 9418 | 0 |
| 9419 | 0 |
| 9420 | 0 |
| 9421 | 0 |
| 9422 | 0 |
| 9423 | 0 |
| 9424 | 0 |
| 9425 | 0 |
| 9426 | 0 |
| 9427 | 0 |
| 9428 | 0 |
| 9429 | 0 |
| 9430 | 0 |
| 9431 | 0 |
| 9432 | 0 |
| 9433 | 0 |
| 9434 | 0 |
| 9435 | 0 |
| 9436 | 0 |
| 9437 | 0 |
| 9438 | 0 |
| 9439 | 0 |
| 9440 | 0 |
| 9441 | 0 |
| 9442 | 0 |
| 9443 | 0 |
| 9444 | 0 |
| 9445 | 0 |
| 9446 | 0 |
| 9447 | 0 |
| 9448 | 0 |
| 9449 | 0 |
| 9450 | 0 |
| 9451 | 0 |
| 9452 | 0 |
| 9453 | 0 |
| 9454 | 0 |
| 9455 | 0 |
| 9456 | 0 |
| 9457 | 0 |
| 9458 | 0 |
| 9459 | 0 |
| 9460 | 0 |
| 9461 | 0 |
| 9462 | 0 |
| 9463 | 0 |
| 9464 | 0 |
| 9465 | 0 |
| 9466 | 0 |
| 9467 | 0 |
| 9468 | 0 |
| 9469 | 0 |
| 9470 | 0 |
| 9471 | 0 |
| 9472 | 0 |
| 9473 | 0 |
| 9474 | 0 |
| 9475 | 0 |
| 9476 | 0 |
| 9477 | 0 |
| 9478 | 0 |
| 9479 | 0 |
| 9480 | 0 |
| 9481 | 0 |
| 9482 | 0 |
| 9483 | 0 |
| 9484 | 0 |
| 9485 | 0 |
| 9486 | 0 |
| 9487 | 0 |
| 9488 | 0 |
| 9489 | 0 |
| 9490 | 0 |
| 9491 | 0 |
| 9492 | 0 |
| 9493 | 0 |
| 9494 | 0 |
| 9495 | 0 |
| 9496 | 0 |
| 9497 | 0 |
| 9498 | 0 |
| 9499 | 0 |
| 9500 | 0 |
| 9501 | 0 |
| 9502 | 0 |
| 9503 | 0 |
| 9504 | 0 |
| 9505 | 0 |
| 9506 | 0 |
| 9507 | 0 |
| 9508 | 0 |
| 9509 | 0 |
| 9510 | 0 |
| 9511 | 0 |
| 9512 | 0 |
| 9513 | 0 |
| 9514 | 0 |
| 9515 | 0 |
| 9516 | 0 |
| 9517 | 0 |
| 9518 | 0 |
| 9519 | 0 |
| 9520 | 0 |
| 9521 | 0 |
| 9522 | 0 |
| 9523 | 0 |
| 9524 | 0 |
| 9525 | 0 |
| 9526 | 0 |
| 9527 | 0 |
| 9528 | 0 |
| 9529 | 0 |
| 9530 | 0 |
| 9531 | 0 |
| 9532 | 0 |
| 9533 | 0 |
| 9534 | 0 |
| 9535 | 0 |
| 9536 | 0 |
| 9537 | 0 |
| 9538 | 0 |
| 9539 | 0 |
| 9540 | 0 |
| 9541 | 0 |
| 9542 | 0 |
| 9543 | 0 |
| 9544 | 0 |
| 9545 | 0 |
| 9546 | 0 |
| 9547 | 0 |
| 9548 | 0 |
| 9549 | 0 |
| 9550 | 0 |
| 9551 | 0 |
| 9552 | 0 |
| 9553 | 0 |
| 9554 | 0 |
| 9555 | 0 |
| 9556 | 0 |
| 9557 | 0 |
| 9558 | 0 |
| 9559 | 0 |
| 9560 | 0 |
| 9561 | 0 |
| 9562 | 0 |
| 9563 | 0 |
| 9564 | 0 |
| 9565 | 0 |
| 9566 | 0 |
| 9567 | 0 |
| 9568 | 0 |
| 9569 | 0 |
| 9570 | 0 |
| 9571 | 0 |
| 9572 | 0 |
| 9573 | 0 |
| 9574 | 0 |
| 9575 | 0 |
| 9576 | 0 |
| 9577 | 0 |
| 9578 | 0 |
| 9579 | 0 |
| 9580 | 0 |
| 9581 | 0 |
| 9582 | 0 |
| 9583 | 0 |
| 9584 | 0 |
| 9585 | 0 |
| 9586 | 0 |
| 9587 | 0 |
| 9588 | 0 |
| 9589 | 0 |
| 9590 | 0 |
| 9591 | 0 |
| 9592 | 0 |
| 9593 | 0 |
| 9594 | 0 |
| 9595 | 0 |
| 9596 | 0 |
| 9597 | 0 |
| 9598 | 0 |
| 9599 | 0 |
| 9600 | 0 |
| 9601 | 0 |
| 9602 | 0 |
| 9603 | 0 |
| 9604 | 0 |
| 9605 | 0 |
| 9606 | 0 |
| 9607 | 0 |
| 9608 | 0 |
| 9609 | 0 |
| 9610 | 0 |
| 9611 | 0 |
| 9612 | 0 |
| 9613 | 0 |
| 9614 | 0 |
| 9615 | 0 |
| 9616 | 0 |
| 9617 | 0 |
| 9618 | 0 |
| 9619 | 0 |
| 9620 | 0 |
| 9621 | 0 |
| 9622 | 0 |
| 9623 | 0 |
| 9624 | 0 |
| 9625 | 0 |
| 9626 | 0 |
| 9627 | 0 |
| 9628 | 0 |
| 9629 | 0 |
| 9630 | 0 |
| 9631 | 0 |
| 9632 | 0 |
| 9633 | 0 |
| 9634 | 0 |
| 9635 | 0 |
| 9636 | 0 |
| 9637 | 0 |
| 9638 | 0 |
| 9639 | 0 |
| 9640 | 0 |
| 9641 | 0 |
| 9642 | 0 |
| 9643 | 0 |
| 9644 | 0 |
| 9645 | 0 |
| 9646 | 0 |
| 9647 | 0 |
| 9648 | 0 |
| 9649 | 0 |
| 9650 | 0 |
| 9651 | 0 |
| 9652 | 0 |
| 9653 | 0 |
| 9654 | 0 |
| 9655 | 0 |
| 9656 | 0 |
| 9657 | 0 |
| 9658 | 0 |
| 9659 | 0 |
| 9660 | 0 |
| 9661 | 0 |
| 9662 | 0 |
| 9663 | 0 |
| 9664 | 0 |
| 9665 | 0 |
| 9666 | 0 |
| 9667 | 0 |
| 9668 | 0 |
| 9669 | 0 |
| 9670 | 0 |
| 9671 | 0 |
| 9672 | 0 |
| 9673 | 0 |
| 9674 | 0 |
| 9675 | 0 |
| 9676 | 0 |
| 9677 | 0 |
| 9678 | 0 |
| 9679 | 0 |
| 9680 | 0 |
| 9681 | 0 |
| 9682 | 0 |
| 9683 | 0 |
| 9684 | 0 |
| 9685 | 0 |
| 9686 | 0 |
| 9687 | 0 |
| 9688 | 0 |
| 9689 | 0 |
| 9690 | 0 |
| 9691 | 0 |
| 9692 | 0 |
| 9693 | 0 |
| 9694 | 0 |
| 9695 | 0 |
| 9696 | 0 |
| 9697 | 0 |
| 9698 | 0 |
| 9699 | 0 |
| 9700 | 0 |
| 9701 | 0 |
| 9702 | 0 |
| 9703 | 0 |
| 9704 | 0 |
| 9705 | 0 |
| 9706 | 0 |
| 9707 | 0 |
| 9708 | 0 |
| 9709 | 0 |
| 9710 | 0 |
| 9711 | 0 |
| 9712 | 0 |
| 9713 | 0 |
| 9714 | 0 |
| 9715 | 0 |
| 9716 | 0 |
| 9717 | 0 |
| 9718 | 0 |
| 9719 | 0 |
| 9720 | 0 |
| 9721 | 0 |
| 9722 | 0 |
| 9723 | 0 |
| 9724 | 0 |
| 9725 | 0 |
| 9726 | 0 |
| 9727 | 0 |
| 9728 | 0 |
| 9729 | 0 |
| 9730 | 0 |
| 9731 | 0 |
| 9732 | 0 |
| 9733 | 0 |
| 9734 | 0 |
| 9735 | 0 |
| 9736 | 0 |
| 9737 | 0 |
| 9738 | 0 |
| 9739 | 0 |
| 9740 | 0 |
| 9741 | 0 |
| 9742 | 0 |
| 9743 | 0 |
| 9744 | 0 |
| 9745 | 0 |
| 9746 | 0 |
| 9747 | 0 |
| 9748 | 0 |
| 9749 | 0 |
| 9750 | 0 |
| 9751 | 0 |
| 9752 | 0 |
| 9753 | 0 |
| 9754 | 0 |
| 9755 | 0 |
| 9756 | 0 |
| 9757 | 0 |
| 9758 | 0 |
| 9759 | 0 |
| 9760 | 0 |
| 9761 | 0 |
| 9762 | 0 |
| 9763 | 0 |
| 9764 | 0 |
| 9765 | 0 |
| 9766 | 0 |
| 9767 | 0 |
| 9768 | 0 |
| 9769 | 0 |
| 9770 | 0 |
| 9771 | 0 |
| 9772 | 0 |
| 9773 | 0 |
| 9774 | 0 |
| 9775 | 0 |
| 9776 | 0 |
| 9777 | 0 |
| 9778 | 0 |
| 9779 | 0 |
| 9780 | 0 |
| 9781 | 0 |
| 9782 | 0 |
| 9783 | 0 |
| 9784 | 0 |
| 9785 | 0 |
| 9786 | 0 |
| 9787 | 0 |
| 9788 | 0 |
| 9789 | 0 |
| 9790 | 0 |
| 9791 | 0 |
| 9792 | 0 |
| 9793 | 0 |
| 9794 | 0 |
| 9795 | 0 |
| 9796 | 0 |
| 9797 | 0 |
| 9798 | 0 |
| 9799 | 0 |
| 9800 | 0 |
| 9801 | 0 |
| 9802 | 0 |
| 9803 | 0 |
| 9804 | 0 |
| 9805 | 0 |
| 9806 | 0 |
| 9807 | 0 |
| 9808 | 0 |
| 9809 | 0 |
| 9810 | 0 |
| 9811 | 0 |
| 9812 | 0 |
| 9813 | 0 |
| 9814 | 0 |
| 9815 | 0 |
| 9816 | 0 |
| 9817 | 0 |
| 9818 | 0 |
| 9819 | 0 |
| 9820 | 0 |
| 9821 | 0 |
| 9822 | 0 |
| 9823 | 0 |
| 9824 | 0 |
| 9825 | 0 |
| 9826 | 0 |
| 9827 | 0 |
| 9828 | 0 |
| 9829 | 0 |
| 9830 | 0 |
| 9831 | 0 |
| 9832 | 0 |
| 9833 | 0 |
| 9834 | 0 |
| 9835 | 0 |
| 9836 | 0 |
| 9837 | 0 |
| 9838 | 0 |
| 9839 | 0 |
| 9840 | 0 |
| 9841 | 0 |
| 9842 | 0 |
| 9843 | 0 |
| 9844 | 0 |
| 9845 | 0 |
| 9846 | 0 |
| 9847 | 0 |
| 9848 | 0 |
| 9849 | 0 |
| 9850 | 0 |
| 9851 | 0 |
| 9852 | 0 |
| 9853 | 0 |
| 9854 | 0 |
| 9855 | 0 |
| 9856 | 0 |
| 9857 | 0 |
| 9858 | 0 |
| 9859 | 0 |
| 9860 | 0 |
| 9861 | 0 |
| 9862 | 0 |
| 9863 | 0 |
| 9864 | 0 |
| 9865 | 0 |
| 9866 | 0 |
| 9867 | 0 |
| 9868 | 0 |
| 9869 | 0 |
| 9870 | 0 |
| 9871 | 0 |
| 9872 | 0 |
| 9873 | 0 |
| 9874 | 0 |
| 9875 | 0 |
| 9876 | 0 |
| 9877 | 0 |
| 9878 | 0 |
| 9879 | 0 |
| 9880 | 0 |
| 9881 | 0 |
| 9882 | 0 |
| 9883 | 0 |
| 9884 | 0 |
| 9885 | 0 |
| 9886 | 0 |
| 9887 | 0 |
| 9888 | 0 |
| 9889 | 0 |
| 9890 | 0 |
| 9891 | 0 |
| 9892 | 0 |
| 9893 | 0 |
| 9894 | 0 |
| 9895 | 0 |
| 9896 | 0 |
| 9897 | 0 |
| 9898 | 0 |
| 9899 | 0 |
| 9900 | 0 |
| 9901 | 0 |
| 9902 | 0 |
| 9903 | 0 |
| 9904 | 0 |
| 9905 | 0 |
| 9906 | 0 |
| 9907 | 0 |
| 9908 | 0 |
| 9909 | 0 |
| 9910 | 0 |
| 9911 | 0 |
| 9912 | 0 |
| 9913 | 0 |
| 9914 | 0 |
| 9915 | 0 |
| 9916 | 0 |
| 9917 | 0 |
| 9918 | 0 |
| 9919 | 0 |
| 9920 | 0 |
| 9921 | 0 |
| 9922 | 0 |
| 9923 | 0 |
| 9924 | 0 |
| 9925 | 0 |
| 9926 | 0 |
| 9927 | 0 |
| 9928 | 0 |
| 9929 | 0 |
| 9930 | 0 |
| 9931 | 0 |
| 9932 | 0 |
| 9933 | 0 |
| 9934 | 0 |
| 9935 | 0 |
| 9936 | 0 |
| 9937 | 0 |
| 9938 | 0 |
| 9939 | 0 |
| 9940 | 0 |
| 9941 | 0 |
| 9942 | 0 |
| 9943 | 0 |
| 9944 | 0 |
| 9945 | 0 |
| 9946 | 0 |
| 9947 | 0 |
| 9948 | 0 |
| 9949 | 0 |
| 9950 | 0 |
| 9951 | 0 |
| 9952 | 0 |
| 9953 | 0 |
| 9954 | 0 |
| 9955 | 0 |
| 9956 | 0 |
| 9957 | 0 |
| 9958 | 0 |
| 9959 | 0 |
| 9960 | 0 |
| 9961 | 0 |
| 9962 | 0 |
| 9963 | 0 |
| 9964 | 0 |
| 9965 | 0 |
| 9966 | 0 |
| 9967 | 0 |
| 9968 | 0 |
| 9969 | 0 |
| 9970 | 0 |
| 9971 | 0 |
| 9972 | 0 |
| 9973 | 0 |
| 9974 | 0 |
| 9975 | 0 |
| 9976 | 0 |
| 9977 | 0 |
| 9978 | 0 |
| 9979 | 0 |
| 9980 | 0 |
| 9981 | 0 |
| 9982 | 0 |
| 9983 | 0 |
| 9984 | 0 |
| 9985 | 0 |
| 9986 | 0 |
| 9987 | 0 |
| 9988 | 0 |
| 9989 | 0 |
| 9990 | 0 |
| 9991 | 0 |
| 9992 | 0 |
| 9993 | 0 |
| 9994 | 0 |
| 9995 | 0 |
| 9996 | 0 |
| 9997 | 0 |
| 9998 | 0 |
| 9999 | 0 |